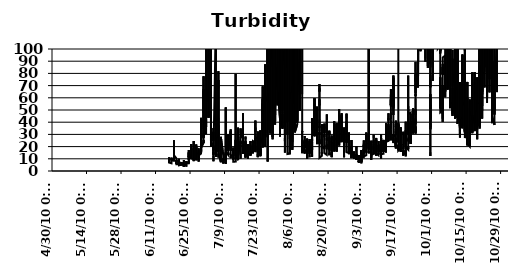
| Category | NTU+ |
|---|---|
| 6/16/10 | 7.97 |
| 6/16/10 | 7.87 |
| 6/16/10 | 7.8 |
| 6/16/10 | 7.2 |
| 6/16/10 | 7.1 |
| 6/16/10 | 11.1 |
| 6/16/10 | 10.4 |
| 6/16/10 | 9.2 |
| 6/16/10 | 9.8 |
| 6/16/10 | 9.6 |
| 6/16/10 | 8.6 |
| 6/16/10 | 8.2 |
| 6/16/10 | 8.3 |
| 6/16/10 | 8 |
| 6/16/10 | 8.8 |
| 6/16/10 | 8.1 |
| 6/16/10 | 7 |
| 6/16/10 | 7.2 |
| 6/16/10 | 7.4 |
| 6/16/10 | 7.9 |
| 6/16/10 | 8 |
| 6/16/10 | 6.9 |
| 6/16/10 | 7.6 |
| 6/16/10 | 6.8 |
| 6/17/10 | 6.3 |
| 6/17/10 | 6.6 |
| 6/17/10 | 6.2 |
| 6/17/10 | 6.4 |
| 6/17/10 | 6.5 |
| 6/17/10 | 6.4 |
| 6/17/10 | 6.9 |
| 6/17/10 | 6.9 |
| 6/17/10 | 7.1 |
| 6/17/10 | 6.4 |
| 6/17/10 | 6.9 |
| 6/17/10 | 7.2 |
| 6/17/10 | 7.3 |
| 6/17/10 | 6.7 |
| 6/17/10 | 7.2 |
| 6/17/10 | 7.5 |
| 6/17/10 | 7.4 |
| 6/17/10 | 7.6 |
| 6/17/10 | 7.7 |
| 6/17/10 | 8.2 |
| 6/17/10 | 7.9 |
| 6/17/10 | 8.4 |
| 6/17/10 | 9.1 |
| 6/17/10 | 8.8 |
| 6/17/10 | 9.2 |
| 6/17/10 | 9.3 |
| 6/17/10 | 8.6 |
| 6/17/10 | 8.7 |
| 6/17/10 | 9 |
| 6/17/10 | 9 |
| 6/17/10 | 9 |
| 6/17/10 | 10 |
| 6/17/10 | 8.9 |
| 6/17/10 | 9.3 |
| 6/17/10 | 9.6 |
| 6/17/10 | 10.9 |
| 6/17/10 | 10.2 |
| 6/17/10 | 10.8 |
| 6/17/10 | 11.4 |
| 6/17/10 | 10.7 |
| 6/17/10 | 10 |
| 6/17/10 | 9.2 |
| 6/17/10 | 8.6 |
| 6/17/10 | 8.3 |
| 6/17/10 | 9.1 |
| 6/17/10 | 9.1 |
| 6/17/10 | 8.5 |
| 6/17/10 | 8.7 |
| 6/18/10 | 8.4 |
| 6/18/10 | 9.4 |
| 6/18/10 | 10.2 |
| 6/18/10 | 9.9 |
| 6/18/10 | 11.4 |
| 6/18/10 | 11.7 |
| 6/18/10 | 11.4 |
| 6/18/10 | 11.5 |
| 6/18/10 | 11.9 |
| 6/18/10 | 13.1 |
| 6/18/10 | 12.5 |
| 6/18/10 | 13.9 |
| 6/18/10 | 12.5 |
| 6/18/10 | 14.3 |
| 6/18/10 | 16.4 |
| 6/18/10 | 17.7 |
| 6/18/10 | 18.9 |
| 6/18/10 | 18.6 |
| 6/18/10 | 20.2 |
| 6/18/10 | 20.4 |
| 6/18/10 | 20.4 |
| 6/18/10 | 15.1 |
| 6/18/10 | 25.1 |
| 6/18/10 | 16.9 |
| 6/18/10 | 16.4 |
| 6/18/10 | 15.4 |
| 6/18/10 | 13 |
| 6/18/10 | 12.4 |
| 6/18/10 | 12.5 |
| 6/18/10 | 12.9 |
| 6/18/10 | 12.6 |
| 6/18/10 | 14.1 |
| 6/18/10 | 12.1 |
| 6/18/10 | 12.1 |
| 6/18/10 | 14.6 |
| 6/18/10 | 14.4 |
| 6/18/10 | 13.8 |
| 6/18/10 | 13 |
| 6/18/10 | 14.1 |
| 6/18/10 | 14.1 |
| 6/18/10 | 13 |
| 6/18/10 | 13.1 |
| 6/18/10 | 12.1 |
| 6/18/10 | 12.3 |
| 6/18/10 | 12 |
| 6/18/10 | 12.2 |
| 6/18/10 | 11.1 |
| 6/18/10 | 12.9 |
| 6/19/10 | 10.3 |
| 6/19/10 | 10.8 |
| 6/19/10 | 10.7 |
| 6/19/10 | 10.2 |
| 6/19/10 | 10.8 |
| 6/19/10 | 10.1 |
| 6/19/10 | 10.6 |
| 6/19/10 | 9.7 |
| 6/19/10 | 9.4 |
| 6/19/10 | 8.4 |
| 6/19/10 | 8.6 |
| 6/19/10 | 7.9 |
| 6/19/10 | 7.8 |
| 6/19/10 | 7.3 |
| 6/19/10 | 7.1 |
| 6/19/10 | 7.3 |
| 6/19/10 | 7.4 |
| 6/19/10 | 6.7 |
| 6/19/10 | 5.8 |
| 6/19/10 | 6.8 |
| 6/19/10 | 7.1 |
| 6/19/10 | 8.8 |
| 6/19/10 | 7.7 |
| 6/19/10 | 8.5 |
| 6/19/10 | 8.5 |
| 6/19/10 | 7.3 |
| 6/19/10 | 8.7 |
| 6/19/10 | 7.4 |
| 6/19/10 | 7 |
| 6/19/10 | 7.1 |
| 6/19/10 | 7.3 |
| 6/19/10 | 6.8 |
| 6/19/10 | 6.9 |
| 6/19/10 | 5.6 |
| 6/19/10 | 7 |
| 6/19/10 | 6.5 |
| 6/19/10 | 7.4 |
| 6/19/10 | 6.9 |
| 6/19/10 | 7.2 |
| 6/19/10 | 7.5 |
| 6/19/10 | 9.1 |
| 6/19/10 | 6.7 |
| 6/19/10 | 6.4 |
| 6/19/10 | 6.3 |
| 6/19/10 | 5.5 |
| 6/19/10 | 5.5 |
| 6/19/10 | 5.5 |
| 6/19/10 | 5.5 |
| 6/20/10 | 5.4 |
| 6/20/10 | 6.5 |
| 6/20/10 | 5.7 |
| 6/20/10 | 5.8 |
| 6/20/10 | 5.3 |
| 6/20/10 | 5.2 |
| 6/20/10 | 5.5 |
| 6/20/10 | 5.7 |
| 6/20/10 | 4.8 |
| 6/20/10 | 5.6 |
| 6/20/10 | 6.6 |
| 6/20/10 | 5.6 |
| 6/20/10 | 5.5 |
| 6/20/10 | 5.4 |
| 6/20/10 | 5.5 |
| 6/20/10 | 5.4 |
| 6/20/10 | 5 |
| 6/20/10 | 5.2 |
| 6/20/10 | 5.6 |
| 6/20/10 | 5.3 |
| 6/20/10 | 5.8 |
| 6/20/10 | 5.3 |
| 6/20/10 | 6.3 |
| 6/20/10 | 6.8 |
| 6/20/10 | 7.8 |
| 6/20/10 | 9.7 |
| 6/20/10 | 9.4 |
| 6/20/10 | 8.5 |
| 6/20/10 | 9.1 |
| 6/20/10 | 8.7 |
| 6/20/10 | 10 |
| 6/20/10 | 10.7 |
| 6/20/10 | 10.3 |
| 6/20/10 | 9.4 |
| 6/20/10 | 9.3 |
| 6/20/10 | 8.5 |
| 6/20/10 | 7.5 |
| 6/20/10 | 7.8 |
| 6/20/10 | 6.6 |
| 6/20/10 | 7.6 |
| 6/20/10 | 6.2 |
| 6/20/10 | 5.1 |
| 6/20/10 | 5.5 |
| 6/20/10 | 6.4 |
| 6/20/10 | 4.6 |
| 6/20/10 | 5.2 |
| 6/20/10 | 5.1 |
| 6/20/10 | 4.8 |
| 6/21/10 | 5.1 |
| 6/21/10 | 6.7 |
| 6/21/10 | 6.5 |
| 6/21/10 | 7.4 |
| 6/21/10 | 5.9 |
| 6/21/10 | 4.7 |
| 6/21/10 | 6.1 |
| 6/21/10 | 5.3 |
| 6/21/10 | 5.3 |
| 6/21/10 | 5.1 |
| 6/21/10 | 5.9 |
| 6/21/10 | 4.8 |
| 6/21/10 | 4.7 |
| 6/21/10 | 6.6 |
| 6/21/10 | 5.9 |
| 6/21/10 | 5 |
| 6/21/10 | 5.3 |
| 6/21/10 | 5.2 |
| 6/21/10 | 4.7 |
| 6/21/10 | 5 |
| 6/21/10 | 7 |
| 6/21/10 | 5.8 |
| 6/21/10 | 6.1 |
| 6/21/10 | 5.2 |
| 6/21/10 | 5 |
| 6/21/10 | 5.9 |
| 6/21/10 | 6.2 |
| 6/21/10 | 5.3 |
| 6/21/10 | 7.3 |
| 6/21/10 | 4.8 |
| 6/21/10 | 5.4 |
| 6/21/10 | 6.7 |
| 6/21/10 | 6.6 |
| 6/21/10 | 6.9 |
| 6/21/10 | 6.4 |
| 6/21/10 | 6.4 |
| 6/21/10 | 5.7 |
| 6/21/10 | 5 |
| 6/21/10 | 5.5 |
| 6/21/10 | 6.4 |
| 6/21/10 | 6.2 |
| 6/21/10 | 5.3 |
| 6/21/10 | 6.1 |
| 6/21/10 | 4.9 |
| 6/21/10 | 6.8 |
| 6/21/10 | 5.4 |
| 6/21/10 | 5.5 |
| 6/21/10 | 6.4 |
| 6/22/10 | 4.8 |
| 6/22/10 | 4.8 |
| 6/22/10 | 4.9 |
| 6/22/10 | 4.8 |
| 6/22/10 | 3.8 |
| 6/22/10 | 3.5 |
| 6/22/10 | 3.8 |
| 6/22/10 | 5.6 |
| 6/22/10 | 3.3 |
| 6/22/10 | 5 |
| 6/22/10 | 4.6 |
| 6/22/10 | 4 |
| 6/22/10 | 3.9 |
| 6/22/10 | 5 |
| 6/22/10 | 5.1 |
| 6/22/10 | 3.9 |
| 6/22/10 | 4.2 |
| 6/22/10 | 3.6 |
| 6/22/10 | 3.7 |
| 6/22/10 | 3.4 |
| 6/22/10 | 3.4 |
| 6/22/10 | 4.1 |
| 6/22/10 | 4 |
| 6/22/10 | 4.3 |
| 6/22/10 | 3.9 |
| 6/22/10 | 3.7 |
| 6/22/10 | 4.1 |
| 6/22/10 | 5.7 |
| 6/22/10 | 4.7 |
| 6/22/10 | 5.1 |
| 6/22/10 | 5 |
| 6/22/10 | 5.3 |
| 6/22/10 | 6.3 |
| 6/22/10 | 5.5 |
| 6/22/10 | 8.9 |
| 6/22/10 | 8.1 |
| 6/22/10 | 8.7 |
| 6/22/10 | 8.2 |
| 6/22/10 | 8.6 |
| 6/22/10 | 8.4 |
| 6/22/10 | 7.7 |
| 6/22/10 | 7.2 |
| 6/22/10 | 5 |
| 6/22/10 | 4.9 |
| 6/22/10 | 4.4 |
| 6/22/10 | 4.1 |
| 6/22/10 | 5.4 |
| 6/22/10 | 4.7 |
| 6/23/10 | 4.7 |
| 6/23/10 | 4.7 |
| 6/23/10 | 4.7 |
| 6/23/10 | 4.1 |
| 6/23/10 | 4.5 |
| 6/23/10 | 5.3 |
| 6/23/10 | 4.4 |
| 6/23/10 | 4.8 |
| 6/23/10 | 4.7 |
| 6/23/10 | 4.4 |
| 6/23/10 | 4.7 |
| 6/23/10 | 5.4 |
| 6/23/10 | 4.9 |
| 6/23/10 | 5.1 |
| 6/23/10 | 5.1 |
| 6/23/10 | 4.5 |
| 6/23/10 | 5 |
| 6/23/10 | 3.6 |
| 6/23/10 | 4.6 |
| 6/23/10 | 4 |
| 6/23/10 | 4.7 |
| 6/23/10 | 5.8 |
| 6/23/10 | 5 |
| 6/23/10 | 5.7 |
| 6/23/10 | 5.5 |
| 6/23/10 | 5.4 |
| 6/23/10 | 6 |
| 6/23/10 | 7.5 |
| 6/23/10 | 7.6 |
| 6/23/10 | 5.8 |
| 6/23/10 | 6 |
| 6/23/10 | 6.6 |
| 6/23/10 | 7.9 |
| 6/23/10 | 7.1 |
| 6/23/10 | 7.4 |
| 6/23/10 | 6 |
| 6/23/10 | 7 |
| 6/23/10 | 7.9 |
| 6/23/10 | 7.1 |
| 6/23/10 | 6 |
| 6/23/10 | 7.2 |
| 6/23/10 | 6.6 |
| 6/23/10 | 6.5 |
| 6/23/10 | 7.1 |
| 6/23/10 | 7.6 |
| 6/23/10 | 6.6 |
| 6/23/10 | 7.5 |
| 6/23/10 | 6.1 |
| 6/24/10 | 6.3 |
| 6/24/10 | 7.1 |
| 6/24/10 | 6.2 |
| 6/24/10 | 6.9 |
| 6/24/10 | 6.4 |
| 6/24/10 | 7 |
| 6/24/10 | 6.1 |
| 6/24/10 | 7.3 |
| 6/24/10 | 6.3 |
| 6/24/10 | 6.7 |
| 6/24/10 | 6.9 |
| 6/24/10 | 7.2 |
| 6/24/10 | 6.4 |
| 6/24/10 | 8.3 |
| 6/24/10 | 7.7 |
| 6/24/10 | 7.6 |
| 6/24/10 | 7.9 |
| 6/24/10 | 6.9 |
| 6/24/10 | 7.5 |
| 6/24/10 | 8.9 |
| 6/24/10 | 8.9 |
| 6/24/10 | 8.9 |
| 6/24/10 | 8.9 |
| 6/24/10 | 9.9 |
| 6/24/10 | 9 |
| 6/24/10 | 9.6 |
| 6/24/10 | 8.9 |
| 6/24/10 | 10.7 |
| 6/24/10 | 13.5 |
| 6/24/10 | 14.6 |
| 6/24/10 | 14.9 |
| 6/24/10 | 17.2 |
| 6/24/10 | 13.4 |
| 6/24/10 | 11.7 |
| 6/24/10 | 13.8 |
| 6/24/10 | 15.4 |
| 6/24/10 | 14 |
| 6/24/10 | 14.8 |
| 6/24/10 | 11.7 |
| 6/24/10 | 11.7 |
| 6/24/10 | 14.1 |
| 6/24/10 | 15 |
| 6/24/10 | 11.2 |
| 6/24/10 | 12.5 |
| 6/24/10 | 9.8 |
| 6/24/10 | 11.7 |
| 6/24/10 | 12.1 |
| 6/24/10 | 12.5 |
| 6/25/10 | 12.7 |
| 6/25/10 | 11.1 |
| 6/25/10 | 11.9 |
| 6/25/10 | 12.1 |
| 6/25/10 | 14.7 |
| 6/25/10 | 11.5 |
| 6/25/10 | 13.3 |
| 6/25/10 | 11.1 |
| 6/25/10 | 10.2 |
| 6/25/10 | 10.1 |
| 6/25/10 | 14.1 |
| 6/25/10 | 11.7 |
| 6/25/10 | 13.8 |
| 6/25/10 | 11.7 |
| 6/25/10 | 12.4 |
| 6/25/10 | 15.4 |
| 6/25/10 | 15.4 |
| 6/25/10 | 16 |
| 6/25/10 | 14.1 |
| 6/25/10 | 18.5 |
| 6/25/10 | 14.1 |
| 6/25/10 | 18 |
| 6/25/10 | 16.3 |
| 6/25/10 | 15.1 |
| 6/25/10 | 17.3 |
| 6/25/10 | 16.1 |
| 6/25/10 | 22.1 |
| 6/25/10 | 13.2 |
| 6/25/10 | 13.5 |
| 6/25/10 | 16.8 |
| 6/25/10 | 18.9 |
| 6/25/10 | 16.9 |
| 6/25/10 | 16.8 |
| 6/25/10 | 12.4 |
| 6/25/10 | 12.2 |
| 6/25/10 | 12.6 |
| 6/25/10 | 11.1 |
| 6/25/10 | 12.6 |
| 6/25/10 | 12 |
| 6/25/10 | 10.5 |
| 6/25/10 | 10.5 |
| 6/25/10 | 11 |
| 6/25/10 | 11.9 |
| 6/25/10 | 13.3 |
| 6/25/10 | 10.2 |
| 6/25/10 | 10.4 |
| 6/25/10 | 10.6 |
| 6/25/10 | 11 |
| 6/26/10 | 9.7 |
| 6/26/10 | 10.2 |
| 6/26/10 | 8.9 |
| 6/26/10 | 9 |
| 6/26/10 | 9.8 |
| 6/26/10 | 9.3 |
| 6/26/10 | 10.6 |
| 6/26/10 | 9.7 |
| 6/26/10 | 9.2 |
| 6/26/10 | 9.7 |
| 6/26/10 | 10.2 |
| 6/26/10 | 9.7 |
| 6/26/10 | 10.1 |
| 6/26/10 | 13.4 |
| 6/26/10 | 13.6 |
| 6/26/10 | 12.2 |
| 6/26/10 | 14.2 |
| 6/26/10 | 14 |
| 6/26/10 | 11.3 |
| 6/26/10 | 11.8 |
| 6/26/10 | 10.2 |
| 6/26/10 | 13.5 |
| 6/26/10 | 13.1 |
| 6/26/10 | 10.6 |
| 6/26/10 | 12.4 |
| 6/26/10 | 13.7 |
| 6/26/10 | 12.6 |
| 6/26/10 | 10.6 |
| 6/26/10 | 10.4 |
| 6/26/10 | 10.8 |
| 6/26/10 | 14.3 |
| 6/26/10 | 11.2 |
| 6/26/10 | 14.8 |
| 6/26/10 | 11.8 |
| 6/26/10 | 10.5 |
| 6/26/10 | 17.2 |
| 6/26/10 | 16.5 |
| 6/26/10 | 11.6 |
| 6/26/10 | 16.6 |
| 6/26/10 | 10.1 |
| 6/26/10 | 12.1 |
| 6/26/10 | 12.9 |
| 6/26/10 | 8.1 |
| 6/26/10 | 11.8 |
| 6/26/10 | 9.9 |
| 6/26/10 | 24.5 |
| 6/26/10 | 12 |
| 6/26/10 | 9.6 |
| 6/27/10 | 10.6 |
| 6/27/10 | 11.5 |
| 6/27/10 | 9.9 |
| 6/27/10 | 15.1 |
| 6/27/10 | 8.8 |
| 6/27/10 | 9.8 |
| 6/27/10 | 10.9 |
| 6/27/10 | 9.2 |
| 6/27/10 | 9.6 |
| 6/27/10 | 10 |
| 6/27/10 | 10.3 |
| 6/27/10 | 10.9 |
| 6/27/10 | 9.7 |
| 6/27/10 | 10.8 |
| 6/27/10 | 10.6 |
| 6/27/10 | 9.4 |
| 6/27/10 | 10.5 |
| 6/27/10 | 10.8 |
| 6/27/10 | 10.1 |
| 6/27/10 | 9.4 |
| 6/27/10 | 9.3 |
| 6/27/10 | 9.9 |
| 6/27/10 | 9.5 |
| 6/27/10 | 9 |
| 6/27/10 | 16.3 |
| 6/27/10 | 13.1 |
| 6/27/10 | 9.7 |
| 6/27/10 | 14.8 |
| 6/27/10 | 12.7 |
| 6/27/10 | 19.2 |
| 6/27/10 | 13.5 |
| 6/27/10 | 19.7 |
| 6/27/10 | 15.9 |
| 6/27/10 | 16.2 |
| 6/27/10 | 21.7 |
| 6/27/10 | 15.4 |
| 6/27/10 | 12.4 |
| 6/27/10 | 16.4 |
| 6/27/10 | 16.5 |
| 6/27/10 | 14.6 |
| 6/27/10 | 14.1 |
| 6/27/10 | 11.3 |
| 6/27/10 | 11.5 |
| 6/27/10 | 11.9 |
| 6/27/10 | 12 |
| 6/27/10 | 14 |
| 6/27/10 | 11 |
| 6/27/10 | 15.9 |
| 6/28/10 | 13.3 |
| 6/28/10 | 10.6 |
| 6/28/10 | 9.8 |
| 6/28/10 | 11.7 |
| 6/28/10 | 13.8 |
| 6/28/10 | 13.3 |
| 6/28/10 | 9.8 |
| 6/28/10 | 10.8 |
| 6/28/10 | 12 |
| 6/28/10 | 15.2 |
| 6/28/10 | 10.8 |
| 6/28/10 | 13 |
| 6/28/10 | 14.8 |
| 6/28/10 | 8.8 |
| 6/28/10 | 12.7 |
| 6/28/10 | 10.8 |
| 6/28/10 | 11.4 |
| 6/28/10 | 12.1 |
| 6/28/10 | 11.1 |
| 6/28/10 | 10 |
| 6/28/10 | 12.4 |
| 6/28/10 | 11.4 |
| 6/28/10 | 12.3 |
| 6/28/10 | 11.7 |
| 6/28/10 | 14.1 |
| 6/28/10 | 15.8 |
| 6/28/10 | 11.1 |
| 6/28/10 | 11.5 |
| 6/28/10 | 11.5 |
| 6/28/10 | 12 |
| 6/28/10 | 12.6 |
| 6/28/10 | 14.6 |
| 6/28/10 | 15.7 |
| 6/28/10 | 15.2 |
| 6/28/10 | 18.6 |
| 6/28/10 | 14.4 |
| 6/28/10 | 11.6 |
| 6/28/10 | 13.3 |
| 6/28/10 | 13.1 |
| 6/28/10 | 17.1 |
| 6/28/10 | 16.4 |
| 6/28/10 | 17.3 |
| 6/28/10 | 13.5 |
| 6/28/10 | 7.7 |
| 6/28/10 | 11.6 |
| 6/28/10 | 13.7 |
| 6/28/10 | 12.7 |
| 6/28/10 | 13.3 |
| 6/29/10 | 14.3 |
| 6/29/10 | 13.7 |
| 6/29/10 | 14.6 |
| 6/29/10 | 13.9 |
| 6/29/10 | 15.3 |
| 6/29/10 | 16.2 |
| 6/29/10 | 15.3 |
| 6/29/10 | 16.6 |
| 6/29/10 | 17.4 |
| 6/29/10 | 17.4 |
| 6/29/10 | 17.8 |
| 6/29/10 | 19.3 |
| 6/29/10 | 20.1 |
| 6/29/10 | 20.7 |
| 6/29/10 | 22.8 |
| 6/29/10 | 20.7 |
| 6/29/10 | 21.1 |
| 6/29/10 | 22.1 |
| 6/29/10 | 20.4 |
| 6/29/10 | 20.3 |
| 6/29/10 | 28 |
| 6/29/10 | 20.4 |
| 6/29/10 | 21.8 |
| 6/29/10 | 21 |
| 6/29/10 | 22 |
| 6/29/10 | 23.1 |
| 6/29/10 | 23.2 |
| 6/29/10 | 30.7 |
| 6/29/10 | 26.6 |
| 6/29/10 | 29 |
| 6/29/10 | 27.5 |
| 6/29/10 | 27.6 |
| 6/29/10 | 27.8 |
| 6/29/10 | 33.6 |
| 6/29/10 | 33.3 |
| 6/29/10 | 37.1 |
| 6/29/10 | 35.9 |
| 6/29/10 | 38.9 |
| 6/29/10 | 42.6 |
| 6/29/10 | 32.8 |
| 6/29/10 | 28.7 |
| 6/29/10 | 30.3 |
| 6/29/10 | 31 |
| 6/29/10 | 43.6 |
| 6/29/10 | 16.2 |
| 6/29/10 | 17.6 |
| 6/29/10 | 21.7 |
| 6/29/10 | 19.2 |
| 6/30/10 | 23.3 |
| 6/30/10 | 22.6 |
| 6/30/10 | 25.4 |
| 6/30/10 | 23.1 |
| 6/30/10 | 23.6 |
| 6/30/10 | 24 |
| 6/30/10 | 29.7 |
| 6/30/10 | 27.2 |
| 6/30/10 | 30.9 |
| 6/30/10 | 29.8 |
| 6/30/10 | 33 |
| 6/30/10 | 36 |
| 6/30/10 | 37.3 |
| 6/30/10 | 40.9 |
| 6/30/10 | 40.3 |
| 6/30/10 | 40.8 |
| 6/30/10 | 40 |
| 6/30/10 | 37.9 |
| 6/30/10 | 53 |
| 6/30/10 | 60.9 |
| 6/30/10 | 61.1 |
| 6/30/10 | 48 |
| 6/30/10 | 61.2 |
| 6/30/10 | 55.6 |
| 6/30/10 | 77.6 |
| 6/30/10 | 78 |
| 6/30/10 | 66.6 |
| 6/30/10 | 62.8 |
| 6/30/10 | 50.3 |
| 6/30/10 | 43.1 |
| 6/30/10 | 46.3 |
| 6/30/10 | 52.3 |
| 6/30/10 | 55.4 |
| 6/30/10 | 59.5 |
| 6/30/10 | 63.9 |
| 6/30/10 | 62.3 |
| 6/30/10 | 65.5 |
| 6/30/10 | 59.8 |
| 6/30/10 | 67.3 |
| 6/30/10 | 39.2 |
| 6/30/10 | 42.9 |
| 6/30/10 | 34.4 |
| 6/30/10 | 38.4 |
| 6/30/10 | 31.6 |
| 6/30/10 | 31.7 |
| 6/30/10 | 31.5 |
| 6/30/10 | 28 |
| 6/30/10 | 35.1 |
| 7/1/10 | 30.3 |
| 7/1/10 | 44.7 |
| 7/1/10 | 39.2 |
| 7/1/10 | 35.7 |
| 7/1/10 | 39.6 |
| 7/1/10 | 42.4 |
| 7/1/10 | 35.8 |
| 7/1/10 | 37.3 |
| 7/1/10 | 37.3 |
| 7/1/10 | 39.5 |
| 7/1/10 | 42.6 |
| 7/1/10 | 45 |
| 7/1/10 | 50.4 |
| 7/1/10 | 51.1 |
| 7/1/10 | 51.9 |
| 7/1/10 | 50.5 |
| 7/1/10 | 63.4 |
| 7/1/10 | 47.7 |
| 7/1/10 | 63 |
| 7/1/10 | 44.5 |
| 7/1/10 | 48.8 |
| 7/1/10 | 72.2 |
| 7/1/10 | 52.1 |
| 7/1/10 | 63.9 |
| 7/1/10 | 64.6 |
| 7/1/10 | 62.6 |
| 7/1/10 | 60 |
| 7/1/10 | 71.5 |
| 7/1/10 | 91.5 |
| 7/1/10 | 75.7 |
| 7/1/10 | 69.5 |
| 7/1/10 | 62.7 |
| 7/1/10 | 95.1 |
| 7/1/10 | 67 |
| 7/1/10 | 76.7 |
| 7/1/10 | 94.7 |
| 7/1/10 | 83.6 |
| 7/1/10 | 128.4 |
| 7/1/10 | 67.5 |
| 7/1/10 | 110.8 |
| 7/1/10 | 68.5 |
| 7/1/10 | 66.3 |
| 7/1/10 | 56.4 |
| 7/1/10 | 55.5 |
| 7/1/10 | 47.9 |
| 7/1/10 | 62 |
| 7/1/10 | 57 |
| 7/1/10 | 49.6 |
| 7/2/10 | 70.4 |
| 7/2/10 | 64.3 |
| 7/2/10 | 56.4 |
| 7/2/10 | 52.4 |
| 7/2/10 | 49.8 |
| 7/2/10 | 46.5 |
| 7/2/10 | 47.7 |
| 7/2/10 | 47.6 |
| 7/2/10 | 49.3 |
| 7/2/10 | 52.4 |
| 7/2/10 | 61.9 |
| 7/2/10 | 58.8 |
| 7/2/10 | 56.9 |
| 7/2/10 | 57 |
| 7/2/10 | 71.8 |
| 7/2/10 | 65.1 |
| 7/2/10 | 73.4 |
| 7/2/10 | 77 |
| 7/2/10 | 68.3 |
| 7/2/10 | 62.7 |
| 7/2/10 | 77.2 |
| 7/2/10 | 73.6 |
| 7/2/10 | 61.1 |
| 7/2/10 | 88.4 |
| 7/2/10 | 66.6 |
| 7/2/10 | 101.5 |
| 7/2/10 | 69.6 |
| 7/2/10 | 82.3 |
| 7/2/10 | 52.2 |
| 7/2/10 | 83.1 |
| 7/2/10 | 44.3 |
| 7/2/10 | 57.9 |
| 7/2/10 | 50.1 |
| 7/2/10 | 64.4 |
| 7/2/10 | 76.6 |
| 7/2/10 | 77 |
| 7/2/10 | 52.7 |
| 7/2/10 | 48.4 |
| 7/2/10 | 91.7 |
| 7/2/10 | 66.7 |
| 7/2/10 | 69 |
| 7/2/10 | 106.9 |
| 7/2/10 | 48.1 |
| 7/2/10 | 49.3 |
| 7/2/10 | 53.5 |
| 7/2/10 | 80.7 |
| 7/2/10 | 43.5 |
| 7/2/10 | 95.4 |
| 7/3/10 | 55.6 |
| 7/3/10 | 19.9 |
| 7/3/10 | 22.6 |
| 7/3/10 | 25 |
| 7/3/10 | 31.5 |
| 7/3/10 | 53.9 |
| 7/3/10 | 36.3 |
| 7/3/10 | 31.7 |
| 7/3/10 | 32.3 |
| 7/3/10 | 32.5 |
| 7/3/10 | 36.5 |
| 7/3/10 | 33.8 |
| 7/3/10 | 34.6 |
| 7/3/10 | 42.9 |
| 7/3/10 | 37.5 |
| 7/3/10 | 39.5 |
| 7/3/10 | 84.9 |
| 7/3/10 | 54.4 |
| 7/3/10 | 60 |
| 7/3/10 | 67.4 |
| 7/3/10 | 61.9 |
| 7/3/10 | 81.9 |
| 7/3/10 | 48.1 |
| 7/3/10 | 48.8 |
| 7/3/10 | 89.4 |
| 7/3/10 | 40.6 |
| 7/3/10 | 42 |
| 7/3/10 | 46.7 |
| 7/3/10 | 55 |
| 7/3/10 | 146.4 |
| 7/3/10 | 45.1 |
| 7/3/10 | 103.6 |
| 7/3/10 | 50.4 |
| 7/3/10 | 53.1 |
| 7/3/10 | 61.5 |
| 7/3/10 | 289.8 |
| 7/3/10 | 286.4 |
| 7/3/10 | 225.2 |
| 7/3/10 | 219.8 |
| 7/3/10 | 186.2 |
| 7/3/10 | 186.1 |
| 7/3/10 | 85.6 |
| 7/3/10 | 85 |
| 7/3/10 | 159.9 |
| 7/3/10 | 122.6 |
| 7/3/10 | 212.1 |
| 7/3/10 | 314.1 |
| 7/3/10 | 24 |
| 7/4/10 | 20.5 |
| 7/4/10 | 14.2 |
| 7/4/10 | 15.5 |
| 7/4/10 | 13.3 |
| 7/4/10 | 14 |
| 7/4/10 | 15 |
| 7/4/10 | 16 |
| 7/4/10 | 17 |
| 7/4/10 | 16.7 |
| 7/4/10 | 21 |
| 7/4/10 | 18.1 |
| 7/4/10 | 17.5 |
| 7/4/10 | 17.6 |
| 7/4/10 | 17.7 |
| 7/4/10 | 17.2 |
| 7/4/10 | 19 |
| 7/4/10 | 19.6 |
| 7/4/10 | 18.7 |
| 7/4/10 | 19 |
| 7/4/10 | 20.8 |
| 7/4/10 | 16.9 |
| 7/4/10 | 17.5 |
| 7/4/10 | 17.5 |
| 7/4/10 | 18.6 |
| 7/4/10 | 21.2 |
| 7/4/10 | 20.7 |
| 7/4/10 | 21.2 |
| 7/4/10 | 32.2 |
| 7/4/10 | 24.5 |
| 7/4/10 | 24.5 |
| 7/4/10 | 29.6 |
| 7/4/10 | 25.3 |
| 7/4/10 | 27.3 |
| 7/4/10 | 26.6 |
| 7/4/10 | 28.5 |
| 7/4/10 | 35.2 |
| 7/4/10 | 26.3 |
| 7/4/10 | 28.8 |
| 7/4/10 | 29.8 |
| 7/4/10 | 32 |
| 7/4/10 | 27.7 |
| 7/4/10 | 30.2 |
| 7/4/10 | 31.2 |
| 7/4/10 | 31.1 |
| 7/4/10 | 26.6 |
| 7/4/10 | 26 |
| 7/4/10 | 8 |
| 7/4/10 | 12.5 |
| 7/5/10 | 126.3 |
| 7/5/10 | 13.3 |
| 7/5/10 | 42.2 |
| 7/5/10 | 42.2 |
| 7/5/10 | 17.4 |
| 7/5/10 | 33.8 |
| 7/5/10 | 17.9 |
| 7/5/10 | 11.5 |
| 7/5/10 | 15.8 |
| 7/5/10 | 19.1 |
| 7/5/10 | 25.6 |
| 7/5/10 | 28.7 |
| 7/5/10 | 37.4 |
| 7/5/10 | 28.6 |
| 7/5/10 | 19.6 |
| 7/5/10 | 16.1 |
| 7/5/10 | 18.9 |
| 7/5/10 | 16 |
| 7/5/10 | 19.4 |
| 7/5/10 | 20.5 |
| 7/5/10 | 30.1 |
| 7/5/10 | 30.8 |
| 7/5/10 | 25.7 |
| 7/5/10 | 23.6 |
| 7/5/10 | 25.2 |
| 7/5/10 | 26.4 |
| 7/5/10 | 31.7 |
| 7/5/10 | 15.3 |
| 7/5/10 | 14.2 |
| 7/5/10 | 13.6 |
| 7/5/10 | 13.1 |
| 7/5/10 | 13.4 |
| 7/5/10 | 15.5 |
| 7/5/10 | 13.2 |
| 7/5/10 | 14.1 |
| 7/5/10 | 14.2 |
| 7/5/10 | 12.7 |
| 7/5/10 | 12.6 |
| 7/5/10 | 13.7 |
| 7/5/10 | 12.9 |
| 7/5/10 | 18.3 |
| 7/5/10 | 14.7 |
| 7/5/10 | 15.4 |
| 7/5/10 | 13.9 |
| 7/5/10 | 13.2 |
| 7/5/10 | 13.1 |
| 7/5/10 | 14 |
| 7/5/10 | 26.3 |
| 7/6/10 | 29.7 |
| 7/6/10 | 29.5 |
| 7/6/10 | 28.2 |
| 7/6/10 | 20.1 |
| 7/6/10 | 18.9 |
| 7/6/10 | 17.4 |
| 7/6/10 | 19.4 |
| 7/6/10 | 20.7 |
| 7/6/10 | 19.1 |
| 7/6/10 | 18.8 |
| 7/6/10 | 26.7 |
| 7/6/10 | 24 |
| 7/6/10 | 16.9 |
| 7/6/10 | 18.4 |
| 7/6/10 | 16.4 |
| 7/6/10 | 37.4 |
| 7/6/10 | 18.8 |
| 7/6/10 | 33 |
| 7/6/10 | 31.4 |
| 7/6/10 | 74.6 |
| 7/6/10 | 67.8 |
| 7/6/10 | 30.8 |
| 7/6/10 | 27.9 |
| 7/6/10 | 24.5 |
| 7/6/10 | 23.3 |
| 7/6/10 | 26.9 |
| 7/6/10 | 23.8 |
| 7/6/10 | 24.1 |
| 7/6/10 | 23.8 |
| 7/6/10 | 23.7 |
| 7/6/10 | 27.6 |
| 7/6/10 | 35.2 |
| 7/6/10 | 25.4 |
| 7/6/10 | 30.8 |
| 7/6/10 | 26 |
| 7/6/10 | 18.1 |
| 7/6/10 | 17.6 |
| 7/6/10 | 43.7 |
| 7/6/10 | 81.8 |
| 7/6/10 | 15.8 |
| 7/6/10 | 24.6 |
| 7/6/10 | 22 |
| 7/6/10 | 17.9 |
| 7/6/10 | 19.5 |
| 7/6/10 | 19.8 |
| 7/6/10 | 14.7 |
| 7/6/10 | 11.1 |
| 7/6/10 | 14.4 |
| 7/7/10 | 8 |
| 7/7/10 | 11 |
| 7/7/10 | 13.6 |
| 7/7/10 | 14.1 |
| 7/7/10 | 18.5 |
| 7/7/10 | 13.6 |
| 7/7/10 | 17.5 |
| 7/7/10 | 9.6 |
| 7/7/10 | 9.4 |
| 7/7/10 | 9 |
| 7/7/10 | 10 |
| 7/7/10 | 11 |
| 7/7/10 | 10.2 |
| 7/7/10 | 10.1 |
| 7/7/10 | 10.7 |
| 7/7/10 | 10.9 |
| 7/7/10 | 9.4 |
| 7/7/10 | 11.3 |
| 7/7/10 | 11.7 |
| 7/7/10 | 7.2 |
| 7/7/10 | 9.6 |
| 7/7/10 | 11.6 |
| 7/7/10 | 11.9 |
| 7/7/10 | 13.2 |
| 7/7/10 | 11.8 |
| 7/7/10 | 10.8 |
| 7/7/10 | 10.2 |
| 7/7/10 | 10.5 |
| 7/7/10 | 12.5 |
| 7/7/10 | 11.7 |
| 7/7/10 | 12.7 |
| 7/7/10 | 16.1 |
| 7/7/10 | 12.2 |
| 7/7/10 | 14.1 |
| 7/7/10 | 15.4 |
| 7/7/10 | 12.9 |
| 7/7/10 | 13.2 |
| 7/7/10 | 13.1 |
| 7/7/10 | 12.1 |
| 7/7/10 | 11.8 |
| 7/7/10 | 12.5 |
| 7/7/10 | 11.5 |
| 7/7/10 | 13.5 |
| 7/7/10 | 12.3 |
| 7/7/10 | 11.8 |
| 7/7/10 | 12.4 |
| 7/7/10 | 11.8 |
| 7/7/10 | 28 |
| 7/8/10 | 12.9 |
| 7/8/10 | 8.8 |
| 7/8/10 | 8.2 |
| 7/8/10 | 7.3 |
| 7/8/10 | 7.7 |
| 7/8/10 | 7.4 |
| 7/8/10 | 8.3 |
| 7/8/10 | 7.5 |
| 7/8/10 | 7.4 |
| 7/8/10 | 7.2 |
| 7/8/10 | 7.5 |
| 7/8/10 | 6.9 |
| 7/8/10 | 7 |
| 7/8/10 | 8.4 |
| 7/8/10 | 8.9 |
| 7/8/10 | 7.5 |
| 7/8/10 | 6.7 |
| 7/8/10 | 6.4 |
| 7/8/10 | 6.3 |
| 7/8/10 | 7.2 |
| 7/8/10 | 7.2 |
| 7/8/10 | 6.5 |
| 7/8/10 | 8 |
| 7/8/10 | 7.6 |
| 7/8/10 | 6.4 |
| 7/8/10 | 6.6 |
| 7/8/10 | 8 |
| 7/8/10 | 7.6 |
| 7/8/10 | 6.6 |
| 7/8/10 | 9.6 |
| 7/8/10 | 9 |
| 7/8/10 | 8.8 |
| 7/8/10 | 9.1 |
| 7/8/10 | 9 |
| 7/8/10 | 7.4 |
| 7/8/10 | 7.9 |
| 7/8/10 | 6.3 |
| 7/8/10 | 8.3 |
| 7/8/10 | 7.1 |
| 7/8/10 | 10.1 |
| 7/8/10 | 8.2 |
| 7/8/10 | 9.9 |
| 7/8/10 | 9.3 |
| 7/8/10 | 10.2 |
| 7/8/10 | 9.9 |
| 7/8/10 | 8 |
| 7/8/10 | 9.8 |
| 7/8/10 | 9.4 |
| 7/9/10 | 9.4 |
| 7/9/10 | 8.7 |
| 7/9/10 | 9 |
| 7/9/10 | 5.8 |
| 7/9/10 | 6.5 |
| 7/9/10 | 52.1 |
| 7/9/10 | 9.6 |
| 7/9/10 | 9.5 |
| 7/9/10 | 8.6 |
| 7/9/10 | 9.2 |
| 7/9/10 | 9 |
| 7/9/10 | 8 |
| 7/9/10 | 7.1 |
| 7/9/10 | 7.6 |
| 7/9/10 | 8.3 |
| 7/9/10 | 10.4 |
| 7/9/10 | 7.3 |
| 7/9/10 | 13.1 |
| 7/9/10 | 9.3 |
| 7/9/10 | 9.4 |
| 7/9/10 | 11.4 |
| 7/9/10 | 9.7 |
| 7/9/10 | 12.2 |
| 7/9/10 | 9.6 |
| 7/9/10 | 9.9 |
| 7/9/10 | 14.1 |
| 7/9/10 | 12.5 |
| 7/9/10 | 13 |
| 7/9/10 | 12.1 |
| 7/9/10 | 11.5 |
| 7/9/10 | 12.3 |
| 7/9/10 | 15.3 |
| 7/9/10 | 12.9 |
| 7/9/10 | 11.3 |
| 7/9/10 | 9.9 |
| 7/9/10 | 8.7 |
| 7/9/10 | 11.3 |
| 7/9/10 | 13.5 |
| 7/9/10 | 12 |
| 7/9/10 | 9.9 |
| 7/9/10 | 8.8 |
| 7/9/10 | 10.1 |
| 7/9/10 | 9.2 |
| 7/9/10 | 11.4 |
| 7/9/10 | 10.7 |
| 7/9/10 | 14.5 |
| 7/9/10 | 13.1 |
| 7/9/10 | 15.7 |
| 7/10/10 | 13.1 |
| 7/10/10 | 13.7 |
| 7/10/10 | 12.4 |
| 7/10/10 | 12.9 |
| 7/10/10 | 14.1 |
| 7/10/10 | 13.1 |
| 7/10/10 | 15.1 |
| 7/10/10 | 13.3 |
| 7/10/10 | 14.4 |
| 7/10/10 | 15.2 |
| 7/10/10 | 16.4 |
| 7/10/10 | 17.2 |
| 7/10/10 | 19.9 |
| 7/10/10 | 18 |
| 7/10/10 | 16.3 |
| 7/10/10 | 16.3 |
| 7/10/10 | 17.1 |
| 7/10/10 | 19.9 |
| 7/10/10 | 21.6 |
| 7/10/10 | 21.9 |
| 7/10/10 | 21.5 |
| 7/10/10 | 19.4 |
| 7/10/10 | 21.7 |
| 7/10/10 | 19.1 |
| 7/10/10 | 20.8 |
| 7/10/10 | 19 |
| 7/10/10 | 22.6 |
| 7/10/10 | 29 |
| 7/10/10 | 21.5 |
| 7/10/10 | 25.1 |
| 7/10/10 | 23.7 |
| 7/10/10 | 27.8 |
| 7/10/10 | 21.9 |
| 7/10/10 | 22.5 |
| 7/10/10 | 23 |
| 7/10/10 | 26.5 |
| 7/10/10 | 27.2 |
| 7/10/10 | 28 |
| 7/10/10 | 23.7 |
| 7/10/10 | 26.2 |
| 7/10/10 | 30 |
| 7/10/10 | 28.5 |
| 7/10/10 | 24.8 |
| 7/10/10 | 26.7 |
| 7/10/10 | 29.8 |
| 7/10/10 | 27.8 |
| 7/10/10 | 26.8 |
| 7/10/10 | 27.4 |
| 7/11/10 | 18.6 |
| 7/11/10 | 24.8 |
| 7/11/10 | 22.8 |
| 7/11/10 | 25.6 |
| 7/11/10 | 17.4 |
| 7/11/10 | 20 |
| 7/11/10 | 16.6 |
| 7/11/10 | 18.7 |
| 7/11/10 | 20.6 |
| 7/11/10 | 18.3 |
| 7/11/10 | 20.9 |
| 7/11/10 | 21.3 |
| 7/11/10 | 21.4 |
| 7/11/10 | 21.7 |
| 7/11/10 | 24.5 |
| 7/11/10 | 23.5 |
| 7/11/10 | 24.3 |
| 7/11/10 | 25.3 |
| 7/11/10 | 27.1 |
| 7/11/10 | 25.9 |
| 7/11/10 | 26.7 |
| 7/11/10 | 26.2 |
| 7/11/10 | 23.2 |
| 7/11/10 | 25.7 |
| 7/11/10 | 34.1 |
| 7/11/10 | 20.6 |
| 7/11/10 | 29.1 |
| 7/11/10 | 29.4 |
| 7/11/10 | 30 |
| 7/11/10 | 25.9 |
| 7/11/10 | 29.7 |
| 7/11/10 | 27.9 |
| 7/11/10 | 29.7 |
| 7/11/10 | 29.6 |
| 7/11/10 | 28.5 |
| 7/11/10 | 26.6 |
| 7/11/10 | 26.2 |
| 7/11/10 | 32.2 |
| 7/11/10 | 27.3 |
| 7/11/10 | 32.9 |
| 7/11/10 | 30.6 |
| 7/11/10 | 28.6 |
| 7/11/10 | 21.4 |
| 7/11/10 | 19 |
| 7/11/10 | 22.5 |
| 7/11/10 | 20.5 |
| 7/11/10 | 10.5 |
| 7/11/10 | 12.3 |
| 7/12/10 | 13.8 |
| 7/12/10 | 13.5 |
| 7/12/10 | 11.6 |
| 7/12/10 | 12.3 |
| 7/12/10 | 11.4 |
| 7/12/10 | 9.2 |
| 7/12/10 | 10.9 |
| 7/12/10 | 9.8 |
| 7/12/10 | 12.8 |
| 7/12/10 | 13.9 |
| 7/12/10 | 12.7 |
| 7/12/10 | 12.7 |
| 7/12/10 | 12.4 |
| 7/12/10 | 12.8 |
| 7/12/10 | 13 |
| 7/12/10 | 13 |
| 7/12/10 | 12.8 |
| 7/12/10 | 13.5 |
| 7/12/10 | 13.5 |
| 7/12/10 | 14.6 |
| 7/12/10 | 12.3 |
| 7/12/10 | 13.6 |
| 7/12/10 | 12.9 |
| 7/12/10 | 13.8 |
| 7/12/10 | 13.9 |
| 7/12/10 | 16 |
| 7/12/10 | 15.9 |
| 7/12/10 | 16.7 |
| 7/12/10 | 16.9 |
| 7/12/10 | 16.8 |
| 7/12/10 | 17 |
| 7/12/10 | 17.2 |
| 7/12/10 | 19.1 |
| 7/12/10 | 17.6 |
| 7/12/10 | 17.7 |
| 7/12/10 | 16.9 |
| 7/12/10 | 17.3 |
| 7/12/10 | 19 |
| 7/12/10 | 17.5 |
| 7/12/10 | 15.8 |
| 7/12/10 | 17.3 |
| 7/12/10 | 15.4 |
| 7/12/10 | 16.7 |
| 7/12/10 | 10.8 |
| 7/12/10 | 7.6 |
| 7/12/10 | 6.9 |
| 7/12/10 | 8.3 |
| 7/12/10 | 8.1 |
| 7/13/10 | 7.7 |
| 7/13/10 | 9.6 |
| 7/13/10 | 10.1 |
| 7/13/10 | 9.5 |
| 7/13/10 | 9.9 |
| 7/13/10 | 10.7 |
| 7/13/10 | 9.7 |
| 7/13/10 | 9.9 |
| 7/13/10 | 10.7 |
| 7/13/10 | 10.2 |
| 7/13/10 | 10.4 |
| 7/13/10 | 10.5 |
| 7/13/10 | 10.9 |
| 7/13/10 | 12.2 |
| 7/13/10 | 12.4 |
| 7/13/10 | 14.5 |
| 7/13/10 | 17.5 |
| 7/13/10 | 12.6 |
| 7/13/10 | 25.5 |
| 7/13/10 | 14.9 |
| 7/13/10 | 14.7 |
| 7/13/10 | 16.4 |
| 7/13/10 | 17.1 |
| 7/13/10 | 19.9 |
| 7/13/10 | 15.2 |
| 7/13/10 | 15.1 |
| 7/13/10 | 16.5 |
| 7/13/10 | 15.5 |
| 7/13/10 | 17.2 |
| 7/13/10 | 14.2 |
| 7/13/10 | 15 |
| 7/13/10 | 14.3 |
| 7/13/10 | 15.4 |
| 7/13/10 | 15.2 |
| 7/13/10 | 16.2 |
| 7/13/10 | 18 |
| 7/13/10 | 17.1 |
| 7/13/10 | 14.9 |
| 7/13/10 | 16.4 |
| 7/13/10 | 79.6 |
| 7/13/10 | 10.2 |
| 7/13/10 | 11.5 |
| 7/13/10 | 11.7 |
| 7/13/10 | 12.3 |
| 7/13/10 | 12.7 |
| 7/13/10 | 12.2 |
| 7/13/10 | 14.3 |
| 7/13/10 | 14.1 |
| 7/14/10 | 8.9 |
| 7/14/10 | 28 |
| 7/14/10 | 21.9 |
| 7/14/10 | 25.9 |
| 7/14/10 | 27.3 |
| 7/14/10 | 23.3 |
| 7/14/10 | 35.5 |
| 7/14/10 | 34.9 |
| 7/14/10 | 12.4 |
| 7/14/10 | 12.6 |
| 7/14/10 | 13.8 |
| 7/14/10 | 13.4 |
| 7/14/10 | 13.3 |
| 7/14/10 | 14 |
| 7/14/10 | 16.2 |
| 7/14/10 | 18.3 |
| 7/14/10 | 17.9 |
| 7/14/10 | 19.3 |
| 7/14/10 | 21.1 |
| 7/14/10 | 21.6 |
| 7/14/10 | 20.5 |
| 7/14/10 | 20.6 |
| 7/14/10 | 19.4 |
| 7/14/10 | 20 |
| 7/14/10 | 23.4 |
| 7/14/10 | 27 |
| 7/14/10 | 23.6 |
| 7/14/10 | 25.5 |
| 7/14/10 | 23.3 |
| 7/14/10 | 26.6 |
| 7/14/10 | 26.3 |
| 7/14/10 | 26.8 |
| 7/14/10 | 25.5 |
| 7/14/10 | 24.8 |
| 7/14/10 | 25.4 |
| 7/14/10 | 26.6 |
| 7/14/10 | 26.9 |
| 7/14/10 | 26.7 |
| 7/14/10 | 24.3 |
| 7/14/10 | 22.5 |
| 7/14/10 | 23 |
| 7/14/10 | 23.7 |
| 7/14/10 | 22.8 |
| 7/14/10 | 24.7 |
| 7/14/10 | 25.3 |
| 7/14/10 | 22.6 |
| 7/14/10 | 24.6 |
| 7/14/10 | 13 |
| 7/15/10 | 23.6 |
| 7/15/10 | 14.3 |
| 7/15/10 | 10.1 |
| 7/15/10 | 15.2 |
| 7/15/10 | 15.5 |
| 7/15/10 | 15.4 |
| 7/15/10 | 17.3 |
| 7/15/10 | 18.4 |
| 7/15/10 | 18.7 |
| 7/15/10 | 18.8 |
| 7/15/10 | 19.3 |
| 7/15/10 | 20.2 |
| 7/15/10 | 19.9 |
| 7/15/10 | 20.5 |
| 7/15/10 | 21.1 |
| 7/15/10 | 20.6 |
| 7/15/10 | 20.1 |
| 7/15/10 | 20.4 |
| 7/15/10 | 20.1 |
| 7/15/10 | 20.4 |
| 7/15/10 | 19.9 |
| 7/15/10 | 21 |
| 7/15/10 | 20.2 |
| 7/15/10 | 21.2 |
| 7/15/10 | 21.5 |
| 7/15/10 | 21.7 |
| 7/15/10 | 23.9 |
| 7/15/10 | 24.7 |
| 7/15/10 | 24.8 |
| 7/15/10 | 23.3 |
| 7/15/10 | 24.2 |
| 7/15/10 | 22.1 |
| 7/15/10 | 23.6 |
| 7/15/10 | 24.7 |
| 7/15/10 | 24.5 |
| 7/15/10 | 25.7 |
| 7/15/10 | 26.1 |
| 7/15/10 | 25.7 |
| 7/15/10 | 26 |
| 7/15/10 | 27.5 |
| 7/15/10 | 27.2 |
| 7/15/10 | 29 |
| 7/15/10 | 34.9 |
| 7/15/10 | 31.1 |
| 7/15/10 | 29.4 |
| 7/15/10 | 29.2 |
| 7/15/10 | 28.7 |
| 7/15/10 | 26.9 |
| 7/16/10 | 35.5 |
| 7/16/10 | 32.8 |
| 7/16/10 | 28.7 |
| 7/16/10 | 34.5 |
| 7/16/10 | 28.5 |
| 7/16/10 | 44.2 |
| 7/16/10 | 31.5 |
| 7/16/10 | 30.8 |
| 7/16/10 | 38.4 |
| 7/16/10 | 29.8 |
| 7/16/10 | 36.3 |
| 7/16/10 | 47.5 |
| 7/16/10 | 35.2 |
| 7/16/10 | 26.3 |
| 7/16/10 | 37.8 |
| 7/16/10 | 34.2 |
| 7/16/10 | 28.2 |
| 7/16/10 | 20.5 |
| 7/16/10 | 23.4 |
| 7/16/10 | 16.6 |
| 7/16/10 | 20.1 |
| 7/16/10 | 22.7 |
| 7/16/10 | 20.1 |
| 7/16/10 | 18 |
| 7/16/10 | 20.2 |
| 7/16/10 | 17.5 |
| 7/16/10 | 16.1 |
| 7/16/10 | 14 |
| 7/16/10 | 13.3 |
| 7/16/10 | 21.3 |
| 7/16/10 | 15.2 |
| 7/16/10 | 17.5 |
| 7/16/10 | 20.1 |
| 7/16/10 | 16.2 |
| 7/16/10 | 15 |
| 7/16/10 | 14.5 |
| 7/16/10 | 22 |
| 7/16/10 | 21.1 |
| 7/16/10 | 20.5 |
| 7/16/10 | 20.7 |
| 7/16/10 | 19.5 |
| 7/16/10 | 14.8 |
| 7/16/10 | 18 |
| 7/16/10 | 22.7 |
| 7/16/10 | 18.7 |
| 7/16/10 | 20.7 |
| 7/16/10 | 17 |
| 7/16/10 | 16.8 |
| 7/17/10 | 15.2 |
| 7/17/10 | 19.4 |
| 7/17/10 | 28.2 |
| 7/17/10 | 26.2 |
| 7/17/10 | 20.8 |
| 7/17/10 | 19.3 |
| 7/17/10 | 18.1 |
| 7/17/10 | 24.5 |
| 7/17/10 | 24.7 |
| 7/17/10 | 22.1 |
| 7/17/10 | 11 |
| 7/17/10 | 11 |
| 7/17/10 | 12.9 |
| 7/17/10 | 13.1 |
| 7/17/10 | 14.2 |
| 7/17/10 | 14.6 |
| 7/17/10 | 15.1 |
| 7/17/10 | 13.1 |
| 7/17/10 | 14.6 |
| 7/17/10 | 15.8 |
| 7/17/10 | 13.6 |
| 7/17/10 | 15.3 |
| 7/17/10 | 13.5 |
| 7/17/10 | 12.8 |
| 7/17/10 | 23.8 |
| 7/17/10 | 18.7 |
| 7/17/10 | 18.6 |
| 7/17/10 | 15 |
| 7/17/10 | 15.9 |
| 7/17/10 | 17 |
| 7/17/10 | 16.3 |
| 7/17/10 | 21.6 |
| 7/17/10 | 17.7 |
| 7/17/10 | 14.6 |
| 7/17/10 | 16.3 |
| 7/17/10 | 17 |
| 7/17/10 | 16.2 |
| 7/17/10 | 16.6 |
| 7/17/10 | 19.8 |
| 7/17/10 | 17.2 |
| 7/17/10 | 14.1 |
| 7/17/10 | 22.3 |
| 7/17/10 | 17.7 |
| 7/17/10 | 12 |
| 7/17/10 | 15.7 |
| 7/17/10 | 14.4 |
| 7/17/10 | 11.1 |
| 7/17/10 | 16.9 |
| 7/18/10 | 15.3 |
| 7/18/10 | 15 |
| 7/18/10 | 14.2 |
| 7/18/10 | 11.9 |
| 7/18/10 | 11.4 |
| 7/18/10 | 14.5 |
| 7/18/10 | 14.3 |
| 7/18/10 | 12.1 |
| 7/18/10 | 11.9 |
| 7/18/10 | 17 |
| 7/18/10 | 10.2 |
| 7/18/10 | 14.6 |
| 7/18/10 | 12.9 |
| 7/18/10 | 16 |
| 7/18/10 | 13.9 |
| 7/18/10 | 17.1 |
| 7/18/10 | 16.9 |
| 7/18/10 | 12.8 |
| 7/18/10 | 14.1 |
| 7/18/10 | 16.2 |
| 7/18/10 | 22.1 |
| 7/18/10 | 13.9 |
| 7/18/10 | 18.3 |
| 7/18/10 | 14.8 |
| 7/18/10 | 15.8 |
| 7/18/10 | 16.8 |
| 7/18/10 | 15.8 |
| 7/18/10 | 19.5 |
| 7/18/10 | 17.9 |
| 7/18/10 | 17.2 |
| 7/18/10 | 19.3 |
| 7/18/10 | 15.8 |
| 7/18/10 | 16.6 |
| 7/18/10 | 18.2 |
| 7/18/10 | 17.5 |
| 7/18/10 | 16.4 |
| 7/18/10 | 15.7 |
| 7/18/10 | 17.7 |
| 7/18/10 | 16.3 |
| 7/18/10 | 16.2 |
| 7/18/10 | 16 |
| 7/18/10 | 16.6 |
| 7/18/10 | 15.9 |
| 7/18/10 | 18.6 |
| 7/18/10 | 17.7 |
| 7/18/10 | 14.9 |
| 7/18/10 | 16.7 |
| 7/18/10 | 14.3 |
| 7/19/10 | 14.5 |
| 7/19/10 | 20.1 |
| 7/19/10 | 14.9 |
| 7/19/10 | 18.5 |
| 7/19/10 | 16.9 |
| 7/19/10 | 15.2 |
| 7/19/10 | 16.7 |
| 7/19/10 | 24.6 |
| 7/19/10 | 14.8 |
| 7/19/10 | 14.6 |
| 7/19/10 | 14.8 |
| 7/19/10 | 17.2 |
| 7/19/10 | 20.9 |
| 7/19/10 | 16.9 |
| 7/19/10 | 16.8 |
| 7/19/10 | 17 |
| 7/19/10 | 15.5 |
| 7/19/10 | 15.2 |
| 7/19/10 | 12.3 |
| 7/19/10 | 12.1 |
| 7/19/10 | 12.1 |
| 7/19/10 | 12.7 |
| 7/19/10 | 13.1 |
| 7/19/10 | 12.4 |
| 7/19/10 | 13.4 |
| 7/19/10 | 14 |
| 7/19/10 | 13.6 |
| 7/19/10 | 12.7 |
| 7/19/10 | 12.6 |
| 7/19/10 | 13.2 |
| 7/19/10 | 14.1 |
| 7/19/10 | 14.5 |
| 7/19/10 | 16.3 |
| 7/19/10 | 14.5 |
| 7/19/10 | 15.9 |
| 7/19/10 | 21.9 |
| 7/19/10 | 18.9 |
| 7/19/10 | 13.8 |
| 7/19/10 | 16 |
| 7/19/10 | 14.1 |
| 7/19/10 | 14.2 |
| 7/19/10 | 13.1 |
| 7/19/10 | 13.5 |
| 7/19/10 | 14.2 |
| 7/19/10 | 14.7 |
| 7/19/10 | 15.4 |
| 7/19/10 | 13.2 |
| 7/19/10 | 15.3 |
| 7/20/10 | 15.9 |
| 7/20/10 | 16.8 |
| 7/20/10 | 15.3 |
| 7/20/10 | 14.4 |
| 7/20/10 | 14.4 |
| 7/20/10 | 14.7 |
| 7/20/10 | 15.5 |
| 7/20/10 | 16.8 |
| 7/20/10 | 15.9 |
| 7/20/10 | 18.5 |
| 7/20/10 | 20.3 |
| 7/20/10 | 19 |
| 7/20/10 | 16.1 |
| 7/20/10 | 16.4 |
| 7/20/10 | 17.2 |
| 7/20/10 | 18 |
| 7/20/10 | 19.5 |
| 7/20/10 | 20 |
| 7/20/10 | 20.1 |
| 7/20/10 | 21.1 |
| 7/20/10 | 23.7 |
| 7/20/10 | 22.7 |
| 7/20/10 | 22.3 |
| 7/20/10 | 24 |
| 7/20/10 | 20.3 |
| 7/20/10 | 19.2 |
| 7/20/10 | 19.2 |
| 7/20/10 | 19.3 |
| 7/20/10 | 20 |
| 7/20/10 | 20.6 |
| 7/20/10 | 21.5 |
| 7/20/10 | 24.4 |
| 7/20/10 | 23 |
| 7/20/10 | 21.7 |
| 7/20/10 | 24.5 |
| 7/20/10 | 24.1 |
| 7/20/10 | 25.3 |
| 7/20/10 | 24.2 |
| 7/20/10 | 23.8 |
| 7/20/10 | 22.5 |
| 7/20/10 | 24.5 |
| 7/20/10 | 23.5 |
| 7/20/10 | 24.6 |
| 7/20/10 | 25.1 |
| 7/20/10 | 24.3 |
| 7/20/10 | 24.5 |
| 7/20/10 | 24.8 |
| 7/20/10 | 23.8 |
| 7/21/10 | 23.3 |
| 7/21/10 | 26.7 |
| 7/21/10 | 25.8 |
| 7/21/10 | 16.9 |
| 7/21/10 | 17.1 |
| 7/21/10 | 16.4 |
| 7/21/10 | 19.4 |
| 7/21/10 | 19.5 |
| 7/21/10 | 15.5 |
| 7/21/10 | 19.6 |
| 7/21/10 | 17.3 |
| 7/21/10 | 19.4 |
| 7/21/10 | 20.9 |
| 7/21/10 | 22.9 |
| 7/21/10 | 22.3 |
| 7/21/10 | 17.2 |
| 7/21/10 | 16.8 |
| 7/21/10 | 17.8 |
| 7/21/10 | 18.5 |
| 7/21/10 | 18.9 |
| 7/21/10 | 19.1 |
| 7/21/10 | 18.4 |
| 7/21/10 | 21.3 |
| 7/21/10 | 21.6 |
| 7/21/10 | 18.7 |
| 7/21/10 | 17.5 |
| 7/21/10 | 18.3 |
| 7/21/10 | 17.4 |
| 7/21/10 | 16.5 |
| 7/21/10 | 17 |
| 7/21/10 | 17.2 |
| 7/21/10 | 21.8 |
| 7/21/10 | 24.8 |
| 7/21/10 | 26 |
| 7/21/10 | 24.2 |
| 7/21/10 | 24.9 |
| 7/21/10 | 25.1 |
| 7/21/10 | 25.5 |
| 7/21/10 | 23.4 |
| 7/21/10 | 22.3 |
| 7/21/10 | 23.9 |
| 7/21/10 | 25.5 |
| 7/21/10 | 32.4 |
| 7/21/10 | 35.6 |
| 7/21/10 | 32 |
| 7/21/10 | 41.3 |
| 7/21/10 | 24.6 |
| 7/21/10 | 26.4 |
| 7/22/10 | 27.9 |
| 7/22/10 | 21.9 |
| 7/22/10 | 30.2 |
| 7/22/10 | 32 |
| 7/22/10 | 17.7 |
| 7/22/10 | 11.3 |
| 7/22/10 | 14.4 |
| 7/22/10 | 12.9 |
| 7/22/10 | 12.7 |
| 7/22/10 | 11.6 |
| 7/22/10 | 13.3 |
| 7/22/10 | 13.1 |
| 7/22/10 | 15 |
| 7/22/10 | 14.8 |
| 7/22/10 | 15.9 |
| 7/22/10 | 15.6 |
| 7/22/10 | 14.9 |
| 7/22/10 | 15 |
| 7/22/10 | 14.9 |
| 7/22/10 | 16.8 |
| 7/22/10 | 16.2 |
| 7/22/10 | 17.5 |
| 7/22/10 | 19.7 |
| 7/22/10 | 17.7 |
| 7/22/10 | 16.7 |
| 7/22/10 | 19.6 |
| 7/22/10 | 22.2 |
| 7/22/10 | 22.8 |
| 7/22/10 | 19.5 |
| 7/22/10 | 15.7 |
| 7/22/10 | 17.7 |
| 7/22/10 | 20.2 |
| 7/22/10 | 22.7 |
| 7/22/10 | 26.5 |
| 7/22/10 | 28.3 |
| 7/22/10 | 27.2 |
| 7/22/10 | 26.8 |
| 7/22/10 | 26.2 |
| 7/22/10 | 29.5 |
| 7/22/10 | 29.1 |
| 7/22/10 | 32.4 |
| 7/22/10 | 33.2 |
| 7/22/10 | 24.4 |
| 7/22/10 | 25.3 |
| 7/22/10 | 19 |
| 7/22/10 | 18.5 |
| 7/22/10 | 17.5 |
| 7/22/10 | 19 |
| 7/23/10 | 17.3 |
| 7/23/10 | 12.4 |
| 7/23/10 | 18.6 |
| 7/23/10 | 17.9 |
| 7/23/10 | 17.4 |
| 7/23/10 | 17.7 |
| 7/23/10 | 17.4 |
| 7/23/10 | 15.5 |
| 7/23/10 | 14.5 |
| 7/23/10 | 17.4 |
| 7/23/10 | 17.9 |
| 7/23/10 | 15.2 |
| 7/23/10 | 16.4 |
| 7/23/10 | 16.3 |
| 7/23/10 | 12.6 |
| 7/23/10 | 16 |
| 7/23/10 | 17.7 |
| 7/23/10 | 12.1 |
| 7/23/10 | 18.1 |
| 7/23/10 | 14 |
| 7/23/10 | 19.7 |
| 7/23/10 | 21.5 |
| 7/23/10 | 21.5 |
| 7/23/10 | 14.4 |
| 7/23/10 | 15.4 |
| 7/23/10 | 17.2 |
| 7/23/10 | 22.3 |
| 7/23/10 | 24.5 |
| 7/23/10 | 21.6 |
| 7/23/10 | 24 |
| 7/23/10 | 27.1 |
| 7/23/10 | 27.7 |
| 7/23/10 | 25.7 |
| 7/23/10 | 27.7 |
| 7/23/10 | 29.8 |
| 7/23/10 | 18.4 |
| 7/23/10 | 31.9 |
| 7/23/10 | 31.9 |
| 7/23/10 | 27.1 |
| 7/23/10 | 24.9 |
| 7/23/10 | 33.2 |
| 7/23/10 | 25.5 |
| 7/23/10 | 29.1 |
| 7/23/10 | 31 |
| 7/23/10 | 32.9 |
| 7/23/10 | 23.1 |
| 7/23/10 | 29.2 |
| 7/23/10 | 27.6 |
| 7/24/10 | 21.9 |
| 7/24/10 | 36.5 |
| 7/24/10 | 36.7 |
| 7/24/10 | 37.8 |
| 7/24/10 | 38 |
| 7/24/10 | 35.5 |
| 7/24/10 | 27.7 |
| 7/24/10 | 29.9 |
| 7/24/10 | 34.7 |
| 7/24/10 | 39.2 |
| 7/24/10 | 31.2 |
| 7/24/10 | 38.4 |
| 7/24/10 | 30.2 |
| 7/24/10 | 26 |
| 7/24/10 | 30.5 |
| 7/24/10 | 30.3 |
| 7/24/10 | 19.3 |
| 7/24/10 | 36.5 |
| 7/24/10 | 31.7 |
| 7/24/10 | 26.1 |
| 7/24/10 | 24.5 |
| 7/24/10 | 39.3 |
| 7/24/10 | 33.3 |
| 7/24/10 | 28.1 |
| 7/24/10 | 33.9 |
| 7/24/10 | 26.2 |
| 7/24/10 | 30.7 |
| 7/24/10 | 35.2 |
| 7/24/10 | 42.3 |
| 7/24/10 | 33.7 |
| 7/24/10 | 54.8 |
| 7/24/10 | 41.1 |
| 7/24/10 | 40.6 |
| 7/24/10 | 43 |
| 7/24/10 | 59.5 |
| 7/24/10 | 48.3 |
| 7/24/10 | 54.2 |
| 7/24/10 | 55.6 |
| 7/24/10 | 38.4 |
| 7/24/10 | 36.3 |
| 7/24/10 | 36 |
| 7/24/10 | 33.9 |
| 7/24/10 | 69.4 |
| 7/24/10 | 48.6 |
| 7/24/10 | 42.8 |
| 7/24/10 | 58.7 |
| 7/24/10 | 34.8 |
| 7/24/10 | 31.8 |
| 7/25/10 | 67.2 |
| 7/25/10 | 58.4 |
| 7/25/10 | 30.7 |
| 7/25/10 | 67 |
| 7/25/10 | 68 |
| 7/25/10 | 69 |
| 7/25/10 | 34.5 |
| 7/25/10 | 36.5 |
| 7/25/10 | 58.8 |
| 7/25/10 | 30.7 |
| 7/25/10 | 19.6 |
| 7/25/10 | 49.6 |
| 7/25/10 | 38.2 |
| 7/25/10 | 39 |
| 7/25/10 | 41.7 |
| 7/25/10 | 42.8 |
| 7/25/10 | 43.7 |
| 7/25/10 | 39.1 |
| 7/25/10 | 31.2 |
| 7/25/10 | 38.9 |
| 7/25/10 | 28.3 |
| 7/25/10 | 54.6 |
| 7/25/10 | 39.9 |
| 7/25/10 | 28.4 |
| 7/25/10 | 33.5 |
| 7/25/10 | 38.8 |
| 7/25/10 | 67.9 |
| 7/25/10 | 33.3 |
| 7/25/10 | 37.9 |
| 7/25/10 | 40.9 |
| 7/25/10 | 31.5 |
| 7/25/10 | 60.3 |
| 7/25/10 | 73.4 |
| 7/25/10 | 31.8 |
| 7/25/10 | 32.9 |
| 7/25/10 | 66.3 |
| 7/25/10 | 80.4 |
| 7/25/10 | 62.7 |
| 7/25/10 | 36 |
| 7/25/10 | 63.4 |
| 7/25/10 | 68.8 |
| 7/25/10 | 84.2 |
| 7/25/10 | 67 |
| 7/25/10 | 86.2 |
| 7/25/10 | 67.5 |
| 7/25/10 | 87.4 |
| 7/25/10 | 62.2 |
| 7/25/10 | 55.9 |
| 7/26/10 | 62 |
| 7/26/10 | 7.8 |
| 7/26/10 | 8.1 |
| 7/26/10 | 9.1 |
| 7/26/10 | 9.1 |
| 7/26/10 | 10.1 |
| 7/26/10 | 10 |
| 7/26/10 | 17.7 |
| 7/26/10 | 29.6 |
| 7/26/10 | 27.6 |
| 7/26/10 | 28.8 |
| 7/26/10 | 51.2 |
| 7/26/10 | 33.6 |
| 7/26/10 | 36.2 |
| 7/26/10 | 42 |
| 7/26/10 | 45.3 |
| 7/26/10 | 65.1 |
| 7/26/10 | 80.3 |
| 7/26/10 | 77.8 |
| 7/26/10 | 62.1 |
| 7/26/10 | 66.3 |
| 7/26/10 | 55.5 |
| 7/26/10 | 47.4 |
| 7/26/10 | 46.8 |
| 7/26/10 | 60.7 |
| 7/26/10 | 51.5 |
| 7/26/10 | 67.9 |
| 7/26/10 | 94.6 |
| 7/26/10 | 48.1 |
| 7/26/10 | 88.5 |
| 7/26/10 | 134.5 |
| 7/26/10 | 67.1 |
| 7/26/10 | 52.7 |
| 7/26/10 | 94.5 |
| 7/26/10 | 70.1 |
| 7/26/10 | 129.5 |
| 7/26/10 | 35.5 |
| 7/26/10 | 109.4 |
| 7/26/10 | 136.5 |
| 7/26/10 | 133.2 |
| 7/26/10 | 148.7 |
| 7/26/10 | 42.9 |
| 7/26/10 | 66.6 |
| 7/26/10 | 126.8 |
| 7/26/10 | 55.4 |
| 7/26/10 | 145.5 |
| 7/26/10 | 95 |
| 7/26/10 | 67.2 |
| 7/27/10 | 45.9 |
| 7/27/10 | 56.4 |
| 7/27/10 | 31 |
| 7/27/10 | 63.4 |
| 7/27/10 | 87.6 |
| 7/27/10 | 34.6 |
| 7/27/10 | 47.7 |
| 7/27/10 | 34.5 |
| 7/27/10 | 78.4 |
| 7/27/10 | 61.4 |
| 7/27/10 | 50 |
| 7/27/10 | 65.2 |
| 7/27/10 | 55.4 |
| 7/27/10 | 76.1 |
| 7/27/10 | 35.9 |
| 7/27/10 | 53.8 |
| 7/27/10 | 68.3 |
| 7/27/10 | 81 |
| 7/27/10 | 78.5 |
| 7/27/10 | 66.2 |
| 7/27/10 | 60.6 |
| 7/27/10 | 56.4 |
| 7/27/10 | 50.7 |
| 7/27/10 | 104.2 |
| 7/27/10 | 120.1 |
| 7/27/10 | 112.4 |
| 7/27/10 | 43.4 |
| 7/27/10 | 38 |
| 7/27/10 | 104.5 |
| 7/27/10 | 85.7 |
| 7/27/10 | 45.5 |
| 7/27/10 | 92.4 |
| 7/27/10 | 68.3 |
| 7/27/10 | 95.9 |
| 7/27/10 | 52 |
| 7/27/10 | 51.9 |
| 7/27/10 | 101.9 |
| 7/27/10 | 89.2 |
| 7/27/10 | 64.3 |
| 7/27/10 | 30.8 |
| 7/27/10 | 77.4 |
| 7/27/10 | 79.5 |
| 7/27/10 | 53.8 |
| 7/27/10 | 55.3 |
| 7/27/10 | 98 |
| 7/27/10 | 79.4 |
| 7/27/10 | 103.9 |
| 7/27/10 | 72.2 |
| 7/28/10 | 129.9 |
| 7/28/10 | 98.8 |
| 7/28/10 | 56.9 |
| 7/28/10 | 69.8 |
| 7/28/10 | 77.1 |
| 7/28/10 | 62.7 |
| 7/28/10 | 48.8 |
| 7/28/10 | 87.2 |
| 7/28/10 | 32.6 |
| 7/28/10 | 33.1 |
| 7/28/10 | 67.6 |
| 7/28/10 | 42.1 |
| 7/28/10 | 64 |
| 7/28/10 | 44.5 |
| 7/28/10 | 26 |
| 7/28/10 | 83.8 |
| 7/28/10 | 55 |
| 7/28/10 | 49.7 |
| 7/28/10 | 109.8 |
| 7/28/10 | 27.8 |
| 7/28/10 | 113.2 |
| 7/28/10 | 53.7 |
| 7/28/10 | 76.2 |
| 7/28/10 | 109.1 |
| 7/28/10 | 44.3 |
| 7/28/10 | 60.7 |
| 7/28/10 | 81.7 |
| 7/28/10 | 68.5 |
| 7/28/10 | 158 |
| 7/28/10 | 114.7 |
| 7/28/10 | 61.9 |
| 7/28/10 | 134 |
| 7/28/10 | 104.3 |
| 7/28/10 | 147.2 |
| 7/28/10 | 176.4 |
| 7/28/10 | 152.8 |
| 7/28/10 | 90.4 |
| 7/28/10 | 214.7 |
| 7/28/10 | 177.9 |
| 7/28/10 | 135.8 |
| 7/28/10 | 189.8 |
| 7/28/10 | 131.4 |
| 7/28/10 | 80.8 |
| 7/28/10 | 85.8 |
| 7/28/10 | 95.9 |
| 7/28/10 | 64 |
| 7/28/10 | 129.3 |
| 7/28/10 | 140.6 |
| 7/29/10 | 150.6 |
| 7/29/10 | 231.6 |
| 7/29/10 | 90.4 |
| 7/29/10 | 98 |
| 7/29/10 | 177.8 |
| 7/29/10 | 118.5 |
| 7/29/10 | 220.1 |
| 7/29/10 | 93.3 |
| 7/29/10 | 188.2 |
| 7/29/10 | 149.4 |
| 7/29/10 | 89 |
| 7/29/10 | 132.9 |
| 7/29/10 | 95.2 |
| 7/29/10 | 72.9 |
| 7/29/10 | 53.8 |
| 7/29/10 | 91.8 |
| 7/29/10 | 73.9 |
| 7/29/10 | 64.8 |
| 7/29/10 | 125.1 |
| 7/29/10 | 93.3 |
| 7/29/10 | 109.2 |
| 7/29/10 | 40.7 |
| 7/29/10 | 88.8 |
| 7/29/10 | 73.5 |
| 7/29/10 | 65.7 |
| 7/29/10 | 155.4 |
| 7/29/10 | 103.8 |
| 7/29/10 | 123.1 |
| 7/29/10 | 141.4 |
| 7/29/10 | 56.8 |
| 7/29/10 | 38 |
| 7/29/10 | 64.6 |
| 7/29/10 | 53.1 |
| 7/29/10 | 56.7 |
| 7/29/10 | 73.2 |
| 7/29/10 | 45.8 |
| 7/29/10 | 67.8 |
| 7/29/10 | 81.6 |
| 7/29/10 | 80.1 |
| 7/29/10 | 88.3 |
| 7/29/10 | 58.6 |
| 7/29/10 | 59 |
| 7/29/10 | 101.9 |
| 7/29/10 | 72.8 |
| 7/29/10 | 52.7 |
| 7/29/10 | 128.1 |
| 7/29/10 | 133.1 |
| 7/29/10 | 53.9 |
| 7/30/10 | 94.3 |
| 7/30/10 | 66.5 |
| 7/30/10 | 147.1 |
| 7/30/10 | 81.6 |
| 7/30/10 | 56.3 |
| 7/30/10 | 98.7 |
| 7/30/10 | 65.8 |
| 7/30/10 | 77.6 |
| 7/30/10 | 63.7 |
| 7/30/10 | 60.9 |
| 7/30/10 | 132 |
| 7/30/10 | 74.5 |
| 7/30/10 | 63.8 |
| 7/30/10 | 156.4 |
| 7/30/10 | 79.7 |
| 7/30/10 | 82.4 |
| 7/30/10 | 144.3 |
| 7/30/10 | 107.8 |
| 7/30/10 | 78.1 |
| 7/30/10 | 138.5 |
| 7/30/10 | 137.7 |
| 7/30/10 | 183.1 |
| 7/30/10 | 117.2 |
| 7/30/10 | 110.9 |
| 7/30/10 | 95.1 |
| 7/30/10 | 139.6 |
| 7/30/10 | 184.4 |
| 7/30/10 | 93.4 |
| 7/30/10 | 133.2 |
| 7/30/10 | 86.8 |
| 7/30/10 | 111.7 |
| 7/30/10 | 165.6 |
| 7/30/10 | 95.6 |
| 7/30/10 | 57.4 |
| 7/30/10 | 86.8 |
| 7/30/10 | 115.3 |
| 7/30/10 | 110.2 |
| 7/30/10 | 90.4 |
| 7/30/10 | 72.7 |
| 7/30/10 | 53.8 |
| 7/30/10 | 77.5 |
| 7/30/10 | 96.8 |
| 7/30/10 | 138 |
| 7/30/10 | 121.9 |
| 7/30/10 | 97.6 |
| 7/30/10 | 64.6 |
| 7/30/10 | 55.3 |
| 7/30/10 | 70.3 |
| 7/31/10 | 42.9 |
| 7/31/10 | 60.6 |
| 7/31/10 | 58.9 |
| 7/31/10 | 56.8 |
| 7/31/10 | 39.3 |
| 7/31/10 | 91.5 |
| 7/31/10 | 38.1 |
| 7/31/10 | 88.7 |
| 7/31/10 | 60.7 |
| 7/31/10 | 81.6 |
| 7/31/10 | 104.2 |
| 7/31/10 | 67.4 |
| 7/31/10 | 90.6 |
| 7/31/10 | 87.3 |
| 7/31/10 | 84.9 |
| 7/31/10 | 79 |
| 7/31/10 | 109.7 |
| 7/31/10 | 77.6 |
| 7/31/10 | 72.4 |
| 7/31/10 | 116.5 |
| 7/31/10 | 105.6 |
| 7/31/10 | 156.6 |
| 7/31/10 | 104 |
| 7/31/10 | 97.5 |
| 7/31/10 | 92.3 |
| 7/31/10 | 109.8 |
| 7/31/10 | 155 |
| 7/31/10 | 143.6 |
| 7/31/10 | 193.9 |
| 7/31/10 | 116.3 |
| 7/31/10 | 99.8 |
| 7/31/10 | 180.7 |
| 7/31/10 | 217.1 |
| 7/31/10 | 79 |
| 7/31/10 | 85.8 |
| 7/31/10 | 28.3 |
| 7/31/10 | 30.4 |
| 7/31/10 | 33.3 |
| 7/31/10 | 29.2 |
| 7/31/10 | 36.1 |
| 7/31/10 | 47.3 |
| 7/31/10 | 53.8 |
| 7/31/10 | 38 |
| 7/31/10 | 62.6 |
| 7/31/10 | 47.3 |
| 7/31/10 | 61.1 |
| 7/31/10 | 148.1 |
| 7/31/10 | 44.4 |
| 8/1/10 | 36 |
| 8/1/10 | 47.1 |
| 8/1/10 | 40.3 |
| 8/1/10 | 34.5 |
| 8/1/10 | 37.9 |
| 8/1/10 | 69 |
| 8/1/10 | 81.5 |
| 8/1/10 | 69.8 |
| 8/1/10 | 62.5 |
| 8/1/10 | 47.4 |
| 8/1/10 | 48.5 |
| 8/1/10 | 54 |
| 8/1/10 | 94.6 |
| 8/1/10 | 52.4 |
| 8/1/10 | 49.6 |
| 8/1/10 | 74.8 |
| 8/1/10 | 72.4 |
| 8/1/10 | 50.7 |
| 8/1/10 | 89.6 |
| 8/1/10 | 63.6 |
| 8/1/10 | 60 |
| 8/1/10 | 41.8 |
| 8/1/10 | 35.4 |
| 8/1/10 | 60.5 |
| 8/1/10 | 119.1 |
| 8/1/10 | 76.8 |
| 8/1/10 | 132.5 |
| 8/1/10 | 118.3 |
| 8/1/10 | 113.1 |
| 8/1/10 | 105.2 |
| 8/1/10 | 78.4 |
| 8/1/10 | 113.3 |
| 8/1/10 | 73.8 |
| 8/1/10 | 107.1 |
| 8/1/10 | 139.7 |
| 8/1/10 | 56.2 |
| 8/1/10 | 155.5 |
| 8/1/10 | 217.5 |
| 8/1/10 | 114.7 |
| 8/1/10 | 121.1 |
| 8/1/10 | 91.1 |
| 8/1/10 | 209 |
| 8/1/10 | 154.6 |
| 8/1/10 | 216.4 |
| 8/1/10 | 173.3 |
| 8/1/10 | 52.3 |
| 8/1/10 | 70.2 |
| 8/1/10 | 101 |
| 8/2/10 | 84.5 |
| 8/2/10 | 27.7 |
| 8/2/10 | 25.3 |
| 8/2/10 | 24.3 |
| 8/2/10 | 25.7 |
| 8/2/10 | 27.1 |
| 8/2/10 | 24.1 |
| 8/2/10 | 15.1 |
| 8/2/10 | 17.6 |
| 8/2/10 | 18.2 |
| 8/2/10 | 23.2 |
| 8/2/10 | 34.4 |
| 8/2/10 | 37.5 |
| 8/2/10 | 35.2 |
| 8/2/10 | 30.1 |
| 8/2/10 | 35.5 |
| 8/2/10 | 92.6 |
| 8/2/10 | 82.1 |
| 8/2/10 | 34.1 |
| 8/2/10 | 34 |
| 8/2/10 | 95.2 |
| 8/2/10 | 52.5 |
| 8/2/10 | 78.2 |
| 8/2/10 | 77.8 |
| 8/2/10 | 46 |
| 8/2/10 | 119.5 |
| 8/2/10 | 47.1 |
| 8/2/10 | 67.9 |
| 8/2/10 | 59.7 |
| 8/2/10 | 91.2 |
| 8/2/10 | 52.4 |
| 8/2/10 | 83.1 |
| 8/2/10 | 71.3 |
| 8/2/10 | 163.3 |
| 8/2/10 | 92.4 |
| 8/2/10 | 266.4 |
| 8/2/10 | 42.5 |
| 8/2/10 | 105.6 |
| 8/2/10 | 134.9 |
| 8/2/10 | 116.5 |
| 8/2/10 | 118.9 |
| 8/2/10 | 55.1 |
| 8/2/10 | 161.9 |
| 8/2/10 | 89.1 |
| 8/2/10 | 78 |
| 8/2/10 | 67.1 |
| 8/2/10 | 116.3 |
| 8/2/10 | 184.4 |
| 8/3/10 | 66.5 |
| 8/3/10 | 103.6 |
| 8/3/10 | 103.2 |
| 8/3/10 | 97.5 |
| 8/3/10 | 85.7 |
| 8/3/10 | 88.6 |
| 8/3/10 | 76.2 |
| 8/3/10 | 67 |
| 8/3/10 | 56.6 |
| 8/3/10 | 106.9 |
| 8/3/10 | 113.8 |
| 8/3/10 | 98.7 |
| 8/3/10 | 91.7 |
| 8/3/10 | 70.3 |
| 8/3/10 | 30.1 |
| 8/3/10 | 64.6 |
| 8/3/10 | 41.7 |
| 8/3/10 | 45.9 |
| 8/3/10 | 50.5 |
| 8/3/10 | 60.5 |
| 8/3/10 | 40.6 |
| 8/3/10 | 72.2 |
| 8/3/10 | 75.7 |
| 8/3/10 | 52.8 |
| 8/3/10 | 92.7 |
| 8/3/10 | 60.5 |
| 8/3/10 | 106.1 |
| 8/3/10 | 42.3 |
| 8/3/10 | 52.6 |
| 8/3/10 | 40.2 |
| 8/3/10 | 53 |
| 8/3/10 | 117.1 |
| 8/3/10 | 54.1 |
| 8/3/10 | 46.6 |
| 8/3/10 | 46 |
| 8/3/10 | 90.9 |
| 8/3/10 | 52.4 |
| 8/3/10 | 50.8 |
| 8/3/10 | 54.8 |
| 8/3/10 | 59.5 |
| 8/3/10 | 82 |
| 8/3/10 | 122.2 |
| 8/3/10 | 98.9 |
| 8/3/10 | 97.1 |
| 8/3/10 | 84.3 |
| 8/3/10 | 47.5 |
| 8/3/10 | 45.4 |
| 8/3/10 | 13.9 |
| 8/4/10 | 14.3 |
| 8/4/10 | 15.5 |
| 8/4/10 | 13.9 |
| 8/4/10 | 177.8 |
| 8/4/10 | 14.4 |
| 8/4/10 | 66.2 |
| 8/4/10 | 71.4 |
| 8/4/10 | 76.7 |
| 8/4/10 | 35 |
| 8/4/10 | 88 |
| 8/4/10 | 87.1 |
| 8/4/10 | 117.4 |
| 8/4/10 | 51.7 |
| 8/4/10 | 26.2 |
| 8/4/10 | 61.9 |
| 8/4/10 | 46.4 |
| 8/4/10 | 36.8 |
| 8/4/10 | 49 |
| 8/4/10 | 87.8 |
| 8/4/10 | 36.9 |
| 8/4/10 | 36.4 |
| 8/4/10 | 36.6 |
| 8/4/10 | 45.3 |
| 8/4/10 | 71.9 |
| 8/4/10 | 53 |
| 8/4/10 | 107.1 |
| 8/4/10 | 30.4 |
| 8/4/10 | 86.9 |
| 8/4/10 | 101.4 |
| 8/4/10 | 59.6 |
| 8/4/10 | 68.3 |
| 8/4/10 | 66.6 |
| 8/4/10 | 65.1 |
| 8/4/10 | 118.8 |
| 8/4/10 | 99.2 |
| 8/4/10 | 138.2 |
| 8/4/10 | 47.8 |
| 8/4/10 | 59.1 |
| 8/4/10 | 51.8 |
| 8/4/10 | 71.2 |
| 8/4/10 | 86.1 |
| 8/4/10 | 69.4 |
| 8/4/10 | 38.9 |
| 8/4/10 | 51.1 |
| 8/4/10 | 63 |
| 8/4/10 | 124.8 |
| 8/4/10 | 156.6 |
| 8/4/10 | 58.8 |
| 8/5/10 | 70.7 |
| 8/5/10 | 105.8 |
| 8/5/10 | 65.9 |
| 8/5/10 | 84.6 |
| 8/5/10 | 54.7 |
| 8/5/10 | 43.2 |
| 8/5/10 | 77.1 |
| 8/5/10 | 84.5 |
| 8/5/10 | 34.2 |
| 8/5/10 | 60.6 |
| 8/5/10 | 47.4 |
| 8/5/10 | 45.8 |
| 8/5/10 | 24 |
| 8/5/10 | 24.9 |
| 8/5/10 | 64.4 |
| 8/5/10 | 64.5 |
| 8/5/10 | 43.9 |
| 8/5/10 | 37.6 |
| 8/5/10 | 78.7 |
| 8/5/10 | 31.6 |
| 8/5/10 | 51 |
| 8/5/10 | 49.2 |
| 8/5/10 | 104.7 |
| 8/5/10 | 118.9 |
| 8/5/10 | 42 |
| 8/5/10 | 47.5 |
| 8/5/10 | 99.4 |
| 8/5/10 | 64.5 |
| 8/5/10 | 173 |
| 8/5/10 | 88.4 |
| 8/5/10 | 58.5 |
| 8/5/10 | 143.1 |
| 8/5/10 | 170.7 |
| 8/5/10 | 161.7 |
| 8/5/10 | 72.8 |
| 8/5/10 | 79.5 |
| 8/5/10 | 78.4 |
| 8/5/10 | 74.9 |
| 8/5/10 | 127 |
| 8/5/10 | 100.3 |
| 8/5/10 | 164.2 |
| 8/5/10 | 120.3 |
| 8/5/10 | 122.8 |
| 8/5/10 | 104.1 |
| 8/5/10 | 163.2 |
| 8/5/10 | 168.4 |
| 8/5/10 | 18.5 |
| 8/5/10 | 17.3 |
| 8/6/10 | 157.1 |
| 8/6/10 | 97.1 |
| 8/6/10 | 37.7 |
| 8/6/10 | 85.5 |
| 8/6/10 | 49.5 |
| 8/6/10 | 103.6 |
| 8/6/10 | 36.9 |
| 8/6/10 | 39.9 |
| 8/6/10 | 52.1 |
| 8/6/10 | 104.7 |
| 8/6/10 | 117.9 |
| 8/6/10 | 51.3 |
| 8/6/10 | 133.8 |
| 8/6/10 | 115.3 |
| 8/6/10 | 122 |
| 8/6/10 | 119.1 |
| 8/6/10 | 80.1 |
| 8/6/10 | 39.2 |
| 8/6/10 | 56.6 |
| 8/6/10 | 87.6 |
| 8/6/10 | 97 |
| 8/6/10 | 50.2 |
| 8/6/10 | 51.4 |
| 8/6/10 | 50.8 |
| 8/6/10 | 168.4 |
| 8/6/10 | 53.6 |
| 8/6/10 | 66.9 |
| 8/6/10 | 249 |
| 8/6/10 | 82.9 |
| 8/6/10 | 131.3 |
| 8/6/10 | 159.5 |
| 8/6/10 | 169.1 |
| 8/6/10 | 113.7 |
| 8/6/10 | 159.1 |
| 8/6/10 | 32.7 |
| 8/6/10 | 74.2 |
| 8/6/10 | 72.1 |
| 8/6/10 | 44.6 |
| 8/6/10 | 49.6 |
| 8/6/10 | 55.2 |
| 8/6/10 | 62.8 |
| 8/6/10 | 127.1 |
| 8/6/10 | 52 |
| 8/6/10 | 74.9 |
| 8/6/10 | 47 |
| 8/6/10 | 97 |
| 8/6/10 | 38.4 |
| 8/6/10 | 31.6 |
| 8/7/10 | 38.2 |
| 8/7/10 | 43.2 |
| 8/7/10 | 79.4 |
| 8/7/10 | 77.1 |
| 8/7/10 | 69.8 |
| 8/7/10 | 58.3 |
| 8/7/10 | 54.7 |
| 8/7/10 | 96 |
| 8/7/10 | 59.5 |
| 8/7/10 | 81.9 |
| 8/7/10 | 106.8 |
| 8/7/10 | 62.3 |
| 8/7/10 | 92.6 |
| 8/7/10 | 59.3 |
| 8/7/10 | 73.5 |
| 8/7/10 | 96.8 |
| 8/7/10 | 91 |
| 8/7/10 | 73.8 |
| 8/7/10 | 83.5 |
| 8/7/10 | 114 |
| 8/7/10 | 90.3 |
| 8/7/10 | 105 |
| 8/7/10 | 101.9 |
| 8/7/10 | 120.4 |
| 8/7/10 | 101.4 |
| 8/7/10 | 135.3 |
| 8/7/10 | 100 |
| 8/7/10 | 55.6 |
| 8/7/10 | 101.3 |
| 8/7/10 | 130.3 |
| 8/7/10 | 39.7 |
| 8/7/10 | 68.3 |
| 8/7/10 | 163.2 |
| 8/7/10 | 72.5 |
| 8/7/10 | 49.1 |
| 8/7/10 | 83.6 |
| 8/7/10 | 68.4 |
| 8/7/10 | 173.3 |
| 8/7/10 | 79.4 |
| 8/7/10 | 56.5 |
| 8/7/10 | 41.4 |
| 8/7/10 | 130.8 |
| 8/7/10 | 57.3 |
| 8/7/10 | 68.7 |
| 8/7/10 | 48.8 |
| 8/7/10 | 62.5 |
| 8/7/10 | 67.5 |
| 8/7/10 | 61.3 |
| 8/8/10 | 91.9 |
| 8/8/10 | 78.7 |
| 8/8/10 | 133.2 |
| 8/8/10 | 145.6 |
| 8/8/10 | 69.5 |
| 8/8/10 | 166.9 |
| 8/8/10 | 73.2 |
| 8/8/10 | 124.1 |
| 8/8/10 | 87.6 |
| 8/8/10 | 118 |
| 8/8/10 | 147.6 |
| 8/8/10 | 128 |
| 8/8/10 | 118.5 |
| 8/8/10 | 50.8 |
| 8/8/10 | 140.3 |
| 8/8/10 | 109.9 |
| 8/8/10 | 107.9 |
| 8/8/10 | 104.7 |
| 8/8/10 | 126.2 |
| 8/8/10 | 118.5 |
| 8/8/10 | 62.7 |
| 8/8/10 | 70.5 |
| 8/8/10 | 53.9 |
| 8/8/10 | 161 |
| 8/8/10 | 66.1 |
| 8/8/10 | 101.6 |
| 8/8/10 | 84.4 |
| 8/8/10 | 69.8 |
| 8/8/10 | 83.8 |
| 8/8/10 | 96.4 |
| 8/8/10 | 72.9 |
| 8/8/10 | 80.5 |
| 8/8/10 | 128.6 |
| 8/8/10 | 54.7 |
| 8/8/10 | 52.1 |
| 8/8/10 | 61.4 |
| 8/8/10 | 97.6 |
| 8/8/10 | 70.3 |
| 8/8/10 | 81.5 |
| 8/8/10 | 120.1 |
| 8/8/10 | 124 |
| 8/8/10 | 49.3 |
| 8/8/10 | 110.8 |
| 8/8/10 | 55 |
| 8/8/10 | 75.8 |
| 8/8/10 | 84.7 |
| 8/8/10 | 76.9 |
| 8/8/10 | 107.6 |
| 8/9/10 | 112.5 |
| 8/9/10 | 62.9 |
| 8/9/10 | 43.4 |
| 8/9/10 | 35.2 |
| 8/9/10 | 31.8 |
| 8/9/10 | 32.9 |
| 8/9/10 | 26.4 |
| 8/9/10 | 20.1 |
| 8/9/10 | 21.3 |
| 8/9/10 | 20.1 |
| 8/9/10 | 14.6 |
| 8/9/10 | 18.3 |
| 8/9/10 | 16.8 |
| 8/9/10 | 19.1 |
| 8/9/10 | 19.8 |
| 8/9/10 | 19.6 |
| 8/9/10 | 18.7 |
| 8/9/10 | 16.5 |
| 8/9/10 | 20.7 |
| 8/9/10 | 16.4 |
| 8/9/10 | 19.1 |
| 8/9/10 | 18.1 |
| 8/9/10 | 17.7 |
| 8/9/10 | 18.7 |
| 8/9/10 | 18.2 |
| 8/9/10 | 18.3 |
| 8/9/10 | 18.4 |
| 8/9/10 | 18.4 |
| 8/9/10 | 16.9 |
| 8/9/10 | 21.3 |
| 8/9/10 | 19.5 |
| 8/9/10 | 17.9 |
| 8/9/10 | 17.4 |
| 8/9/10 | 19.9 |
| 8/9/10 | 18.3 |
| 8/9/10 | 18.1 |
| 8/9/10 | 16.5 |
| 8/9/10 | 19.8 |
| 8/9/10 | 21.6 |
| 8/9/10 | 19.6 |
| 8/9/10 | 20 |
| 8/9/10 | 21.9 |
| 8/9/10 | 22.5 |
| 8/9/10 | 23.1 |
| 8/9/10 | 22.4 |
| 8/9/10 | 25.8 |
| 8/9/10 | 21.9 |
| 8/9/10 | 23.8 |
| 8/10/10 | 22.7 |
| 8/10/10 | 24.5 |
| 8/10/10 | 19.7 |
| 8/10/10 | 14.3 |
| 8/10/10 | 15 |
| 8/10/10 | 14.8 |
| 8/10/10 | 14.6 |
| 8/10/10 | 16.8 |
| 8/10/10 | 17.3 |
| 8/10/10 | 16 |
| 8/10/10 | 16.4 |
| 8/10/10 | 15.3 |
| 8/10/10 | 15 |
| 8/10/10 | 15 |
| 8/10/10 | 14.6 |
| 8/10/10 | 15.7 |
| 8/10/10 | 15.7 |
| 8/10/10 | 15.1 |
| 8/10/10 | 16.1 |
| 8/10/10 | 15.1 |
| 8/10/10 | 14.7 |
| 8/10/10 | 14.7 |
| 8/10/10 | 17.5 |
| 8/10/10 | 15.6 |
| 8/10/10 | 14.6 |
| 8/10/10 | 16.5 |
| 8/10/10 | 17.5 |
| 8/10/10 | 19.7 |
| 8/10/10 | 18.8 |
| 8/10/10 | 21.8 |
| 8/10/10 | 21.3 |
| 8/10/10 | 20.3 |
| 8/10/10 | 22.4 |
| 8/10/10 | 21.9 |
| 8/10/10 | 21.6 |
| 8/10/10 | 21.7 |
| 8/10/10 | 23.7 |
| 8/10/10 | 23.9 |
| 8/10/10 | 23.5 |
| 8/10/10 | 23.5 |
| 8/10/10 | 25.3 |
| 8/10/10 | 22.6 |
| 8/10/10 | 25.9 |
| 8/10/10 | 26.7 |
| 8/10/10 | 28.6 |
| 8/10/10 | 27.4 |
| 8/10/10 | 25.8 |
| 8/10/10 | 19.9 |
| 8/11/10 | 21.4 |
| 8/11/10 | 19.3 |
| 8/11/10 | 19.8 |
| 8/11/10 | 21.3 |
| 8/11/10 | 18.6 |
| 8/11/10 | 17.8 |
| 8/11/10 | 17.7 |
| 8/11/10 | 9.9 |
| 8/11/10 | 11.7 |
| 8/11/10 | 10.6 |
| 8/11/10 | 13.6 |
| 8/11/10 | 13.7 |
| 8/11/10 | 15.2 |
| 8/11/10 | 13.8 |
| 8/11/10 | 12.4 |
| 8/11/10 | 17.2 |
| 8/11/10 | 13.8 |
| 8/11/10 | 14.5 |
| 8/11/10 | 14.2 |
| 8/11/10 | 15.5 |
| 8/11/10 | 15.4 |
| 8/11/10 | 15.3 |
| 8/11/10 | 18.1 |
| 8/11/10 | 16.9 |
| 8/11/10 | 17.5 |
| 8/11/10 | 17.4 |
| 8/11/10 | 18.4 |
| 8/11/10 | 18.3 |
| 8/11/10 | 17.4 |
| 8/11/10 | 19.6 |
| 8/11/10 | 22.6 |
| 8/11/10 | 21.4 |
| 8/11/10 | 22.6 |
| 8/11/10 | 24 |
| 8/11/10 | 23.7 |
| 8/11/10 | 22.3 |
| 8/11/10 | 20.5 |
| 8/11/10 | 22.4 |
| 8/11/10 | 24.7 |
| 8/11/10 | 22.6 |
| 8/11/10 | 22.8 |
| 8/11/10 | 24.2 |
| 8/11/10 | 24.5 |
| 8/11/10 | 25.3 |
| 8/11/10 | 26.6 |
| 8/11/10 | 26.4 |
| 8/11/10 | 17.7 |
| 8/11/10 | 18 |
| 8/12/10 | 18.3 |
| 8/12/10 | 20.4 |
| 8/12/10 | 16.1 |
| 8/12/10 | 20.9 |
| 8/12/10 | 18.4 |
| 8/12/10 | 26.2 |
| 8/12/10 | 16.7 |
| 8/12/10 | 18.9 |
| 8/12/10 | 19.5 |
| 8/12/10 | 19.2 |
| 8/12/10 | 17.1 |
| 8/12/10 | 20.6 |
| 8/12/10 | 19.5 |
| 8/12/10 | 14.4 |
| 8/12/10 | 20.1 |
| 8/12/10 | 16.1 |
| 8/12/10 | 19.8 |
| 8/12/10 | 21.4 |
| 8/12/10 | 21.7 |
| 8/12/10 | 23.4 |
| 8/12/10 | 18.3 |
| 8/12/10 | 24.3 |
| 8/12/10 | 22.9 |
| 8/12/10 | 24.3 |
| 8/12/10 | 22.9 |
| 8/12/10 | 11.3 |
| 8/12/10 | 11.8 |
| 8/12/10 | 11.3 |
| 8/12/10 | 11.8 |
| 8/12/10 | 12.8 |
| 8/12/10 | 14 |
| 8/12/10 | 14.8 |
| 8/12/10 | 15.4 |
| 8/12/10 | 15.3 |
| 8/12/10 | 17.9 |
| 8/12/10 | 18.7 |
| 8/12/10 | 18 |
| 8/12/10 | 19 |
| 8/12/10 | 21.1 |
| 8/12/10 | 19.9 |
| 8/12/10 | 20.3 |
| 8/12/10 | 21.4 |
| 8/12/10 | 20.8 |
| 8/12/10 | 19.2 |
| 8/12/10 | 19.6 |
| 8/12/10 | 19 |
| 8/12/10 | 14.9 |
| 8/12/10 | 15.3 |
| 8/13/10 | 15.4 |
| 8/13/10 | 15.2 |
| 8/13/10 | 15.4 |
| 8/13/10 | 11.9 |
| 8/13/10 | 11.7 |
| 8/13/10 | 13.7 |
| 8/13/10 | 14.2 |
| 8/13/10 | 15.4 |
| 8/13/10 | 16.8 |
| 8/13/10 | 18.6 |
| 8/13/10 | 19.7 |
| 8/13/10 | 20.7 |
| 8/13/10 | 21.4 |
| 8/13/10 | 21.5 |
| 8/13/10 | 17.4 |
| 8/13/10 | 18.1 |
| 8/13/10 | 18.8 |
| 8/13/10 | 20.1 |
| 8/13/10 | 20.5 |
| 8/13/10 | 21.5 |
| 8/13/10 | 23.5 |
| 8/13/10 | 23.9 |
| 8/13/10 | 20.6 |
| 8/13/10 | 17.2 |
| 8/13/10 | 16.9 |
| 8/13/10 | 18.9 |
| 8/13/10 | 18.1 |
| 8/13/10 | 20.8 |
| 8/13/10 | 21.1 |
| 8/13/10 | 24 |
| 8/13/10 | 22.8 |
| 8/13/10 | 23.3 |
| 8/13/10 | 22.2 |
| 8/13/10 | 28.2 |
| 8/13/10 | 11.5 |
| 8/13/10 | 14.5 |
| 8/13/10 | 15.9 |
| 8/13/10 | 21 |
| 8/13/10 | 26.1 |
| 8/13/10 | 24.2 |
| 8/13/10 | 28.1 |
| 8/13/10 | 29.4 |
| 8/13/10 | 35.5 |
| 8/13/10 | 34.1 |
| 8/13/10 | 43.4 |
| 8/13/10 | 41.5 |
| 8/13/10 | 40.4 |
| 8/13/10 | 39.7 |
| 8/14/10 | 33.7 |
| 8/14/10 | 34.6 |
| 8/14/10 | 32.7 |
| 8/14/10 | 33.3 |
| 8/14/10 | 34.2 |
| 8/14/10 | 30.8 |
| 8/14/10 | 32.3 |
| 8/14/10 | 37 |
| 8/14/10 | 28.5 |
| 8/14/10 | 31.7 |
| 8/14/10 | 28.6 |
| 8/14/10 | 33 |
| 8/14/10 | 35.9 |
| 8/14/10 | 34.5 |
| 8/14/10 | 42.2 |
| 8/14/10 | 35.7 |
| 8/14/10 | 40 |
| 8/14/10 | 37.3 |
| 8/14/10 | 35.4 |
| 8/14/10 | 45.8 |
| 8/14/10 | 49.2 |
| 8/14/10 | 53.5 |
| 8/14/10 | 39.4 |
| 8/14/10 | 55.7 |
| 8/14/10 | 48.2 |
| 8/14/10 | 43.5 |
| 8/14/10 | 43.8 |
| 8/14/10 | 49.6 |
| 8/14/10 | 53.2 |
| 8/14/10 | 55.9 |
| 8/14/10 | 55.4 |
| 8/14/10 | 59.6 |
| 8/14/10 | 57.8 |
| 8/14/10 | 52.4 |
| 8/14/10 | 49 |
| 8/14/10 | 52.2 |
| 8/14/10 | 55.7 |
| 8/14/10 | 58.7 |
| 8/14/10 | 56.2 |
| 8/14/10 | 55.2 |
| 8/14/10 | 51.2 |
| 8/14/10 | 51.9 |
| 8/14/10 | 52.2 |
| 8/14/10 | 54.2 |
| 8/14/10 | 59.7 |
| 8/14/10 | 58.2 |
| 8/14/10 | 50.6 |
| 8/14/10 | 52.3 |
| 8/15/10 | 46.1 |
| 8/15/10 | 44.6 |
| 8/15/10 | 43.7 |
| 8/15/10 | 48.2 |
| 8/15/10 | 45.9 |
| 8/15/10 | 45.8 |
| 8/15/10 | 48.4 |
| 8/15/10 | 48.5 |
| 8/15/10 | 49.8 |
| 8/15/10 | 51.5 |
| 8/15/10 | 52.1 |
| 8/15/10 | 52.8 |
| 8/15/10 | 30.1 |
| 8/15/10 | 29.4 |
| 8/15/10 | 30 |
| 8/15/10 | 25.1 |
| 8/15/10 | 22 |
| 8/15/10 | 22.1 |
| 8/15/10 | 22.8 |
| 8/15/10 | 25.3 |
| 8/15/10 | 25.2 |
| 8/15/10 | 26.2 |
| 8/15/10 | 26.7 |
| 8/15/10 | 29.1 |
| 8/15/10 | 28.9 |
| 8/15/10 | 26.2 |
| 8/15/10 | 28.4 |
| 8/15/10 | 31.7 |
| 8/15/10 | 31.7 |
| 8/15/10 | 31.2 |
| 8/15/10 | 33.6 |
| 8/15/10 | 34.9 |
| 8/15/10 | 33.5 |
| 8/15/10 | 35.6 |
| 8/15/10 | 39 |
| 8/15/10 | 41.5 |
| 8/15/10 | 41.3 |
| 8/15/10 | 41.8 |
| 8/15/10 | 38.6 |
| 8/15/10 | 36.1 |
| 8/15/10 | 42.4 |
| 8/15/10 | 40.8 |
| 8/15/10 | 28.4 |
| 8/15/10 | 27.7 |
| 8/15/10 | 28.8 |
| 8/15/10 | 30.2 |
| 8/15/10 | 30.5 |
| 8/15/10 | 30.1 |
| 8/16/10 | 31.1 |
| 8/16/10 | 30.1 |
| 8/16/10 | 29.6 |
| 8/16/10 | 31.1 |
| 8/16/10 | 32 |
| 8/16/10 | 22 |
| 8/16/10 | 25.7 |
| 8/16/10 | 22.2 |
| 8/16/10 | 21.7 |
| 8/16/10 | 22.4 |
| 8/16/10 | 23.1 |
| 8/16/10 | 22.9 |
| 8/16/10 | 22.8 |
| 8/16/10 | 23.4 |
| 8/16/10 | 24 |
| 8/16/10 | 23.5 |
| 8/16/10 | 23.5 |
| 8/16/10 | 22.9 |
| 8/16/10 | 22.2 |
| 8/16/10 | 24.2 |
| 8/16/10 | 24.8 |
| 8/16/10 | 25.9 |
| 8/16/10 | 28.8 |
| 8/16/10 | 29.7 |
| 8/16/10 | 32.2 |
| 8/16/10 | 36.9 |
| 8/16/10 | 35.5 |
| 8/16/10 | 42.3 |
| 8/16/10 | 44.9 |
| 8/16/10 | 44.7 |
| 8/16/10 | 52.6 |
| 8/16/10 | 58.9 |
| 8/16/10 | 59.3 |
| 8/16/10 | 64.6 |
| 8/16/10 | 68.3 |
| 8/16/10 | 71.3 |
| 8/16/10 | 67.4 |
| 8/16/10 | 67.9 |
| 8/16/10 | 67.4 |
| 8/16/10 | 65.3 |
| 8/16/10 | 67.7 |
| 8/16/10 | 64.7 |
| 8/16/10 | 53.8 |
| 8/16/10 | 55.1 |
| 8/16/10 | 58.8 |
| 8/16/10 | 32.6 |
| 8/16/10 | 11.7 |
| 8/16/10 | 10.8 |
| 8/17/10 | 12.5 |
| 8/17/10 | 12.2 |
| 8/17/10 | 12.7 |
| 8/17/10 | 13.4 |
| 8/17/10 | 15.6 |
| 8/17/10 | 15.2 |
| 8/17/10 | 14.2 |
| 8/17/10 | 14.1 |
| 8/17/10 | 14.7 |
| 8/17/10 | 14.6 |
| 8/17/10 | 14.5 |
| 8/17/10 | 14.6 |
| 8/17/10 | 14.6 |
| 8/17/10 | 15.6 |
| 8/17/10 | 16.1 |
| 8/17/10 | 16.3 |
| 8/17/10 | 17.5 |
| 8/17/10 | 19.2 |
| 8/17/10 | 20 |
| 8/17/10 | 20.9 |
| 8/17/10 | 19.3 |
| 8/17/10 | 19.9 |
| 8/17/10 | 20.6 |
| 8/17/10 | 22.3 |
| 8/17/10 | 22.8 |
| 8/17/10 | 24.9 |
| 8/17/10 | 26.3 |
| 8/17/10 | 28 |
| 8/17/10 | 30.2 |
| 8/17/10 | 33.9 |
| 8/17/10 | 31.7 |
| 8/17/10 | 33.7 |
| 8/17/10 | 35.8 |
| 8/17/10 | 32.8 |
| 8/17/10 | 38.3 |
| 8/17/10 | 34.6 |
| 8/17/10 | 32.1 |
| 8/17/10 | 28.6 |
| 8/17/10 | 21.7 |
| 8/17/10 | 22.3 |
| 8/17/10 | 23.8 |
| 8/17/10 | 26.5 |
| 8/17/10 | 23.5 |
| 8/17/10 | 25.6 |
| 8/17/10 | 24.7 |
| 8/17/10 | 20 |
| 8/17/10 | 19.1 |
| 8/17/10 | 19.6 |
| 8/18/10 | 19.2 |
| 8/18/10 | 20.4 |
| 8/18/10 | 20.1 |
| 8/18/10 | 19.4 |
| 8/18/10 | 19.5 |
| 8/18/10 | 17.9 |
| 8/18/10 | 18.2 |
| 8/18/10 | 17.3 |
| 8/18/10 | 18.2 |
| 8/18/10 | 17.7 |
| 8/18/10 | 18.2 |
| 8/18/10 | 19.5 |
| 8/18/10 | 21 |
| 8/18/10 | 22.2 |
| 8/18/10 | 23.3 |
| 8/18/10 | 25.6 |
| 8/18/10 | 26.6 |
| 8/18/10 | 30.2 |
| 8/18/10 | 31.1 |
| 8/18/10 | 31.3 |
| 8/18/10 | 32.4 |
| 8/18/10 | 35.7 |
| 8/18/10 | 34.4 |
| 8/18/10 | 35.1 |
| 8/18/10 | 36.5 |
| 8/18/10 | 33.1 |
| 8/18/10 | 31.3 |
| 8/18/10 | 31.7 |
| 8/18/10 | 33.5 |
| 8/18/10 | 31.4 |
| 8/18/10 | 36 |
| 8/18/10 | 35 |
| 8/18/10 | 35.8 |
| 8/18/10 | 38.2 |
| 8/18/10 | 34.8 |
| 8/18/10 | 36.5 |
| 8/18/10 | 38.9 |
| 8/18/10 | 37.3 |
| 8/18/10 | 32.3 |
| 8/18/10 | 29.1 |
| 8/18/10 | 27.7 |
| 8/18/10 | 28.6 |
| 8/18/10 | 29.7 |
| 8/18/10 | 28.8 |
| 8/18/10 | 29.5 |
| 8/18/10 | 16.8 |
| 8/18/10 | 15.9 |
| 8/18/10 | 14.7 |
| 8/19/10 | 13.2 |
| 8/19/10 | 12.5 |
| 8/19/10 | 13.1 |
| 8/19/10 | 14.1 |
| 8/19/10 | 14.3 |
| 8/19/10 | 14.4 |
| 8/19/10 | 15.8 |
| 8/19/10 | 15.2 |
| 8/19/10 | 16.9 |
| 8/19/10 | 16.4 |
| 8/19/10 | 16.5 |
| 8/19/10 | 16.8 |
| 8/19/10 | 17.5 |
| 8/19/10 | 19.1 |
| 8/19/10 | 19.8 |
| 8/19/10 | 22.4 |
| 8/19/10 | 21.8 |
| 8/19/10 | 21.9 |
| 8/19/10 | 24.7 |
| 8/19/10 | 26.2 |
| 8/19/10 | 25.9 |
| 8/19/10 | 27.3 |
| 8/19/10 | 27.4 |
| 8/19/10 | 24.9 |
| 8/19/10 | 27 |
| 8/19/10 | 31.6 |
| 8/19/10 | 35.4 |
| 8/19/10 | 35.6 |
| 8/19/10 | 38.1 |
| 8/19/10 | 39.8 |
| 8/19/10 | 37.3 |
| 8/19/10 | 30.9 |
| 8/19/10 | 37.5 |
| 8/19/10 | 46.4 |
| 8/19/10 | 38 |
| 8/19/10 | 31.7 |
| 8/19/10 | 17.8 |
| 8/19/10 | 17.5 |
| 8/19/10 | 19.7 |
| 8/19/10 | 21.3 |
| 8/19/10 | 20.4 |
| 8/19/10 | 21.6 |
| 8/19/10 | 19.9 |
| 8/19/10 | 20.3 |
| 8/19/10 | 20.1 |
| 8/19/10 | 21.6 |
| 8/19/10 | 22 |
| 8/19/10 | 21.8 |
| 8/20/10 | 19.1 |
| 8/20/10 | 19.6 |
| 8/20/10 | 19.8 |
| 8/20/10 | 18.4 |
| 8/20/10 | 19.7 |
| 8/20/10 | 20.5 |
| 8/20/10 | 21.9 |
| 8/20/10 | 19.1 |
| 8/20/10 | 18 |
| 8/20/10 | 18.1 |
| 8/20/10 | 19.4 |
| 8/20/10 | 21.9 |
| 8/20/10 | 19.2 |
| 8/20/10 | 17 |
| 8/20/10 | 22.4 |
| 8/20/10 | 22 |
| 8/20/10 | 24.5 |
| 8/20/10 | 22.5 |
| 8/20/10 | 17.3 |
| 8/20/10 | 24.1 |
| 8/20/10 | 27.2 |
| 8/20/10 | 20 |
| 8/20/10 | 19.5 |
| 8/20/10 | 19.9 |
| 8/20/10 | 23 |
| 8/20/10 | 25.1 |
| 8/20/10 | 23.7 |
| 8/20/10 | 23.1 |
| 8/20/10 | 24.8 |
| 8/20/10 | 22.5 |
| 8/20/10 | 23.5 |
| 8/20/10 | 24.8 |
| 8/20/10 | 23.3 |
| 8/20/10 | 27.3 |
| 8/20/10 | 26 |
| 8/20/10 | 27.9 |
| 8/20/10 | 30 |
| 8/20/10 | 32.6 |
| 8/20/10 | 29.8 |
| 8/20/10 | 30.1 |
| 8/20/10 | 31.9 |
| 8/20/10 | 33.1 |
| 8/20/10 | 13.3 |
| 8/20/10 | 12.9 |
| 8/20/10 | 14.8 |
| 8/20/10 | 14.5 |
| 8/20/10 | 14 |
| 8/20/10 | 13.5 |
| 8/21/10 | 14.1 |
| 8/21/10 | 13.4 |
| 8/21/10 | 13.6 |
| 8/21/10 | 14.2 |
| 8/21/10 | 13.2 |
| 8/21/10 | 13.6 |
| 8/21/10 | 12.4 |
| 8/21/10 | 12.3 |
| 8/21/10 | 12.2 |
| 8/21/10 | 11.3 |
| 8/21/10 | 12.8 |
| 8/21/10 | 13.5 |
| 8/21/10 | 14.6 |
| 8/21/10 | 14.9 |
| 8/21/10 | 14.1 |
| 8/21/10 | 14.9 |
| 8/21/10 | 11.6 |
| 8/21/10 | 15.3 |
| 8/21/10 | 14.2 |
| 8/21/10 | 14.7 |
| 8/21/10 | 15.6 |
| 8/21/10 | 18.3 |
| 8/21/10 | 14.3 |
| 8/21/10 | 16 |
| 8/21/10 | 19.7 |
| 8/21/10 | 17.3 |
| 8/21/10 | 19.2 |
| 8/21/10 | 16.9 |
| 8/21/10 | 19.8 |
| 8/21/10 | 19.3 |
| 8/21/10 | 16.3 |
| 8/21/10 | 19.6 |
| 8/21/10 | 17.9 |
| 8/21/10 | 20.9 |
| 8/21/10 | 21.7 |
| 8/21/10 | 18.7 |
| 8/21/10 | 18.6 |
| 8/21/10 | 18.9 |
| 8/21/10 | 21.6 |
| 8/21/10 | 22.3 |
| 8/21/10 | 19.8 |
| 8/21/10 | 22.8 |
| 8/21/10 | 22.3 |
| 8/21/10 | 21.6 |
| 8/21/10 | 29 |
| 8/21/10 | 25.1 |
| 8/21/10 | 23.6 |
| 8/21/10 | 24 |
| 8/22/10 | 20.7 |
| 8/22/10 | 21 |
| 8/22/10 | 24 |
| 8/22/10 | 25 |
| 8/22/10 | 25.4 |
| 8/22/10 | 25.2 |
| 8/22/10 | 23.5 |
| 8/22/10 | 16 |
| 8/22/10 | 23 |
| 8/22/10 | 26.4 |
| 8/22/10 | 29.5 |
| 8/22/10 | 32.7 |
| 8/22/10 | 25 |
| 8/22/10 | 18 |
| 8/22/10 | 17.4 |
| 8/22/10 | 16.6 |
| 8/22/10 | 19.2 |
| 8/22/10 | 18.1 |
| 8/22/10 | 16.2 |
| 8/22/10 | 22.2 |
| 8/22/10 | 22.2 |
| 8/22/10 | 18.9 |
| 8/22/10 | 21.7 |
| 8/22/10 | 24.6 |
| 8/22/10 | 23 |
| 8/22/10 | 19.3 |
| 8/22/10 | 21.2 |
| 8/22/10 | 30.5 |
| 8/22/10 | 25.6 |
| 8/22/10 | 35.2 |
| 8/22/10 | 35 |
| 8/22/10 | 31.4 |
| 8/22/10 | 31.2 |
| 8/22/10 | 36.1 |
| 8/22/10 | 36.2 |
| 8/22/10 | 32 |
| 8/22/10 | 33.9 |
| 8/22/10 | 23.3 |
| 8/22/10 | 38.7 |
| 8/22/10 | 36.4 |
| 8/22/10 | 40.7 |
| 8/22/10 | 40.1 |
| 8/22/10 | 41 |
| 8/22/10 | 39.4 |
| 8/22/10 | 23.2 |
| 8/22/10 | 25.5 |
| 8/22/10 | 28 |
| 8/22/10 | 24.6 |
| 8/23/10 | 27.2 |
| 8/23/10 | 28.3 |
| 8/23/10 | 15.9 |
| 8/23/10 | 18.5 |
| 8/23/10 | 18.2 |
| 8/23/10 | 19.9 |
| 8/23/10 | 21.3 |
| 8/23/10 | 19.6 |
| 8/23/10 | 22.6 |
| 8/23/10 | 23.9 |
| 8/23/10 | 24.9 |
| 8/23/10 | 24.5 |
| 8/23/10 | 22.7 |
| 8/23/10 | 25.4 |
| 8/23/10 | 25.8 |
| 8/23/10 | 26.3 |
| 8/23/10 | 29.5 |
| 8/23/10 | 28.8 |
| 8/23/10 | 28.3 |
| 8/23/10 | 31 |
| 8/23/10 | 29.4 |
| 8/23/10 | 30.1 |
| 8/23/10 | 30.4 |
| 8/23/10 | 26.3 |
| 8/23/10 | 29.4 |
| 8/23/10 | 34.7 |
| 8/23/10 | 37.2 |
| 8/23/10 | 32.7 |
| 8/23/10 | 38.7 |
| 8/23/10 | 34.1 |
| 8/23/10 | 39.2 |
| 8/23/10 | 39.3 |
| 8/23/10 | 32.5 |
| 8/23/10 | 36.6 |
| 8/23/10 | 24.9 |
| 8/23/10 | 26.7 |
| 8/23/10 | 26.7 |
| 8/23/10 | 25.5 |
| 8/23/10 | 26.2 |
| 8/23/10 | 20.7 |
| 8/23/10 | 24.9 |
| 8/23/10 | 23.4 |
| 8/23/10 | 25.2 |
| 8/23/10 | 25.3 |
| 8/23/10 | 30.5 |
| 8/23/10 | 30.9 |
| 8/23/10 | 32.7 |
| 8/23/10 | 23.4 |
| 8/24/10 | 23.3 |
| 8/24/10 | 22.5 |
| 8/24/10 | 25.1 |
| 8/24/10 | 25.2 |
| 8/24/10 | 20.9 |
| 8/24/10 | 22.4 |
| 8/24/10 | 24.8 |
| 8/24/10 | 23.8 |
| 8/24/10 | 27.7 |
| 8/24/10 | 32.5 |
| 8/24/10 | 35.7 |
| 8/24/10 | 37.2 |
| 8/24/10 | 39.3 |
| 8/24/10 | 43.3 |
| 8/24/10 | 50.8 |
| 8/24/10 | 50.1 |
| 8/24/10 | 40.3 |
| 8/24/10 | 44.5 |
| 8/24/10 | 34.3 |
| 8/24/10 | 35.1 |
| 8/24/10 | 41.5 |
| 8/24/10 | 40.7 |
| 8/24/10 | 39 |
| 8/24/10 | 35 |
| 8/24/10 | 31.6 |
| 8/24/10 | 32.2 |
| 8/24/10 | 41.7 |
| 8/24/10 | 44.3 |
| 8/24/10 | 42.9 |
| 8/24/10 | 42.5 |
| 8/24/10 | 45.9 |
| 8/24/10 | 39.4 |
| 8/24/10 | 42.1 |
| 8/24/10 | 44.1 |
| 8/24/10 | 31.8 |
| 8/24/10 | 28.4 |
| 8/24/10 | 22.8 |
| 8/24/10 | 30.1 |
| 8/24/10 | 27.1 |
| 8/24/10 | 27.7 |
| 8/24/10 | 25.5 |
| 8/24/10 | 23.7 |
| 8/24/10 | 26.5 |
| 8/24/10 | 25.2 |
| 8/24/10 | 30.1 |
| 8/24/10 | 26.5 |
| 8/24/10 | 28.6 |
| 8/24/10 | 31.1 |
| 8/25/10 | 28.9 |
| 8/25/10 | 34 |
| 8/25/10 | 34.7 |
| 8/25/10 | 32.9 |
| 8/25/10 | 32.5 |
| 8/25/10 | 37 |
| 8/25/10 | 37.6 |
| 8/25/10 | 41.1 |
| 8/25/10 | 40.1 |
| 8/25/10 | 32.5 |
| 8/25/10 | 42.8 |
| 8/25/10 | 31.9 |
| 8/25/10 | 41.6 |
| 8/25/10 | 30.2 |
| 8/25/10 | 42 |
| 8/25/10 | 46.2 |
| 8/25/10 | 44 |
| 8/25/10 | 34.4 |
| 8/25/10 | 30.7 |
| 8/25/10 | 33.6 |
| 8/25/10 | 29.6 |
| 8/25/10 | 32.2 |
| 8/25/10 | 32.4 |
| 8/25/10 | 37.2 |
| 8/25/10 | 36.5 |
| 8/25/10 | 35.9 |
| 8/25/10 | 36 |
| 8/25/10 | 29.6 |
| 8/25/10 | 38.1 |
| 8/25/10 | 47.4 |
| 8/25/10 | 39.6 |
| 8/25/10 | 41.3 |
| 8/25/10 | 34.1 |
| 8/25/10 | 38.1 |
| 8/25/10 | 41.8 |
| 8/25/10 | 40.1 |
| 8/25/10 | 35.1 |
| 8/25/10 | 34.4 |
| 8/25/10 | 23.6 |
| 8/25/10 | 32.2 |
| 8/25/10 | 25.3 |
| 8/25/10 | 24 |
| 8/25/10 | 30 |
| 8/25/10 | 25.8 |
| 8/25/10 | 31.5 |
| 8/25/10 | 29 |
| 8/25/10 | 24.3 |
| 8/25/10 | 31.5 |
| 8/26/10 | 23.9 |
| 8/26/10 | 11.2 |
| 8/26/10 | 11.7 |
| 8/26/10 | 11.6 |
| 8/26/10 | 12.7 |
| 8/26/10 | 12.6 |
| 8/26/10 | 12.7 |
| 8/26/10 | 13.6 |
| 8/26/10 | 13.3 |
| 8/26/10 | 14.4 |
| 8/26/10 | 15.1 |
| 8/26/10 | 19.2 |
| 8/26/10 | 19.4 |
| 8/26/10 | 21.8 |
| 8/26/10 | 24 |
| 8/26/10 | 20.9 |
| 8/26/10 | 26.5 |
| 8/26/10 | 28.4 |
| 8/26/10 | 32 |
| 8/26/10 | 26.9 |
| 8/26/10 | 32.2 |
| 8/26/10 | 30.4 |
| 8/26/10 | 34.7 |
| 8/26/10 | 34.4 |
| 8/26/10 | 33.5 |
| 8/26/10 | 34.6 |
| 8/26/10 | 31 |
| 8/26/10 | 34.2 |
| 8/26/10 | 33.9 |
| 8/26/10 | 30 |
| 8/26/10 | 24.7 |
| 8/26/10 | 26.7 |
| 8/26/10 | 27.6 |
| 8/26/10 | 25.4 |
| 8/26/10 | 35.6 |
| 8/26/10 | 25.3 |
| 8/26/10 | 26.6 |
| 8/26/10 | 31.9 |
| 8/26/10 | 31.6 |
| 8/26/10 | 30.4 |
| 8/26/10 | 33.7 |
| 8/26/10 | 35.2 |
| 8/26/10 | 32.3 |
| 8/26/10 | 26.8 |
| 8/26/10 | 33.2 |
| 8/26/10 | 27.2 |
| 8/26/10 | 31.9 |
| 8/26/10 | 32.2 |
| 8/27/10 | 28.6 |
| 8/27/10 | 24.8 |
| 8/27/10 | 24.6 |
| 8/27/10 | 25.7 |
| 8/27/10 | 23.4 |
| 8/27/10 | 26.9 |
| 8/27/10 | 23.3 |
| 8/27/10 | 25.7 |
| 8/27/10 | 29.7 |
| 8/27/10 | 31.2 |
| 8/27/10 | 28.9 |
| 8/27/10 | 37.6 |
| 8/27/10 | 30.6 |
| 8/27/10 | 32.4 |
| 8/27/10 | 35.7 |
| 8/27/10 | 32.1 |
| 8/27/10 | 36.7 |
| 8/27/10 | 30.9 |
| 8/27/10 | 39.5 |
| 8/27/10 | 37.9 |
| 8/27/10 | 40.1 |
| 8/27/10 | 33.6 |
| 8/27/10 | 47 |
| 8/27/10 | 47.7 |
| 8/27/10 | 43.1 |
| 8/27/10 | 31.8 |
| 8/27/10 | 37.4 |
| 8/27/10 | 34.8 |
| 8/27/10 | 40.7 |
| 8/27/10 | 28.3 |
| 8/27/10 | 29.4 |
| 8/27/10 | 34.2 |
| 8/27/10 | 34.1 |
| 8/27/10 | 34.3 |
| 8/27/10 | 27.7 |
| 8/27/10 | 30.6 |
| 8/27/10 | 28.6 |
| 8/27/10 | 27.5 |
| 8/27/10 | 28.2 |
| 8/27/10 | 31.5 |
| 8/27/10 | 29.1 |
| 8/27/10 | 32.4 |
| 8/27/10 | 27.4 |
| 8/27/10 | 29.4 |
| 8/27/10 | 15.4 |
| 8/27/10 | 15.9 |
| 8/27/10 | 15 |
| 8/27/10 | 15.8 |
| 8/28/10 | 14.7 |
| 8/28/10 | 14.9 |
| 8/28/10 | 13.8 |
| 8/28/10 | 14.2 |
| 8/28/10 | 14.7 |
| 8/28/10 | 17.7 |
| 8/28/10 | 16 |
| 8/28/10 | 19.2 |
| 8/28/10 | 16 |
| 8/28/10 | 20.6 |
| 8/28/10 | 16 |
| 8/28/10 | 19.8 |
| 8/28/10 | 22.4 |
| 8/28/10 | 23.7 |
| 8/28/10 | 26.5 |
| 8/28/10 | 25.9 |
| 8/28/10 | 26.3 |
| 8/28/10 | 29.4 |
| 8/28/10 | 26.4 |
| 8/28/10 | 26.8 |
| 8/28/10 | 28.8 |
| 8/28/10 | 28.4 |
| 8/28/10 | 25.7 |
| 8/28/10 | 25.1 |
| 8/28/10 | 31.5 |
| 8/28/10 | 30.5 |
| 8/28/10 | 27.5 |
| 8/28/10 | 30.3 |
| 8/28/10 | 26.5 |
| 8/28/10 | 25 |
| 8/28/10 | 31 |
| 8/28/10 | 23.6 |
| 8/28/10 | 21.2 |
| 8/28/10 | 22.8 |
| 8/28/10 | 24.7 |
| 8/28/10 | 22 |
| 8/28/10 | 21 |
| 8/28/10 | 21.6 |
| 8/28/10 | 23.1 |
| 8/28/10 | 18.7 |
| 8/28/10 | 18.5 |
| 8/28/10 | 16.1 |
| 8/28/10 | 17.8 |
| 8/28/10 | 19.5 |
| 8/28/10 | 18.1 |
| 8/28/10 | 16.1 |
| 8/28/10 | 18.5 |
| 8/28/10 | 16.3 |
| 8/29/10 | 20.4 |
| 8/29/10 | 17.5 |
| 8/29/10 | 16 |
| 8/29/10 | 15.1 |
| 8/29/10 | 14.6 |
| 8/29/10 | 11.6 |
| 8/29/10 | 10.7 |
| 8/29/10 | 11 |
| 8/29/10 | 25.4 |
| 8/29/10 | 10.6 |
| 8/29/10 | 10.6 |
| 8/29/10 | 10.1 |
| 8/29/10 | 10.8 |
| 8/29/10 | 11.2 |
| 8/29/10 | 12.8 |
| 8/29/10 | 13.6 |
| 8/29/10 | 14.4 |
| 8/29/10 | 14.8 |
| 8/29/10 | 15.1 |
| 8/29/10 | 15.4 |
| 8/29/10 | 14.8 |
| 8/29/10 | 15.9 |
| 8/29/10 | 15.4 |
| 8/29/10 | 17 |
| 8/29/10 | 16.5 |
| 8/29/10 | 17.5 |
| 8/29/10 | 15.4 |
| 8/29/10 | 16 |
| 8/29/10 | 16.3 |
| 8/29/10 | 15.9 |
| 8/29/10 | 15.3 |
| 8/29/10 | 14.6 |
| 8/29/10 | 15 |
| 8/29/10 | 14.8 |
| 8/29/10 | 13.9 |
| 8/29/10 | 14.7 |
| 8/29/10 | 15.2 |
| 8/29/10 | 13.9 |
| 8/29/10 | 14.4 |
| 8/29/10 | 13 |
| 8/29/10 | 13.5 |
| 8/29/10 | 13.8 |
| 8/29/10 | 13.7 |
| 8/29/10 | 14 |
| 8/29/10 | 15.6 |
| 8/29/10 | 13.7 |
| 8/29/10 | 13.3 |
| 8/29/10 | 13.7 |
| 8/30/10 | 12.8 |
| 8/30/10 | 13.9 |
| 8/30/10 | 13.6 |
| 8/30/10 | 13.1 |
| 8/30/10 | 12.1 |
| 8/30/10 | 12.8 |
| 8/30/10 | 11.3 |
| 8/30/10 | 11.4 |
| 8/30/10 | 10.9 |
| 8/30/10 | 11 |
| 8/30/10 | 12.1 |
| 8/30/10 | 11.5 |
| 8/30/10 | 12.2 |
| 8/30/10 | 11.7 |
| 8/30/10 | 12 |
| 8/30/10 | 12.6 |
| 8/30/10 | 15.4 |
| 8/30/10 | 13.3 |
| 8/30/10 | 14.2 |
| 8/30/10 | 13.2 |
| 8/30/10 | 13.7 |
| 8/30/10 | 12.8 |
| 8/30/10 | 13 |
| 8/30/10 | 13 |
| 8/30/10 | 12.8 |
| 8/30/10 | 14.1 |
| 8/30/10 | 14.8 |
| 8/30/10 | 13.1 |
| 8/30/10 | 14.2 |
| 8/30/10 | 15.3 |
| 8/30/10 | 13.9 |
| 8/30/10 | 15 |
| 8/30/10 | 13.8 |
| 8/30/10 | 12.9 |
| 8/30/10 | 14.2 |
| 8/30/10 | 14.4 |
| 8/30/10 | 11.8 |
| 8/30/10 | 14.2 |
| 8/30/10 | 15 |
| 8/30/10 | 13.7 |
| 8/30/10 | 12.7 |
| 8/30/10 | 10.7 |
| 8/30/10 | 10.9 |
| 8/30/10 | 16 |
| 8/30/10 | 10 |
| 8/30/10 | 12 |
| 8/30/10 | 11.1 |
| 8/30/10 | 11.6 |
| 8/31/10 | 12.6 |
| 8/31/10 | 11.3 |
| 8/31/10 | 12.4 |
| 8/31/10 | 10.3 |
| 8/31/10 | 10.8 |
| 8/31/10 | 9.9 |
| 8/31/10 | 11.1 |
| 8/31/10 | 11.1 |
| 8/31/10 | 11 |
| 8/31/10 | 9.9 |
| 8/31/10 | 10.3 |
| 8/31/10 | 9.6 |
| 8/31/10 | 9.2 |
| 8/31/10 | 10.3 |
| 8/31/10 | 9.9 |
| 8/31/10 | 9.4 |
| 8/31/10 | 10.2 |
| 8/31/10 | 11.1 |
| 8/31/10 | 11.5 |
| 8/31/10 | 10.3 |
| 8/31/10 | 11.4 |
| 8/31/10 | 12.2 |
| 8/31/10 | 11.5 |
| 8/31/10 | 11 |
| 8/31/10 | 9.4 |
| 8/31/10 | 9.8 |
| 8/31/10 | 12.1 |
| 8/31/10 | 11.9 |
| 8/31/10 | 13.9 |
| 8/31/10 | 12.4 |
| 8/31/10 | 11.8 |
| 8/31/10 | 11 |
| 8/31/10 | 13 |
| 8/31/10 | 11.9 |
| 8/31/10 | 13.1 |
| 8/31/10 | 13.5 |
| 8/31/10 | 13.5 |
| 8/31/10 | 13.9 |
| 8/31/10 | 20.4 |
| 8/31/10 | 11.3 |
| 8/31/10 | 10.6 |
| 8/31/10 | 10.7 |
| 8/31/10 | 11.5 |
| 8/31/10 | 10.2 |
| 8/31/10 | 9.9 |
| 8/31/10 | 10.9 |
| 8/31/10 | 10.8 |
| 8/31/10 | 9.7 |
| 9/1/10 | 9.7 |
| 9/1/10 | 10.8 |
| 9/1/10 | 10.2 |
| 9/1/10 | 9.7 |
| 9/1/10 | 9.3 |
| 9/1/10 | 8 |
| 9/1/10 | 7.1 |
| 9/1/10 | 7.5 |
| 9/1/10 | 8.3 |
| 9/1/10 | 7.2 |
| 9/1/10 | 8.3 |
| 9/1/10 | 8.5 |
| 9/1/10 | 8.1 |
| 9/1/10 | 7.8 |
| 9/1/10 | 7.3 |
| 9/1/10 | 9.3 |
| 9/1/10 | 7.9 |
| 9/1/10 | 8 |
| 9/1/10 | 7.8 |
| 9/1/10 | 8.8 |
| 9/1/10 | 8.8 |
| 9/1/10 | 9 |
| 9/1/10 | 8.6 |
| 9/1/10 | 8.9 |
| 9/1/10 | 11.1 |
| 9/1/10 | 11.8 |
| 9/1/10 | 11 |
| 9/1/10 | 10.5 |
| 9/1/10 | 12.1 |
| 9/1/10 | 12.2 |
| 9/1/10 | 9.8 |
| 9/1/10 | 13.1 |
| 9/1/10 | 8.5 |
| 9/1/10 | 7.1 |
| 9/1/10 | 7.6 |
| 9/1/10 | 8.3 |
| 9/1/10 | 7 |
| 9/1/10 | 8.3 |
| 9/1/10 | 8.6 |
| 9/1/10 | 9.7 |
| 9/1/10 | 10.3 |
| 9/1/10 | 11.2 |
| 9/1/10 | 10.1 |
| 9/1/10 | 11.2 |
| 9/1/10 | 9.8 |
| 9/1/10 | 10.6 |
| 9/1/10 | 9.5 |
| 9/1/10 | 9.9 |
| 9/2/10 | 8.8 |
| 9/2/10 | 8.2 |
| 9/2/10 | 8 |
| 9/2/10 | 7.3 |
| 9/2/10 | 7.5 |
| 9/2/10 | 7.6 |
| 9/2/10 | 7 |
| 9/2/10 | 8.3 |
| 9/2/10 | 7.4 |
| 9/2/10 | 6.3 |
| 9/2/10 | 7.6 |
| 9/2/10 | 7.3 |
| 9/2/10 | 8.2 |
| 9/2/10 | 14.2 |
| 9/2/10 | 8.2 |
| 9/2/10 | 9.4 |
| 9/2/10 | 7.8 |
| 9/2/10 | 8.6 |
| 9/2/10 | 10.3 |
| 9/2/10 | 9.3 |
| 9/2/10 | 10.8 |
| 9/2/10 | 12.9 |
| 9/2/10 | 14.6 |
| 9/2/10 | 14.1 |
| 9/2/10 | 10.8 |
| 9/2/10 | 14.4 |
| 9/2/10 | 13 |
| 9/2/10 | 15.1 |
| 9/2/10 | 13.9 |
| 9/2/10 | 12.4 |
| 9/2/10 | 12 |
| 9/2/10 | 17.2 |
| 9/2/10 | 12 |
| 9/2/10 | 14.5 |
| 9/2/10 | 13.4 |
| 9/2/10 | 11.2 |
| 9/2/10 | 11.2 |
| 9/2/10 | 10.8 |
| 9/2/10 | 9.5 |
| 9/2/10 | 13.2 |
| 9/2/10 | 13.1 |
| 9/2/10 | 11.8 |
| 9/2/10 | 12.1 |
| 9/2/10 | 13.5 |
| 9/2/10 | 14 |
| 9/2/10 | 15.2 |
| 9/2/10 | 13.5 |
| 9/2/10 | 11.5 |
| 9/3/10 | 11.2 |
| 9/3/10 | 13.2 |
| 9/3/10 | 13.2 |
| 9/3/10 | 13.4 |
| 9/3/10 | 15.1 |
| 9/3/10 | 15.4 |
| 9/3/10 | 14 |
| 9/3/10 | 14.8 |
| 9/3/10 | 17 |
| 9/3/10 | 17.9 |
| 9/3/10 | 18.1 |
| 9/3/10 | 17.1 |
| 9/3/10 | 17.4 |
| 9/3/10 | 16.6 |
| 9/3/10 | 19.6 |
| 9/3/10 | 21.4 |
| 9/3/10 | 20.8 |
| 9/3/10 | 19.6 |
| 9/3/10 | 22.8 |
| 9/3/10 | 24 |
| 9/3/10 | 23.2 |
| 9/3/10 | 25.1 |
| 9/3/10 | 22 |
| 9/3/10 | 22.6 |
| 9/3/10 | 19.9 |
| 9/3/10 | 17.9 |
| 9/3/10 | 18.7 |
| 9/3/10 | 18.5 |
| 9/3/10 | 16.8 |
| 9/3/10 | 17 |
| 9/3/10 | 14.2 |
| 9/3/10 | 16.7 |
| 9/3/10 | 17.1 |
| 9/3/10 | 21.9 |
| 9/3/10 | 17 |
| 9/3/10 | 16 |
| 9/3/10 | 16.4 |
| 9/3/10 | 15.8 |
| 9/3/10 | 15.7 |
| 9/3/10 | 18 |
| 9/3/10 | 18.4 |
| 9/3/10 | 14.8 |
| 9/3/10 | 16.6 |
| 9/3/10 | 16.9 |
| 9/3/10 | 15.9 |
| 9/3/10 | 14.5 |
| 9/3/10 | 14.6 |
| 9/3/10 | 11.9 |
| 9/4/10 | 12.9 |
| 9/4/10 | 13.1 |
| 9/4/10 | 15.5 |
| 9/4/10 | 18.1 |
| 9/4/10 | 15.2 |
| 9/4/10 | 16.1 |
| 9/4/10 | 15.4 |
| 9/4/10 | 16.5 |
| 9/4/10 | 22 |
| 9/4/10 | 21.5 |
| 9/4/10 | 20.9 |
| 9/4/10 | 20.1 |
| 9/4/10 | 21.5 |
| 9/4/10 | 18.7 |
| 9/4/10 | 22.4 |
| 9/4/10 | 21.9 |
| 9/4/10 | 26.9 |
| 9/4/10 | 23.7 |
| 9/4/10 | 29.2 |
| 9/4/10 | 29.8 |
| 9/4/10 | 31.6 |
| 9/4/10 | 28.7 |
| 9/4/10 | 24.7 |
| 9/4/10 | 27 |
| 9/4/10 | 27.7 |
| 9/4/10 | 25.9 |
| 9/4/10 | 26.4 |
| 9/4/10 | 31 |
| 9/4/10 | 24.6 |
| 9/4/10 | 24.7 |
| 9/4/10 | 22.3 |
| 9/4/10 | 22.2 |
| 9/4/10 | 21.2 |
| 9/4/10 | 22 |
| 9/4/10 | 19.6 |
| 9/4/10 | 19.6 |
| 9/4/10 | 19.5 |
| 9/4/10 | 19.2 |
| 9/4/10 | 21.5 |
| 9/4/10 | 18.3 |
| 9/4/10 | 17.8 |
| 9/4/10 | 18.4 |
| 9/4/10 | 20 |
| 9/4/10 | 20.7 |
| 9/4/10 | 22.6 |
| 9/4/10 | 21.9 |
| 9/4/10 | 21.9 |
| 9/4/10 | 23 |
| 9/5/10 | 21.9 |
| 9/5/10 | 22.7 |
| 9/5/10 | 22.1 |
| 9/5/10 | 21.9 |
| 9/5/10 | 22.2 |
| 9/5/10 | 23.6 |
| 9/5/10 | 20.6 |
| 9/5/10 | 19.5 |
| 9/5/10 | 20 |
| 9/5/10 | 19.2 |
| 9/5/10 | 20.8 |
| 9/5/10 | 20.1 |
| 9/5/10 | 20.6 |
| 9/5/10 | 22.4 |
| 9/5/10 | 21.5 |
| 9/5/10 | 24.7 |
| 9/5/10 | 23.5 |
| 9/5/10 | 24.7 |
| 9/5/10 | 24 |
| 9/5/10 | 22.3 |
| 9/5/10 | 29.1 |
| 9/5/10 | 25.2 |
| 9/5/10 | 21.3 |
| 9/5/10 | 20 |
| 9/5/10 | 19.2 |
| 9/5/10 | 20.4 |
| 9/5/10 | 20.9 |
| 9/5/10 | 25.9 |
| 9/5/10 | 26.8 |
| 9/5/10 | 20.5 |
| 9/5/10 | 20.3 |
| 9/5/10 | 20.1 |
| 9/5/10 | 16.9 |
| 9/5/10 | 21.2 |
| 9/5/10 | 18 |
| 9/5/10 | 18.8 |
| 9/5/10 | 464 |
| 9/5/10 | 19.3 |
| 9/5/10 | 19.3 |
| 9/5/10 | 16.9 |
| 9/5/10 | 15.7 |
| 9/5/10 | 15.5 |
| 9/5/10 | 14.8 |
| 9/5/10 | 15.1 |
| 9/5/10 | 16.1 |
| 9/5/10 | 16.7 |
| 9/5/10 | 15.7 |
| 9/5/10 | 14.9 |
| 9/6/10 | 14.9 |
| 9/6/10 | 15.8 |
| 9/6/10 | 17.4 |
| 9/6/10 | 17.9 |
| 9/6/10 | 17.9 |
| 9/6/10 | 19.3 |
| 9/6/10 | 22 |
| 9/6/10 | 19.9 |
| 9/6/10 | 18.8 |
| 9/6/10 | 19.3 |
| 9/6/10 | 18.8 |
| 9/6/10 | 19.4 |
| 9/6/10 | 19.8 |
| 9/6/10 | 19.5 |
| 9/6/10 | 23.7 |
| 9/6/10 | 22.8 |
| 9/6/10 | 24.8 |
| 9/6/10 | 22 |
| 9/6/10 | 20 |
| 9/6/10 | 24.6 |
| 9/6/10 | 23 |
| 9/6/10 | 20.5 |
| 9/6/10 | 19.4 |
| 9/6/10 | 18.7 |
| 9/6/10 | 18 |
| 9/6/10 | 18.9 |
| 9/6/10 | 20.2 |
| 9/6/10 | 20.1 |
| 9/6/10 | 17.1 |
| 9/6/10 | 15.2 |
| 9/6/10 | 17.5 |
| 9/6/10 | 14 |
| 9/6/10 | 15.3 |
| 9/6/10 | 10.9 |
| 9/6/10 | 14.2 |
| 9/6/10 | 16.1 |
| 9/6/10 | 16.6 |
| 9/6/10 | 19 |
| 9/6/10 | 17.2 |
| 9/6/10 | 17.3 |
| 9/6/10 | 18.4 |
| 9/6/10 | 18.4 |
| 9/6/10 | 19.5 |
| 9/6/10 | 17.4 |
| 9/6/10 | 19.4 |
| 9/6/10 | 17 |
| 9/6/10 | 9 |
| 9/6/10 | 13 |
| 9/7/10 | 14.1 |
| 9/7/10 | 13.6 |
| 9/7/10 | 14.5 |
| 9/7/10 | 15.4 |
| 9/7/10 | 15.8 |
| 9/7/10 | 15.7 |
| 9/7/10 | 16.3 |
| 9/7/10 | 18.4 |
| 9/7/10 | 20 |
| 9/7/10 | 18.9 |
| 9/7/10 | 18.4 |
| 9/7/10 | 19 |
| 9/7/10 | 19 |
| 9/7/10 | 19.7 |
| 9/7/10 | 20.5 |
| 9/7/10 | 21.7 |
| 9/7/10 | 24 |
| 9/7/10 | 24.5 |
| 9/7/10 | 24.5 |
| 9/7/10 | 29.8 |
| 9/7/10 | 27.1 |
| 9/7/10 | 25.8 |
| 9/7/10 | 26 |
| 9/7/10 | 23 |
| 9/7/10 | 24.3 |
| 9/7/10 | 24.5 |
| 9/7/10 | 25.2 |
| 9/7/10 | 23.6 |
| 9/7/10 | 23.2 |
| 9/7/10 | 20.4 |
| 9/7/10 | 18.5 |
| 9/7/10 | 20.3 |
| 9/7/10 | 19.4 |
| 9/7/10 | 22.7 |
| 9/7/10 | 21.5 |
| 9/7/10 | 18.3 |
| 9/7/10 | 17.1 |
| 9/7/10 | 16.4 |
| 9/7/10 | 17.7 |
| 9/7/10 | 13.9 |
| 9/7/10 | 15.6 |
| 9/7/10 | 15.3 |
| 9/7/10 | 15 |
| 9/7/10 | 15.3 |
| 9/7/10 | 19.4 |
| 9/7/10 | 14.7 |
| 9/7/10 | 14.1 |
| 9/7/10 | 14.6 |
| 9/8/10 | 13.9 |
| 9/8/10 | 14.8 |
| 9/8/10 | 13.3 |
| 9/8/10 | 14 |
| 9/8/10 | 13.8 |
| 9/8/10 | 15 |
| 9/8/10 | 15.3 |
| 9/8/10 | 14 |
| 9/8/10 | 15.1 |
| 9/8/10 | 12.6 |
| 9/8/10 | 12.3 |
| 9/8/10 | 12.7 |
| 9/8/10 | 14.5 |
| 9/8/10 | 13 |
| 9/8/10 | 12.2 |
| 9/8/10 | 13 |
| 9/8/10 | 13.2 |
| 9/8/10 | 14.7 |
| 9/8/10 | 18.9 |
| 9/8/10 | 21.8 |
| 9/8/10 | 18.4 |
| 9/8/10 | 19.3 |
| 9/8/10 | 16.9 |
| 9/8/10 | 17.8 |
| 9/8/10 | 17.5 |
| 9/8/10 | 19.9 |
| 9/8/10 | 18.5 |
| 9/8/10 | 21.1 |
| 9/8/10 | 25.1 |
| 9/8/10 | 21.8 |
| 9/8/10 | 26.8 |
| 9/8/10 | 23.3 |
| 9/8/10 | 26 |
| 9/8/10 | 27.1 |
| 9/8/10 | 22.1 |
| 9/8/10 | 25.4 |
| 9/8/10 | 23.1 |
| 9/8/10 | 19.5 |
| 9/8/10 | 14.6 |
| 9/8/10 | 15.2 |
| 9/8/10 | 17.8 |
| 9/8/10 | 14.4 |
| 9/8/10 | 13.5 |
| 9/8/10 | 13.4 |
| 9/8/10 | 13.4 |
| 9/8/10 | 13.4 |
| 9/8/10 | 14.2 |
| 9/8/10 | 14.4 |
| 9/9/10 | 12.8 |
| 9/9/10 | 14.5 |
| 9/9/10 | 15.2 |
| 9/9/10 | 15.9 |
| 9/9/10 | 17 |
| 9/9/10 | 17.5 |
| 9/9/10 | 17.7 |
| 9/9/10 | 15.7 |
| 9/9/10 | 16.5 |
| 9/9/10 | 16.2 |
| 9/9/10 | 16 |
| 9/9/10 | 18.2 |
| 9/9/10 | 17 |
| 9/9/10 | 18.9 |
| 9/9/10 | 19.5 |
| 9/9/10 | 20.9 |
| 9/9/10 | 22.2 |
| 9/9/10 | 21.5 |
| 9/9/10 | 21.9 |
| 9/9/10 | 24.6 |
| 9/9/10 | 22.2 |
| 9/9/10 | 20.3 |
| 9/9/10 | 20.7 |
| 9/9/10 | 18.5 |
| 9/9/10 | 21.6 |
| 9/9/10 | 20.4 |
| 9/9/10 | 21.7 |
| 9/9/10 | 19.1 |
| 9/9/10 | 18.6 |
| 9/9/10 | 19 |
| 9/9/10 | 18 |
| 9/9/10 | 21 |
| 9/9/10 | 19 |
| 9/9/10 | 18.7 |
| 9/9/10 | 18.9 |
| 9/9/10 | 20 |
| 9/9/10 | 18.4 |
| 9/9/10 | 17.9 |
| 9/9/10 | 16.5 |
| 9/9/10 | 16 |
| 9/9/10 | 13.4 |
| 9/9/10 | 14.9 |
| 9/9/10 | 16.2 |
| 9/9/10 | 17.4 |
| 9/9/10 | 16.7 |
| 9/9/10 | 16.5 |
| 9/9/10 | 16.6 |
| 9/9/10 | 17.6 |
| 9/10/10 | 15.6 |
| 9/10/10 | 15.5 |
| 9/10/10 | 17.2 |
| 9/10/10 | 16.6 |
| 9/10/10 | 17 |
| 9/10/10 | 18.7 |
| 9/10/10 | 17 |
| 9/10/10 | 17 |
| 9/10/10 | 17.5 |
| 9/10/10 | 17.2 |
| 9/10/10 | 17.6 |
| 9/10/10 | 17.5 |
| 9/10/10 | 16.6 |
| 9/10/10 | 18.4 |
| 9/10/10 | 17.7 |
| 9/10/10 | 17.3 |
| 9/10/10 | 16.4 |
| 9/10/10 | 18.5 |
| 9/10/10 | 17 |
| 9/10/10 | 16.7 |
| 9/10/10 | 17.3 |
| 9/10/10 | 19.1 |
| 9/10/10 | 21.2 |
| 9/10/10 | 21.1 |
| 9/10/10 | 30.2 |
| 9/10/10 | 28 |
| 9/10/10 | 23.9 |
| 9/10/10 | 27.3 |
| 9/10/10 | 28.1 |
| 9/10/10 | 23 |
| 9/10/10 | 27.2 |
| 9/10/10 | 15.7 |
| 9/10/10 | 17.6 |
| 9/10/10 | 17.4 |
| 9/10/10 | 16.8 |
| 9/10/10 | 14.8 |
| 9/10/10 | 15.4 |
| 9/10/10 | 13.7 |
| 9/10/10 | 14.1 |
| 9/10/10 | 14.8 |
| 9/10/10 | 14.8 |
| 9/10/10 | 13.2 |
| 9/10/10 | 13.4 |
| 9/10/10 | 22.8 |
| 9/10/10 | 10 |
| 9/10/10 | 11.3 |
| 9/10/10 | 13.8 |
| 9/10/10 | 13.6 |
| 9/11/10 | 14.1 |
| 9/11/10 | 16.6 |
| 9/11/10 | 15.6 |
| 9/11/10 | 16.2 |
| 9/11/10 | 16.2 |
| 9/11/10 | 20.1 |
| 9/11/10 | 17.9 |
| 9/11/10 | 20.1 |
| 9/11/10 | 17.5 |
| 9/11/10 | 15.7 |
| 9/11/10 | 18.7 |
| 9/11/10 | 16.7 |
| 9/11/10 | 18.3 |
| 9/11/10 | 20 |
| 9/11/10 | 20.1 |
| 9/11/10 | 21 |
| 9/11/10 | 22.7 |
| 9/11/10 | 23 |
| 9/11/10 | 25.4 |
| 9/11/10 | 23 |
| 9/11/10 | 25.5 |
| 9/11/10 | 25.5 |
| 9/11/10 | 21.9 |
| 9/11/10 | 24.4 |
| 9/11/10 | 21.4 |
| 9/11/10 | 22.8 |
| 9/11/10 | 20.7 |
| 9/11/10 | 21.2 |
| 9/11/10 | 21.1 |
| 9/11/10 | 19.2 |
| 9/11/10 | 20.7 |
| 9/11/10 | 23.8 |
| 9/11/10 | 23.4 |
| 9/11/10 | 17 |
| 9/11/10 | 16.6 |
| 9/11/10 | 22.3 |
| 9/11/10 | 19.4 |
| 9/11/10 | 18.2 |
| 9/11/10 | 18.7 |
| 9/11/10 | 20.3 |
| 9/11/10 | 18.2 |
| 9/11/10 | 19.6 |
| 9/11/10 | 21 |
| 9/11/10 | 21.2 |
| 9/11/10 | 18.6 |
| 9/11/10 | 21.6 |
| 9/11/10 | 22.5 |
| 9/11/10 | 18 |
| 9/12/10 | 17.6 |
| 9/12/10 | 15.2 |
| 9/12/10 | 18.1 |
| 9/12/10 | 15.5 |
| 9/12/10 | 15.9 |
| 9/12/10 | 16.5 |
| 9/12/10 | 17.9 |
| 9/12/10 | 16.9 |
| 9/12/10 | 17.6 |
| 9/12/10 | 18.9 |
| 9/12/10 | 16.3 |
| 9/12/10 | 19.4 |
| 9/12/10 | 16.8 |
| 9/12/10 | 16.5 |
| 9/12/10 | 17.9 |
| 9/12/10 | 19.4 |
| 9/12/10 | 19.9 |
| 9/12/10 | 18.6 |
| 9/12/10 | 23.2 |
| 9/12/10 | 23.2 |
| 9/12/10 | 22.9 |
| 9/12/10 | 22.3 |
| 9/12/10 | 22.5 |
| 9/12/10 | 22.8 |
| 9/12/10 | 20.4 |
| 9/12/10 | 22.4 |
| 9/12/10 | 21.1 |
| 9/12/10 | 39.3 |
| 9/12/10 | 32 |
| 9/12/10 | 21.9 |
| 9/12/10 | 21.5 |
| 9/12/10 | 27.8 |
| 9/12/10 | 28.5 |
| 9/12/10 | 28.5 |
| 9/12/10 | 27.5 |
| 9/12/10 | 31.7 |
| 9/12/10 | 31.1 |
| 9/12/10 | 27.8 |
| 9/12/10 | 27.5 |
| 9/12/10 | 28.5 |
| 9/12/10 | 25.6 |
| 9/12/10 | 26.1 |
| 9/12/10 | 24.4 |
| 9/12/10 | 25.2 |
| 9/12/10 | 24.7 |
| 9/12/10 | 25.5 |
| 9/12/10 | 23.8 |
| 9/12/10 | 24.4 |
| 9/13/10 | 24.7 |
| 9/13/10 | 24.7 |
| 9/13/10 | 26.5 |
| 9/13/10 | 28.4 |
| 9/13/10 | 30.1 |
| 9/13/10 | 27.8 |
| 9/13/10 | 29.5 |
| 9/13/10 | 30 |
| 9/13/10 | 36.7 |
| 9/13/10 | 32.6 |
| 9/13/10 | 31 |
| 9/13/10 | 38.4 |
| 9/13/10 | 31.3 |
| 9/13/10 | 31.3 |
| 9/13/10 | 33.1 |
| 9/13/10 | 33 |
| 9/13/10 | 36.9 |
| 9/13/10 | 39.9 |
| 9/13/10 | 39.3 |
| 9/13/10 | 42.2 |
| 9/13/10 | 43.3 |
| 9/13/10 | 41.5 |
| 9/13/10 | 44.4 |
| 9/13/10 | 45.6 |
| 9/13/10 | 47.3 |
| 9/13/10 | 43.9 |
| 9/13/10 | 40 |
| 9/13/10 | 38.1 |
| 9/13/10 | 37.1 |
| 9/13/10 | 28.7 |
| 9/13/10 | 30 |
| 9/13/10 | 32.2 |
| 9/13/10 | 29.6 |
| 9/13/10 | 37.1 |
| 9/13/10 | 33.8 |
| 9/13/10 | 25 |
| 9/13/10 | 31 |
| 9/13/10 | 24.8 |
| 9/13/10 | 29 |
| 9/13/10 | 28.8 |
| 9/13/10 | 31.4 |
| 9/13/10 | 27.7 |
| 9/13/10 | 31.7 |
| 9/13/10 | 28.7 |
| 9/13/10 | 31.7 |
| 9/13/10 | 29.3 |
| 9/13/10 | 30.8 |
| 9/13/10 | 30.6 |
| 9/14/10 | 32.6 |
| 9/14/10 | 31.1 |
| 9/14/10 | 29.7 |
| 9/14/10 | 32.6 |
| 9/14/10 | 30.4 |
| 9/14/10 | 25.5 |
| 9/14/10 | 26.5 |
| 9/14/10 | 26.1 |
| 9/14/10 | 25.2 |
| 9/14/10 | 25.5 |
| 9/14/10 | 25.8 |
| 9/14/10 | 27.8 |
| 9/14/10 | 27.4 |
| 9/14/10 | 29.5 |
| 9/14/10 | 31.7 |
| 9/14/10 | 35 |
| 9/14/10 | 38.3 |
| 9/14/10 | 41.1 |
| 9/14/10 | 39.8 |
| 9/14/10 | 34.8 |
| 9/14/10 | 36.6 |
| 9/14/10 | 35.7 |
| 9/14/10 | 38.3 |
| 9/14/10 | 42.6 |
| 9/14/10 | 46.7 |
| 9/14/10 | 44.4 |
| 9/14/10 | 47.7 |
| 9/14/10 | 42.8 |
| 9/14/10 | 44 |
| 9/14/10 | 49.1 |
| 9/14/10 | 55.1 |
| 9/14/10 | 53.9 |
| 9/14/10 | 55 |
| 9/14/10 | 58.2 |
| 9/14/10 | 53.7 |
| 9/14/10 | 60.4 |
| 9/14/10 | 61.8 |
| 9/14/10 | 61.6 |
| 9/14/10 | 67.2 |
| 9/14/10 | 52.9 |
| 9/14/10 | 59.1 |
| 9/14/10 | 54.1 |
| 9/14/10 | 57.2 |
| 9/14/10 | 59.2 |
| 9/14/10 | 60.5 |
| 9/14/10 | 62.7 |
| 9/14/10 | 62.3 |
| 9/14/10 | 54.6 |
| 9/15/10 | 60.9 |
| 9/15/10 | 64.6 |
| 9/15/10 | 65 |
| 9/15/10 | 68.4 |
| 9/15/10 | 71.1 |
| 9/15/10 | 66.7 |
| 9/15/10 | 62.4 |
| 9/15/10 | 57.6 |
| 9/15/10 | 68.8 |
| 9/15/10 | 74 |
| 9/15/10 | 66.7 |
| 9/15/10 | 60.5 |
| 9/15/10 | 59.8 |
| 9/15/10 | 60.2 |
| 9/15/10 | 58 |
| 9/15/10 | 65 |
| 9/15/10 | 63.4 |
| 9/15/10 | 56.1 |
| 9/15/10 | 78.2 |
| 9/15/10 | 72.8 |
| 9/15/10 | 76.4 |
| 9/15/10 | 63.6 |
| 9/15/10 | 53.9 |
| 9/15/10 | 63.1 |
| 9/15/10 | 59.6 |
| 9/15/10 | 47.2 |
| 9/15/10 | 45.9 |
| 9/15/10 | 65.9 |
| 9/15/10 | 56.9 |
| 9/15/10 | 52.7 |
| 9/15/10 | 51.5 |
| 9/15/10 | 69.9 |
| 9/15/10 | 55.6 |
| 9/15/10 | 53 |
| 9/15/10 | 66.4 |
| 9/15/10 | 53 |
| 9/15/10 | 25.9 |
| 9/15/10 | 22.9 |
| 9/15/10 | 26.6 |
| 9/15/10 | 24.2 |
| 9/15/10 | 28.2 |
| 9/15/10 | 24.6 |
| 9/15/10 | 30.3 |
| 9/15/10 | 28.5 |
| 9/15/10 | 28.3 |
| 9/15/10 | 28.6 |
| 9/15/10 | 30.1 |
| 9/15/10 | 28.7 |
| 9/16/10 | 28.8 |
| 9/16/10 | 27.2 |
| 9/16/10 | 22 |
| 9/16/10 | 24.5 |
| 9/16/10 | 24.7 |
| 9/16/10 | 19.7 |
| 9/16/10 | 25.6 |
| 9/16/10 | 23.9 |
| 9/16/10 | 23 |
| 9/16/10 | 23 |
| 9/16/10 | 26.8 |
| 9/16/10 | 22.3 |
| 9/16/10 | 25.4 |
| 9/16/10 | 19.4 |
| 9/16/10 | 27.2 |
| 9/16/10 | 18.5 |
| 9/16/10 | 20.9 |
| 9/16/10 | 21.3 |
| 9/16/10 | 23.5 |
| 9/16/10 | 19.9 |
| 9/16/10 | 24.1 |
| 9/16/10 | 24.9 |
| 9/16/10 | 28.9 |
| 9/16/10 | 29.2 |
| 9/16/10 | 34.5 |
| 9/16/10 | 36.1 |
| 9/16/10 | 38.5 |
| 9/16/10 | 36.2 |
| 9/16/10 | 40.4 |
| 9/16/10 | 41.3 |
| 9/16/10 | 32.2 |
| 9/16/10 | 31 |
| 9/16/10 | 31.9 |
| 9/16/10 | 34.5 |
| 9/16/10 | 29.4 |
| 9/16/10 | 29.5 |
| 9/16/10 | 31.5 |
| 9/16/10 | 31.3 |
| 9/16/10 | 31.2 |
| 9/16/10 | 31.1 |
| 9/16/10 | 32.7 |
| 9/16/10 | 32.4 |
| 9/16/10 | 33.3 |
| 9/16/10 | 29.5 |
| 9/16/10 | 33.3 |
| 9/16/10 | 37 |
| 9/16/10 | 34 |
| 9/16/10 | 31 |
| 9/17/10 | 34.7 |
| 9/17/10 | 33.7 |
| 9/17/10 | 32.3 |
| 9/17/10 | 38.1 |
| 9/17/10 | 32.5 |
| 9/17/10 | 31 |
| 9/17/10 | 32.7 |
| 9/17/10 | 30 |
| 9/17/10 | 27.7 |
| 9/17/10 | 27.8 |
| 9/17/10 | 26.5 |
| 9/17/10 | 32.5 |
| 9/17/10 | 27.7 |
| 9/17/10 | 28.2 |
| 9/17/10 | 31.7 |
| 9/17/10 | 31.1 |
| 9/17/10 | 30.9 |
| 9/17/10 | 28.2 |
| 9/17/10 | 29.3 |
| 9/17/10 | 32.2 |
| 9/17/10 | 35.2 |
| 9/17/10 | 35.5 |
| 9/17/10 | 32.4 |
| 9/17/10 | 37.9 |
| 9/17/10 | 31.7 |
| 9/17/10 | 30.3 |
| 9/17/10 | 39.4 |
| 9/17/10 | 33.1 |
| 9/17/10 | 31.4 |
| 9/17/10 | 32.2 |
| 9/17/10 | 37.2 |
| 9/17/10 | 32.3 |
| 9/17/10 | 33 |
| 9/17/10 | 33.5 |
| 9/17/10 | 29.3 |
| 9/17/10 | 28.8 |
| 9/17/10 | 27.4 |
| 9/17/10 | 23.4 |
| 9/17/10 | 25.7 |
| 9/17/10 | 34.5 |
| 9/17/10 | 24.2 |
| 9/17/10 | 25.7 |
| 9/17/10 | 165.8 |
| 9/17/10 | 1433.8 |
| 9/17/10 | 19 |
| 9/17/10 | 17.4 |
| 9/17/10 | 21.5 |
| 9/17/10 | 16.7 |
| 9/18/10 | 18.6 |
| 9/18/10 | 24.5 |
| 9/18/10 | 26.4 |
| 9/18/10 | 21.6 |
| 9/18/10 | 22.1 |
| 9/18/10 | 24 |
| 9/18/10 | 23.9 |
| 9/18/10 | 24 |
| 9/18/10 | 22.5 |
| 9/18/10 | 22 |
| 9/18/10 | 21.6 |
| 9/18/10 | 32.1 |
| 9/18/10 | 20.8 |
| 9/18/10 | 29 |
| 9/18/10 | 26.8 |
| 9/18/10 | 25.2 |
| 9/18/10 | 26.5 |
| 9/18/10 | 23.6 |
| 9/18/10 | 22.3 |
| 9/18/10 | 21.9 |
| 9/18/10 | 20 |
| 9/18/10 | 23.7 |
| 9/18/10 | 23.7 |
| 9/18/10 | 20.7 |
| 9/18/10 | 35.8 |
| 9/18/10 | 21 |
| 9/18/10 | 15.8 |
| 9/18/10 | 31.5 |
| 9/18/10 | 18.8 |
| 9/18/10 | 17.3 |
| 9/18/10 | 17.3 |
| 9/18/10 | 27.4 |
| 9/18/10 | 22.7 |
| 9/18/10 | 18.1 |
| 9/18/10 | 17 |
| 9/18/10 | 16.8 |
| 9/18/10 | 19.1 |
| 9/18/10 | 17.5 |
| 9/18/10 | 16.7 |
| 9/18/10 | 16.5 |
| 9/18/10 | 15.6 |
| 9/18/10 | 21.5 |
| 9/18/10 | 19.7 |
| 9/18/10 | 17.2 |
| 9/18/10 | 17.8 |
| 9/18/10 | 18.9 |
| 9/18/10 | 19.3 |
| 9/18/10 | 21.1 |
| 9/19/10 | 21.6 |
| 9/19/10 | 23.8 |
| 9/19/10 | 26.8 |
| 9/19/10 | 32.2 |
| 9/19/10 | 29.8 |
| 9/19/10 | 29.7 |
| 9/19/10 | 28.3 |
| 9/19/10 | 27.2 |
| 9/19/10 | 24.3 |
| 9/19/10 | 22.4 |
| 9/19/10 | 19.2 |
| 9/19/10 | 19.1 |
| 9/19/10 | 19 |
| 9/19/10 | 19.2 |
| 9/19/10 | 18.9 |
| 9/19/10 | 19.7 |
| 9/19/10 | 18.1 |
| 9/19/10 | 17.5 |
| 9/19/10 | 19.5 |
| 9/19/10 | 14.1 |
| 9/19/10 | 12.5 |
| 9/19/10 | 12.8 |
| 9/19/10 | 15.4 |
| 9/19/10 | 14.2 |
| 9/19/10 | 15.2 |
| 9/19/10 | 16 |
| 9/19/10 | 15.5 |
| 9/19/10 | 16.5 |
| 9/19/10 | 14.6 |
| 9/19/10 | 16.4 |
| 9/19/10 | 15.8 |
| 9/19/10 | 15.2 |
| 9/19/10 | 15.9 |
| 9/19/10 | 16.9 |
| 9/19/10 | 15.8 |
| 9/19/10 | 15.8 |
| 9/19/10 | 14.7 |
| 9/19/10 | 15 |
| 9/19/10 | 14.8 |
| 9/19/10 | 15.1 |
| 9/19/10 | 15.1 |
| 9/19/10 | 14.7 |
| 9/19/10 | 14.8 |
| 9/19/10 | 15.2 |
| 9/19/10 | 14 |
| 9/19/10 | 13.3 |
| 9/19/10 | 14.8 |
| 9/19/10 | 14.4 |
| 9/20/10 | 14.1 |
| 9/20/10 | 12 |
| 9/20/10 | 16.4 |
| 9/20/10 | 17.3 |
| 9/20/10 | 15.6 |
| 9/20/10 | 13.6 |
| 9/20/10 | 13.3 |
| 9/20/10 | 14.7 |
| 9/20/10 | 16.7 |
| 9/20/10 | 14 |
| 9/20/10 | 18.2 |
| 9/20/10 | 19.6 |
| 9/20/10 | 19.9 |
| 9/20/10 | 22.3 |
| 9/20/10 | 22.8 |
| 9/20/10 | 23.9 |
| 9/20/10 | 24.7 |
| 9/20/10 | 31.8 |
| 9/20/10 | 26.9 |
| 9/20/10 | 29.7 |
| 9/20/10 | 29.5 |
| 9/20/10 | 31.4 |
| 9/20/10 | 27.3 |
| 9/20/10 | 28.4 |
| 9/20/10 | 27.6 |
| 9/20/10 | 30.1 |
| 9/20/10 | 40.4 |
| 9/20/10 | 26.8 |
| 9/20/10 | 24.7 |
| 9/20/10 | 22.9 |
| 9/20/10 | 25.2 |
| 9/20/10 | 24.1 |
| 9/20/10 | 31.3 |
| 9/20/10 | 23.3 |
| 9/20/10 | 23.5 |
| 9/20/10 | 28.9 |
| 9/20/10 | 20.6 |
| 9/20/10 | 23.5 |
| 9/20/10 | 19.8 |
| 9/20/10 | 19.6 |
| 9/20/10 | 18.3 |
| 9/20/10 | 18.7 |
| 9/20/10 | 33.4 |
| 9/20/10 | 21.8 |
| 9/20/10 | 26.5 |
| 9/20/10 | 19.6 |
| 9/20/10 | 19.7 |
| 9/20/10 | 18.9 |
| 9/21/10 | 17.6 |
| 9/21/10 | 16.8 |
| 9/21/10 | 20 |
| 9/21/10 | 17.9 |
| 9/21/10 | 19.3 |
| 9/21/10 | 22.4 |
| 9/21/10 | 21.6 |
| 9/21/10 | 25.8 |
| 9/21/10 | 24.4 |
| 9/21/10 | 27.4 |
| 9/21/10 | 31.9 |
| 9/21/10 | 78.2 |
| 9/21/10 | 34.6 |
| 9/21/10 | 30 |
| 9/21/10 | 33.5 |
| 9/21/10 | 36.6 |
| 9/21/10 | 38.9 |
| 9/21/10 | 40 |
| 9/21/10 | 37.4 |
| 9/21/10 | 40.9 |
| 9/21/10 | 36.8 |
| 9/21/10 | 35.1 |
| 9/21/10 | 35.4 |
| 9/21/10 | 34.3 |
| 9/21/10 | 33 |
| 9/21/10 | 30.7 |
| 9/21/10 | 32.4 |
| 9/21/10 | 35.3 |
| 9/21/10 | 35.7 |
| 9/21/10 | 36.5 |
| 9/21/10 | 35 |
| 9/21/10 | 36.4 |
| 9/21/10 | 38.7 |
| 9/21/10 | 38.8 |
| 9/21/10 | 33.3 |
| 9/21/10 | 36.1 |
| 9/21/10 | 30 |
| 9/21/10 | 36.1 |
| 9/21/10 | 39.3 |
| 9/21/10 | 50.9 |
| 9/21/10 | 47.5 |
| 9/21/10 | 48.4 |
| 9/21/10 | 53.1 |
| 9/21/10 | 51.3 |
| 9/21/10 | 49 |
| 9/21/10 | 45.4 |
| 9/21/10 | 37.9 |
| 9/21/10 | 46.6 |
| 9/22/10 | 47.9 |
| 9/22/10 | 33.2 |
| 9/22/10 | 36.5 |
| 9/22/10 | 33.2 |
| 9/22/10 | 32.6 |
| 9/22/10 | 36.1 |
| 9/22/10 | 31 |
| 9/22/10 | 35.8 |
| 9/22/10 | 33.2 |
| 9/22/10 | 35 |
| 9/22/10 | 39.1 |
| 9/22/10 | 26.9 |
| 9/22/10 | 33.4 |
| 9/22/10 | 30.9 |
| 9/22/10 | 32.3 |
| 9/22/10 | 30.5 |
| 9/22/10 | 22.4 |
| 9/22/10 | 28.4 |
| 9/22/10 | 23.9 |
| 9/22/10 | 23.1 |
| 9/22/10 | 23.8 |
| 9/22/10 | 28.5 |
| 9/22/10 | 27.8 |
| 9/22/10 | 22.3 |
| 9/22/10 | 25.6 |
| 9/22/10 | 27.3 |
| 9/22/10 | 30.9 |
| 9/22/10 | 36.3 |
| 9/22/10 | 28.7 |
| 9/22/10 | 32.7 |
| 9/22/10 | 31.2 |
| 9/22/10 | 36.8 |
| 9/22/10 | 30.8 |
| 9/22/10 | 23.7 |
| 9/22/10 | 25.8 |
| 9/22/10 | 35.8 |
| 9/22/10 | 31.8 |
| 9/22/10 | 38.1 |
| 9/22/10 | 37.1 |
| 9/22/10 | 28.6 |
| 9/22/10 | 30.8 |
| 9/22/10 | 30.8 |
| 9/22/10 | 38.3 |
| 9/22/10 | 35.4 |
| 9/22/10 | 39.7 |
| 9/22/10 | 42 |
| 9/22/10 | 47 |
| 9/22/10 | 41.5 |
| 9/23/10 | 35.4 |
| 9/23/10 | 43.6 |
| 9/23/10 | 44.3 |
| 9/23/10 | 32 |
| 9/23/10 | 37.7 |
| 9/23/10 | 34.5 |
| 9/23/10 | 32.5 |
| 9/23/10 | 39.2 |
| 9/23/10 | 38.7 |
| 9/23/10 | 37.5 |
| 9/23/10 | 38.8 |
| 9/23/10 | 37.5 |
| 9/23/10 | 39 |
| 9/23/10 | 37.2 |
| 9/23/10 | 30.6 |
| 9/23/10 | 42.6 |
| 9/23/10 | 32.5 |
| 9/23/10 | 39.5 |
| 9/23/10 | 36.6 |
| 9/23/10 | 32 |
| 9/23/10 | 31.9 |
| 9/23/10 | 42.3 |
| 9/23/10 | 43 |
| 9/23/10 | 36.1 |
| 9/23/10 | 41.8 |
| 9/23/10 | 40.1 |
| 9/23/10 | 39.8 |
| 9/23/10 | 43.5 |
| 9/23/10 | 44.1 |
| 9/23/10 | 43.1 |
| 9/23/10 | 41.2 |
| 9/23/10 | 49.4 |
| 9/23/10 | 51.5 |
| 9/23/10 | 34.1 |
| 9/23/10 | 42.2 |
| 9/23/10 | 41.6 |
| 9/23/10 | 38.3 |
| 9/23/10 | 36.4 |
| 9/23/10 | 37.5 |
| 9/23/10 | 38.6 |
| 9/23/10 | 37.4 |
| 9/23/10 | 46.8 |
| 9/23/10 | 43.8 |
| 9/23/10 | 38.9 |
| 9/23/10 | 45.1 |
| 9/23/10 | 47.9 |
| 9/23/10 | 44.5 |
| 9/23/10 | 42.9 |
| 9/24/10 | 38.3 |
| 9/24/10 | 41.6 |
| 9/24/10 | 47.1 |
| 9/24/10 | 45.9 |
| 9/24/10 | 46.2 |
| 9/24/10 | 48.4 |
| 9/24/10 | 49.2 |
| 9/24/10 | 48.2 |
| 9/24/10 | 50.3 |
| 9/24/10 | 49 |
| 9/24/10 | 46.2 |
| 9/24/10 | 49.3 |
| 9/24/10 | 48.5 |
| 9/24/10 | 50.5 |
| 9/24/10 | 47.6 |
| 9/24/10 | 38 |
| 9/24/10 | 33.9 |
| 9/24/10 | 33 |
| 9/24/10 | 36.4 |
| 9/24/10 | 35.7 |
| 9/24/10 | 31.6 |
| 9/24/10 | 32.3 |
| 9/24/10 | 34.3 |
| 9/24/10 | 30.7 |
| 9/24/10 | 33.4 |
| 9/24/10 | 34.4 |
| 9/24/10 | 39.9 |
| 9/24/10 | 42.1 |
| 9/24/10 | 41.2 |
| 9/24/10 | 40 |
| 9/24/10 | 59.5 |
| 9/24/10 | 63.4 |
| 9/24/10 | 64.1 |
| 9/24/10 | 61.3 |
| 9/24/10 | 76.9 |
| 9/24/10 | 67.4 |
| 9/24/10 | 64 |
| 9/24/10 | 71.5 |
| 9/24/10 | 80.4 |
| 9/24/10 | 81 |
| 9/24/10 | 73.4 |
| 9/24/10 | 75.3 |
| 9/24/10 | 78.8 |
| 9/24/10 | 77.3 |
| 9/24/10 | 82.4 |
| 9/24/10 | 87.8 |
| 9/24/10 | 89.4 |
| 9/24/10 | 81.8 |
| 9/25/10 | 68.4 |
| 9/25/10 | 109.1 |
| 9/25/10 | 98.3 |
| 9/25/10 | 87.1 |
| 9/25/10 | 95.1 |
| 9/25/10 | 106 |
| 9/25/10 | 109.5 |
| 9/25/10 | 107 |
| 9/25/10 | 104.8 |
| 9/25/10 | 109.5 |
| 9/25/10 | 110.7 |
| 9/25/10 | 111 |
| 9/25/10 | 103.7 |
| 9/25/10 | 116.6 |
| 9/25/10 | 89.7 |
| 9/25/10 | 110.1 |
| 9/25/10 | 103.6 |
| 9/25/10 | 94.7 |
| 9/25/10 | 117.5 |
| 9/25/10 | 124.4 |
| 9/25/10 | 114.2 |
| 9/25/10 | 120.7 |
| 9/25/10 | 77.2 |
| 9/25/10 | 120.2 |
| 9/25/10 | 129.6 |
| 9/25/10 | 117.4 |
| 9/25/10 | 145.2 |
| 9/25/10 | 137 |
| 9/25/10 | 161.2 |
| 9/25/10 | 157.2 |
| 9/25/10 | 155 |
| 9/25/10 | 169 |
| 9/25/10 | 180.8 |
| 9/25/10 | 188.5 |
| 9/25/10 | 195.8 |
| 9/25/10 | 156.8 |
| 9/25/10 | 165.2 |
| 9/25/10 | 175.3 |
| 9/25/10 | 156.2 |
| 9/25/10 | 156.7 |
| 9/25/10 | 182.9 |
| 9/25/10 | 139.3 |
| 9/25/10 | 116.1 |
| 9/25/10 | 359.8 |
| 9/25/10 | 137.3 |
| 9/25/10 | 137.3 |
| 9/25/10 | 127.8 |
| 9/25/10 | 124.3 |
| 9/26/10 | 122.9 |
| 9/26/10 | 104.6 |
| 9/26/10 | 159.9 |
| 9/26/10 | 127 |
| 9/26/10 | 132.6 |
| 9/26/10 | 98.2 |
| 9/26/10 | 147.4 |
| 9/26/10 | 165.9 |
| 9/26/10 | 182.3 |
| 9/26/10 | 167.1 |
| 9/26/10 | 161.6 |
| 9/26/10 | 191.4 |
| 9/26/10 | 186.9 |
| 9/26/10 | 184.7 |
| 9/26/10 | 182.1 |
| 9/26/10 | 190.3 |
| 9/26/10 | 215.6 |
| 9/26/10 | 208.4 |
| 9/26/10 | 231.9 |
| 9/26/10 | 217.8 |
| 9/26/10 | 256.5 |
| 9/26/10 | 225.4 |
| 9/26/10 | 199.1 |
| 9/26/10 | 214.9 |
| 9/26/10 | 167.6 |
| 9/26/10 | 276.7 |
| 9/26/10 | 240.5 |
| 9/26/10 | 256.5 |
| 9/26/10 | 246.1 |
| 9/26/10 | 242.7 |
| 9/26/10 | 240.5 |
| 9/26/10 | 258.7 |
| 9/26/10 | 188.8 |
| 9/26/10 | 250.3 |
| 9/26/10 | 195.6 |
| 9/26/10 | 243.1 |
| 9/26/10 | 266.9 |
| 9/26/10 | 272.1 |
| 9/26/10 | 265.3 |
| 9/26/10 | 269.3 |
| 9/26/10 | 259.1 |
| 9/26/10 | 267.6 |
| 9/26/10 | 319.7 |
| 9/26/10 | 303.3 |
| 9/26/10 | 215 |
| 9/26/10 | 286.8 |
| 9/26/10 | 314.8 |
| 9/26/10 | 318.1 |
| 9/27/10 | 306 |
| 9/27/10 | 237.5 |
| 9/27/10 | 323.1 |
| 9/27/10 | 361.1 |
| 9/27/10 | 325.2 |
| 9/27/10 | 233.9 |
| 9/27/10 | 202.4 |
| 9/27/10 | 270.2 |
| 9/27/10 | 371.5 |
| 9/27/10 | 300.4 |
| 9/27/10 | 384.3 |
| 9/27/10 | 340.5 |
| 9/27/10 | 329.7 |
| 9/27/10 | 287.5 |
| 9/27/10 | 302.5 |
| 9/27/10 | 324.4 |
| 9/27/10 | 387.7 |
| 9/27/10 | 400.3 |
| 9/27/10 | 309.3 |
| 9/27/10 | 342.9 |
| 9/27/10 | 352.7 |
| 9/27/10 | 342.8 |
| 9/27/10 | 352.2 |
| 9/27/10 | 349.1 |
| 9/27/10 | 344.6 |
| 9/27/10 | 346 |
| 9/27/10 | 386.1 |
| 9/27/10 | 385.2 |
| 9/27/10 | 368.8 |
| 9/27/10 | 323.9 |
| 9/27/10 | 380.8 |
| 9/27/10 | 337.1 |
| 9/27/10 | 388.7 |
| 9/27/10 | 367.5 |
| 9/27/10 | 374.5 |
| 9/27/10 | 324.4 |
| 9/27/10 | 377 |
| 9/27/10 | 364.8 |
| 9/27/10 | 405.5 |
| 9/27/10 | 366.6 |
| 9/27/10 | 325.8 |
| 9/27/10 | 270.9 |
| 9/27/10 | 272.3 |
| 9/27/10 | 213.7 |
| 9/27/10 | 267.3 |
| 9/27/10 | 298.7 |
| 9/27/10 | 302.5 |
| 9/27/10 | 216.4 |
| 9/28/10 | 196.2 |
| 9/28/10 | 260.5 |
| 9/28/10 | 279.1 |
| 9/28/10 | 232.5 |
| 9/28/10 | 233.5 |
| 9/28/10 | 222.7 |
| 9/28/10 | 231.2 |
| 9/28/10 | 215.6 |
| 9/28/10 | 229.4 |
| 9/28/10 | 225.9 |
| 9/28/10 | 252.9 |
| 9/28/10 | 236.8 |
| 9/28/10 | 149.2 |
| 9/28/10 | 142.8 |
| 9/28/10 | 138.6 |
| 9/28/10 | 144.4 |
| 9/28/10 | 153.5 |
| 9/28/10 | 127.2 |
| 9/28/10 | 141.2 |
| 9/28/10 | 148.5 |
| 9/28/10 | 92.3 |
| 9/28/10 | 89.4 |
| 9/28/10 | 129.2 |
| 9/28/10 | 162.3 |
| 9/28/10 | 154.3 |
| 9/28/10 | 147.6 |
| 9/28/10 | 147.3 |
| 9/28/10 | 142.3 |
| 9/28/10 | 140.9 |
| 9/28/10 | 162.3 |
| 9/28/10 | 158.3 |
| 9/28/10 | 188.7 |
| 9/28/10 | 150.7 |
| 9/28/10 | 166.2 |
| 9/28/10 | 148.3 |
| 9/28/10 | 142.5 |
| 9/28/10 | 145.7 |
| 9/28/10 | 153.3 |
| 9/28/10 | 142 |
| 9/28/10 | 130.5 |
| 9/28/10 | 136.3 |
| 9/28/10 | 134.7 |
| 9/28/10 | 154.5 |
| 9/28/10 | 115.2 |
| 9/28/10 | 149.9 |
| 9/28/10 | 124.9 |
| 9/28/10 | 126.6 |
| 9/28/10 | 136 |
| 9/29/10 | 120.3 |
| 9/29/10 | 168.5 |
| 9/29/10 | 132.1 |
| 9/29/10 | 164.8 |
| 9/29/10 | 92 |
| 9/29/10 | 85.9 |
| 9/29/10 | 91 |
| 9/29/10 | 84.5 |
| 9/29/10 | 92.5 |
| 9/29/10 | 100.2 |
| 9/29/10 | 109.1 |
| 9/29/10 | 113.1 |
| 9/29/10 | 123.1 |
| 9/29/10 | 125 |
| 9/29/10 | 108.9 |
| 9/29/10 | 100.9 |
| 9/29/10 | 134.3 |
| 9/29/10 | 141.3 |
| 9/29/10 | 137.2 |
| 9/29/10 | 131.9 |
| 9/29/10 | 120.9 |
| 9/29/10 | 126.7 |
| 9/29/10 | 148.1 |
| 9/29/10 | 156.1 |
| 9/29/10 | 152 |
| 9/29/10 | 195 |
| 9/29/10 | 136.9 |
| 9/29/10 | 122.8 |
| 9/29/10 | 139.2 |
| 9/29/10 | 163.3 |
| 9/29/10 | 169.8 |
| 9/29/10 | 198 |
| 9/29/10 | 159.2 |
| 9/29/10 | 140.1 |
| 9/29/10 | 163.8 |
| 9/29/10 | 140 |
| 9/29/10 | 152 |
| 9/29/10 | 142.4 |
| 9/29/10 | 162.6 |
| 9/29/10 | 154.4 |
| 9/29/10 | 160.6 |
| 9/29/10 | 159.8 |
| 9/29/10 | 152.3 |
| 9/29/10 | 186.4 |
| 9/29/10 | 167.3 |
| 9/29/10 | 182.4 |
| 9/29/10 | 180.4 |
| 9/29/10 | 184.8 |
| 9/30/10 | 132.5 |
| 9/30/10 | 121.5 |
| 9/30/10 | 163.9 |
| 9/30/10 | 178.3 |
| 9/30/10 | 134.4 |
| 9/30/10 | 164.4 |
| 9/30/10 | 162.7 |
| 9/30/10 | 130.7 |
| 9/30/10 | 135.2 |
| 9/30/10 | 159.2 |
| 9/30/10 | 127.1 |
| 9/30/10 | 147 |
| 9/30/10 | 106.3 |
| 9/30/10 | 13.9 |
| 9/30/10 | 12.3 |
| 9/30/10 | 15.4 |
| 9/30/10 | 39 |
| 9/30/10 | 34.2 |
| 9/30/10 | 40.8 |
| 9/30/10 | 48.3 |
| 9/30/10 | 45.9 |
| 9/30/10 | 46.2 |
| 9/30/10 | 59.7 |
| 9/30/10 | 47.3 |
| 9/30/10 | 63 |
| 9/30/10 | 60.1 |
| 9/30/10 | 49.1 |
| 9/30/10 | 35.8 |
| 9/30/10 | 46.9 |
| 9/30/10 | 49.6 |
| 9/30/10 | 44 |
| 9/30/10 | 52.7 |
| 9/30/10 | 43.1 |
| 9/30/10 | 54.6 |
| 9/30/10 | 40.5 |
| 9/30/10 | 44.8 |
| 9/30/10 | 47.7 |
| 9/30/10 | 78.4 |
| 9/30/10 | 68.6 |
| 9/30/10 | 122.7 |
| 9/30/10 | 106.3 |
| 9/30/10 | 87.7 |
| 9/30/10 | 93.8 |
| 9/30/10 | 91.8 |
| 9/30/10 | 107.1 |
| 9/30/10 | 114.3 |
| 9/30/10 | 90.7 |
| 9/30/10 | 95.1 |
| 10/1/10 | 114.1 |
| 10/1/10 | 88.3 |
| 10/1/10 | 108.5 |
| 10/1/10 | 93.6 |
| 10/1/10 | 112.9 |
| 10/1/10 | 92.5 |
| 10/1/10 | 94.3 |
| 10/1/10 | 89.6 |
| 10/1/10 | 94.9 |
| 10/1/10 | 74 |
| 10/1/10 | 106.8 |
| 10/1/10 | 90.5 |
| 10/1/10 | 105.9 |
| 10/1/10 | 89.3 |
| 10/1/10 | 95.2 |
| 10/1/10 | 84.7 |
| 10/1/10 | 96.5 |
| 10/1/10 | 93.8 |
| 10/1/10 | 113.9 |
| 10/1/10 | 105.7 |
| 10/1/10 | 97.1 |
| 10/1/10 | 87 |
| 10/1/10 | 92.4 |
| 10/1/10 | 101.1 |
| 10/1/10 | 110.8 |
| 10/1/10 | 99.6 |
| 10/1/10 | 93.8 |
| 10/1/10 | 88.7 |
| 10/1/10 | 87.3 |
| 10/1/10 | 86.7 |
| 10/1/10 | 85.3 |
| 10/1/10 | 99.3 |
| 10/1/10 | 92.6 |
| 10/1/10 | 87.7 |
| 10/1/10 | 92.8 |
| 10/1/10 | 90.2 |
| 10/1/10 | 100.6 |
| 10/1/10 | 99 |
| 10/1/10 | 103.4 |
| 10/1/10 | 99 |
| 10/1/10 | 98.6 |
| 10/1/10 | 101.8 |
| 10/1/10 | 99.8 |
| 10/1/10 | 100.5 |
| 10/1/10 | 99.3 |
| 10/1/10 | 96.4 |
| 10/1/10 | 98.5 |
| 10/1/10 | 102.4 |
| 10/2/10 | 101.6 |
| 10/2/10 | 101.3 |
| 10/2/10 | 101.8 |
| 10/2/10 | 101 |
| 10/2/10 | 103.8 |
| 10/2/10 | 105.9 |
| 10/2/10 | 105.8 |
| 10/2/10 | 106.1 |
| 10/2/10 | 109.2 |
| 10/2/10 | 105.8 |
| 10/2/10 | 101.8 |
| 10/2/10 | 102.4 |
| 10/2/10 | 107.5 |
| 10/2/10 | 105.1 |
| 10/2/10 | 108.2 |
| 10/2/10 | 107 |
| 10/2/10 | 110 |
| 10/2/10 | 107.7 |
| 10/2/10 | 113 |
| 10/2/10 | 119 |
| 10/2/10 | 109.7 |
| 10/2/10 | 108.5 |
| 10/2/10 | 118.3 |
| 10/2/10 | 121.6 |
| 10/2/10 | 115.7 |
| 10/2/10 | 112.5 |
| 10/2/10 | 111.4 |
| 10/2/10 | 113.6 |
| 10/2/10 | 115.1 |
| 10/2/10 | 118.6 |
| 10/2/10 | 124.5 |
| 10/2/10 | 120.3 |
| 10/2/10 | 116.2 |
| 10/2/10 | 118.6 |
| 10/2/10 | 121.2 |
| 10/2/10 | 118.4 |
| 10/2/10 | 121.3 |
| 10/2/10 | 129 |
| 10/2/10 | 119.9 |
| 10/2/10 | 117.4 |
| 10/2/10 | 120.6 |
| 10/2/10 | 123.2 |
| 10/2/10 | 118.5 |
| 10/2/10 | 119 |
| 10/2/10 | 117.4 |
| 10/2/10 | 120 |
| 10/2/10 | 121.2 |
| 10/2/10 | 133 |
| 10/3/10 | 123.3 |
| 10/3/10 | 120.3 |
| 10/3/10 | 123.1 |
| 10/3/10 | 139.7 |
| 10/3/10 | 123.2 |
| 10/3/10 | 121.5 |
| 10/3/10 | 126 |
| 10/3/10 | 126.4 |
| 10/3/10 | 125.8 |
| 10/3/10 | 128.1 |
| 10/3/10 | 127.5 |
| 10/3/10 | 123.9 |
| 10/3/10 | 126.6 |
| 10/3/10 | 129.9 |
| 10/3/10 | 129.3 |
| 10/3/10 | 131.6 |
| 10/3/10 | 137.9 |
| 10/3/10 | 135.5 |
| 10/3/10 | 138.6 |
| 10/3/10 | 142.3 |
| 10/3/10 | 148 |
| 10/3/10 | 150.3 |
| 10/3/10 | 145.9 |
| 10/3/10 | 148 |
| 10/3/10 | 165.1 |
| 10/3/10 | 147.4 |
| 10/3/10 | 150.7 |
| 10/3/10 | 130.1 |
| 10/3/10 | 139.4 |
| 10/3/10 | 154 |
| 10/3/10 | 151.4 |
| 10/3/10 | 145.8 |
| 10/3/10 | 146.3 |
| 10/3/10 | 139.5 |
| 10/3/10 | 134.7 |
| 10/3/10 | 137.7 |
| 10/3/10 | 136.8 |
| 10/3/10 | 131.2 |
| 10/3/10 | 134 |
| 10/3/10 | 123 |
| 10/3/10 | 119.2 |
| 10/3/10 | 126.5 |
| 10/3/10 | 113.9 |
| 10/3/10 | 108.8 |
| 10/3/10 | 101.9 |
| 10/3/10 | 102.1 |
| 10/3/10 | 104.3 |
| 10/3/10 | 100.4 |
| 10/4/10 | 103.6 |
| 10/4/10 | 103.7 |
| 10/4/10 | 102.2 |
| 10/4/10 | 98 |
| 10/4/10 | 100.8 |
| 10/4/10 | 99.3 |
| 10/4/10 | 96.5 |
| 10/4/10 | 101.5 |
| 10/4/10 | 101.4 |
| 10/4/10 | 101.2 |
| 10/4/10 | 98.4 |
| 10/4/10 | 102.6 |
| 10/4/10 | 96 |
| 10/4/10 | 69.3 |
| 10/4/10 | 69.4 |
| 10/4/10 | 69.5 |
| 10/4/10 | 67.2 |
| 10/4/10 | 69.9 |
| 10/4/10 | 64.7 |
| 10/4/10 | 68.1 |
| 10/4/10 | 65.7 |
| 10/4/10 | 66.9 |
| 10/4/10 | 65.8 |
| 10/4/10 | 67.1 |
| 10/4/10 | 58.5 |
| 10/4/10 | 66.4 |
| 10/4/10 | 76.2 |
| 10/4/10 | 66.1 |
| 10/4/10 | 77 |
| 10/4/10 | 75.5 |
| 10/4/10 | 65 |
| 10/4/10 | 58.9 |
| 10/4/10 | 57.2 |
| 10/4/10 | 52.7 |
| 10/4/10 | 66.2 |
| 10/4/10 | 63.8 |
| 10/4/10 | 54.1 |
| 10/4/10 | 54.9 |
| 10/4/10 | 53.1 |
| 10/4/10 | 51.3 |
| 10/4/10 | 62.5 |
| 10/4/10 | 54.3 |
| 10/4/10 | 54.3 |
| 10/4/10 | 54.5 |
| 10/4/10 | 52.5 |
| 10/4/10 | 48 |
| 10/4/10 | 47.3 |
| 10/4/10 | 48.1 |
| 10/5/10 | 49.8 |
| 10/5/10 | 52.2 |
| 10/5/10 | 47.4 |
| 10/5/10 | 40.2 |
| 10/5/10 | 43.5 |
| 10/5/10 | 59.4 |
| 10/5/10 | 58.1 |
| 10/5/10 | 46.9 |
| 10/5/10 | 50 |
| 10/5/10 | 56.8 |
| 10/5/10 | 48.2 |
| 10/5/10 | 60.1 |
| 10/5/10 | 57.5 |
| 10/5/10 | 51.3 |
| 10/5/10 | 50.7 |
| 10/5/10 | 66.9 |
| 10/5/10 | 60 |
| 10/5/10 | 67.6 |
| 10/5/10 | 64.1 |
| 10/5/10 | 62 |
| 10/5/10 | 59.8 |
| 10/5/10 | 55.8 |
| 10/5/10 | 43 |
| 10/5/10 | 49.6 |
| 10/5/10 | 61.8 |
| 10/5/10 | 49.6 |
| 10/5/10 | 55 |
| 10/5/10 | 59.1 |
| 10/5/10 | 55.4 |
| 10/5/10 | 57.1 |
| 10/5/10 | 64.3 |
| 10/5/10 | 54.3 |
| 10/5/10 | 56.3 |
| 10/5/10 | 58.2 |
| 10/5/10 | 65.9 |
| 10/5/10 | 70.3 |
| 10/5/10 | 64.4 |
| 10/5/10 | 68 |
| 10/5/10 | 68.7 |
| 10/5/10 | 83 |
| 10/5/10 | 87.8 |
| 10/5/10 | 79 |
| 10/5/10 | 85.2 |
| 10/5/10 | 79.2 |
| 10/5/10 | 83.9 |
| 10/5/10 | 86.6 |
| 10/5/10 | 87.9 |
| 10/5/10 | 93 |
| 10/6/10 | 94.6 |
| 10/6/10 | 88.3 |
| 10/6/10 | 89.5 |
| 10/6/10 | 86.8 |
| 10/6/10 | 83.1 |
| 10/6/10 | 84.5 |
| 10/6/10 | 87.3 |
| 10/6/10 | 88.9 |
| 10/6/10 | 89.5 |
| 10/6/10 | 91.2 |
| 10/6/10 | 95.1 |
| 10/6/10 | 60.5 |
| 10/6/10 | 66.3 |
| 10/6/10 | 66.2 |
| 10/6/10 | 66.1 |
| 10/6/10 | 68.6 |
| 10/6/10 | 70.6 |
| 10/6/10 | 66.8 |
| 10/6/10 | 64.7 |
| 10/6/10 | 64.6 |
| 10/6/10 | 67.9 |
| 10/6/10 | 66.3 |
| 10/6/10 | 74.9 |
| 10/6/10 | 73.6 |
| 10/6/10 | 71.1 |
| 10/6/10 | 69.1 |
| 10/6/10 | 70.4 |
| 10/6/10 | 74.8 |
| 10/6/10 | 72 |
| 10/6/10 | 74.9 |
| 10/6/10 | 77.3 |
| 10/6/10 | 65.5 |
| 10/6/10 | 71.6 |
| 10/6/10 | 69.6 |
| 10/6/10 | 75.8 |
| 10/6/10 | 73.9 |
| 10/6/10 | 72.8 |
| 10/6/10 | 73.5 |
| 10/6/10 | 71.7 |
| 10/6/10 | 71.5 |
| 10/6/10 | 72.5 |
| 10/6/10 | 72.8 |
| 10/6/10 | 73.4 |
| 10/6/10 | 74.7 |
| 10/6/10 | 76.3 |
| 10/6/10 | 149.6 |
| 10/6/10 | 123.2 |
| 10/6/10 | 100.4 |
| 10/7/10 | 100.4 |
| 10/7/10 | 101.7 |
| 10/7/10 | 92.5 |
| 10/7/10 | 99.7 |
| 10/7/10 | 111.7 |
| 10/7/10 | 94.1 |
| 10/7/10 | 100.2 |
| 10/7/10 | 90.5 |
| 10/7/10 | 102.1 |
| 10/7/10 | 93.4 |
| 10/7/10 | 91.1 |
| 10/7/10 | 82.1 |
| 10/7/10 | 83.3 |
| 10/7/10 | 69 |
| 10/7/10 | 81.3 |
| 10/7/10 | 78 |
| 10/7/10 | 77.6 |
| 10/7/10 | 74.5 |
| 10/7/10 | 73.2 |
| 10/7/10 | 75.7 |
| 10/7/10 | 76.6 |
| 10/7/10 | 79.1 |
| 10/7/10 | 75.9 |
| 10/7/10 | 77.6 |
| 10/7/10 | 89.8 |
| 10/7/10 | 88.2 |
| 10/7/10 | 82.2 |
| 10/7/10 | 86.9 |
| 10/7/10 | 90.6 |
| 10/7/10 | 79.3 |
| 10/7/10 | 86.8 |
| 10/7/10 | 82.4 |
| 10/7/10 | 86.6 |
| 10/7/10 | 73.1 |
| 10/7/10 | 78.4 |
| 10/7/10 | 95.4 |
| 10/7/10 | 66.7 |
| 10/7/10 | 73.5 |
| 10/7/10 | 83.9 |
| 10/7/10 | 74.6 |
| 10/7/10 | 79.5 |
| 10/7/10 | 67.1 |
| 10/7/10 | 82.1 |
| 10/7/10 | 77.7 |
| 10/7/10 | 103.4 |
| 10/7/10 | 73.5 |
| 10/7/10 | 85.4 |
| 10/7/10 | 98.2 |
| 10/8/10 | 94.7 |
| 10/8/10 | 85.2 |
| 10/8/10 | 88.3 |
| 10/8/10 | 98.1 |
| 10/8/10 | 97.5 |
| 10/8/10 | 98.9 |
| 10/8/10 | 100.7 |
| 10/8/10 | 107.2 |
| 10/8/10 | 89.4 |
| 10/8/10 | 107 |
| 10/8/10 | 85.5 |
| 10/8/10 | 95.9 |
| 10/8/10 | 101.9 |
| 10/8/10 | 111.2 |
| 10/8/10 | 105 |
| 10/8/10 | 111.1 |
| 10/8/10 | 89.8 |
| 10/8/10 | 85.9 |
| 10/8/10 | 99.5 |
| 10/8/10 | 103.3 |
| 10/8/10 | 78.9 |
| 10/8/10 | 92.9 |
| 10/8/10 | 91.3 |
| 10/8/10 | 95.6 |
| 10/8/10 | 95.9 |
| 10/8/10 | 89.6 |
| 10/8/10 | 89.1 |
| 10/8/10 | 84 |
| 10/8/10 | 89.3 |
| 10/8/10 | 103.9 |
| 10/8/10 | 88.6 |
| 10/8/10 | 84.8 |
| 10/8/10 | 110.7 |
| 10/8/10 | 106.7 |
| 10/8/10 | 84.1 |
| 10/8/10 | 90.2 |
| 10/8/10 | 78 |
| 10/8/10 | 80.3 |
| 10/8/10 | 88 |
| 10/8/10 | 90.1 |
| 10/8/10 | 89.7 |
| 10/8/10 | 89.6 |
| 10/8/10 | 82.5 |
| 10/8/10 | 100.2 |
| 10/8/10 | 76.2 |
| 10/8/10 | 86 |
| 10/8/10 | 51.5 |
| 10/8/10 | 58.1 |
| 10/9/10 | 54.2 |
| 10/9/10 | 46.9 |
| 10/9/10 | 61.8 |
| 10/9/10 | 53.5 |
| 10/9/10 | 50.7 |
| 10/9/10 | 61.4 |
| 10/9/10 | 62 |
| 10/9/10 | 53.6 |
| 10/9/10 | 57.7 |
| 10/9/10 | 58.2 |
| 10/9/10 | 57.6 |
| 10/9/10 | 45.2 |
| 10/9/10 | 62.3 |
| 10/9/10 | 73.5 |
| 10/9/10 | 62 |
| 10/9/10 | 60.7 |
| 10/9/10 | 66.8 |
| 10/9/10 | 64 |
| 10/9/10 | 60.8 |
| 10/9/10 | 61 |
| 10/9/10 | 67.9 |
| 10/9/10 | 66.2 |
| 10/9/10 | 66.5 |
| 10/9/10 | 66.2 |
| 10/9/10 | 67.9 |
| 10/9/10 | 63.2 |
| 10/9/10 | 68.8 |
| 10/9/10 | 77.5 |
| 10/9/10 | 75.7 |
| 10/9/10 | 68.4 |
| 10/9/10 | 77.8 |
| 10/9/10 | 83.2 |
| 10/9/10 | 81 |
| 10/9/10 | 92 |
| 10/9/10 | 82.9 |
| 10/9/10 | 83.7 |
| 10/9/10 | 82.1 |
| 10/9/10 | 75.7 |
| 10/9/10 | 78 |
| 10/9/10 | 74.8 |
| 10/9/10 | 70.6 |
| 10/9/10 | 69.9 |
| 10/9/10 | 81.6 |
| 10/9/10 | 99.2 |
| 10/9/10 | 70.5 |
| 10/9/10 | 73.8 |
| 10/9/10 | 72.3 |
| 10/9/10 | 69.3 |
| 10/10/10 | 85.5 |
| 10/10/10 | 63.6 |
| 10/10/10 | 66.2 |
| 10/10/10 | 49.6 |
| 10/10/10 | 60.4 |
| 10/10/10 | 60.3 |
| 10/10/10 | 63.5 |
| 10/10/10 | 50.7 |
| 10/10/10 | 60.1 |
| 10/10/10 | 82.8 |
| 10/10/10 | 42.9 |
| 10/10/10 | 47.7 |
| 10/10/10 | 85.7 |
| 10/10/10 | 91.9 |
| 10/10/10 | 69.2 |
| 10/10/10 | 58.9 |
| 10/10/10 | 67.4 |
| 10/10/10 | 111.5 |
| 10/10/10 | 83.2 |
| 10/10/10 | 52.7 |
| 10/10/10 | 51.6 |
| 10/10/10 | 146.1 |
| 10/10/10 | 150.5 |
| 10/10/10 | 75.7 |
| 10/10/10 | 103.4 |
| 10/10/10 | 121.7 |
| 10/10/10 | 118.9 |
| 10/10/10 | 64.3 |
| 10/10/10 | 110.7 |
| 10/10/10 | 107.1 |
| 10/10/10 | 108 |
| 10/10/10 | 111.7 |
| 10/10/10 | 104.1 |
| 10/10/10 | 86 |
| 10/10/10 | 64.8 |
| 10/10/10 | 95.3 |
| 10/10/10 | 67.3 |
| 10/10/10 | 81.4 |
| 10/10/10 | 78.2 |
| 10/10/10 | 74.5 |
| 10/10/10 | 64.3 |
| 10/10/10 | 80.6 |
| 10/10/10 | 87.9 |
| 10/10/10 | 58.3 |
| 10/10/10 | 59.8 |
| 10/10/10 | 70.7 |
| 10/10/10 | 83.9 |
| 10/10/10 | 70.6 |
| 10/11/10 | 65.8 |
| 10/11/10 | 77.8 |
| 10/11/10 | 67.5 |
| 10/11/10 | 45.7 |
| 10/11/10 | 53.3 |
| 10/11/10 | 81.7 |
| 10/11/10 | 52.7 |
| 10/11/10 | 71.1 |
| 10/11/10 | 70.9 |
| 10/11/10 | 64.7 |
| 10/11/10 | 54.7 |
| 10/11/10 | 77.2 |
| 10/11/10 | 73.7 |
| 10/11/10 | 55.3 |
| 10/11/10 | 67.9 |
| 10/11/10 | 76.3 |
| 10/11/10 | 104.6 |
| 10/11/10 | 70 |
| 10/11/10 | 60.5 |
| 10/11/10 | 74.6 |
| 10/11/10 | 70.9 |
| 10/11/10 | 71.5 |
| 10/11/10 | 66.2 |
| 10/11/10 | 96.3 |
| 10/11/10 | 86.4 |
| 10/11/10 | 57.7 |
| 10/11/10 | 101.9 |
| 10/11/10 | 110.4 |
| 10/11/10 | 101.7 |
| 10/11/10 | 110.1 |
| 10/11/10 | 57.2 |
| 10/11/10 | 111.7 |
| 10/11/10 | 78.3 |
| 10/11/10 | 73.1 |
| 10/11/10 | 51.8 |
| 10/11/10 | 98.7 |
| 10/11/10 | 82 |
| 10/11/10 | 46.1 |
| 10/11/10 | 43.6 |
| 10/11/10 | 75.1 |
| 10/11/10 | 47.1 |
| 10/11/10 | 64 |
| 10/11/10 | 52.8 |
| 10/11/10 | 43.6 |
| 10/11/10 | 52.9 |
| 10/11/10 | 50.5 |
| 10/11/10 | 66.8 |
| 10/11/10 | 38.7 |
| 10/12/10 | 50.3 |
| 10/12/10 | 40 |
| 10/12/10 | 64.2 |
| 10/12/10 | 42.6 |
| 10/12/10 | 41.2 |
| 10/12/10 | 29.2 |
| 10/12/10 | 65.1 |
| 10/12/10 | 52.3 |
| 10/12/10 | 40.3 |
| 10/12/10 | 36.1 |
| 10/12/10 | 40.4 |
| 10/12/10 | 36.9 |
| 10/12/10 | 50.3 |
| 10/12/10 | 56.5 |
| 10/12/10 | 44.7 |
| 10/12/10 | 36.9 |
| 10/12/10 | 41.4 |
| 10/12/10 | 66.4 |
| 10/12/10 | 44.2 |
| 10/12/10 | 41.1 |
| 10/12/10 | 43.6 |
| 10/12/10 | 45 |
| 10/12/10 | 40.7 |
| 10/12/10 | 66.7 |
| 10/12/10 | 69.9 |
| 10/12/10 | 55.4 |
| 10/12/10 | 72.8 |
| 10/12/10 | 53.8 |
| 10/12/10 | 67.3 |
| 10/12/10 | 54 |
| 10/12/10 | 54.7 |
| 10/12/10 | 57.8 |
| 10/12/10 | 50.7 |
| 10/12/10 | 57.1 |
| 10/12/10 | 59.8 |
| 10/12/10 | 48.9 |
| 10/12/10 | 46.8 |
| 10/12/10 | 51.8 |
| 10/12/10 | 60.8 |
| 10/12/10 | 40.7 |
| 10/12/10 | 35.3 |
| 10/12/10 | 56.7 |
| 10/12/10 | 32.6 |
| 10/12/10 | 27.4 |
| 10/12/10 | 38.6 |
| 10/12/10 | 38.9 |
| 10/12/10 | 40.1 |
| 10/12/10 | 39.8 |
| 10/13/10 | 45.3 |
| 10/13/10 | 38 |
| 10/13/10 | 40.1 |
| 10/13/10 | 42.7 |
| 10/13/10 | 41.5 |
| 10/13/10 | 46.7 |
| 10/13/10 | 36.6 |
| 10/13/10 | 36.7 |
| 10/13/10 | 71.3 |
| 10/13/10 | 37.7 |
| 10/13/10 | 73 |
| 10/13/10 | 35 |
| 10/13/10 | 94.7 |
| 10/13/10 | 71 |
| 10/13/10 | 35.5 |
| 10/13/10 | 82.4 |
| 10/13/10 | 46.1 |
| 10/13/10 | 61.4 |
| 10/13/10 | 61.9 |
| 10/13/10 | 60.5 |
| 10/13/10 | 63.7 |
| 10/13/10 | 57.9 |
| 10/13/10 | 45.3 |
| 10/13/10 | 83.2 |
| 10/13/10 | 46.9 |
| 10/13/10 | 79.6 |
| 10/13/10 | 49.5 |
| 10/13/10 | 57.4 |
| 10/13/10 | 69.5 |
| 10/13/10 | 62.7 |
| 10/13/10 | 81.1 |
| 10/13/10 | 73.2 |
| 10/13/10 | 69.9 |
| 10/13/10 | 54 |
| 10/13/10 | 47.1 |
| 10/13/10 | 41.1 |
| 10/13/10 | 56.2 |
| 10/13/10 | 76.9 |
| 10/13/10 | 95.6 |
| 10/13/10 | 70.9 |
| 10/13/10 | 64.1 |
| 10/13/10 | 64.7 |
| 10/13/10 | 83.2 |
| 10/13/10 | 69 |
| 10/13/10 | 54.4 |
| 10/13/10 | 57.8 |
| 10/13/10 | 36.5 |
| 10/13/10 | 57.9 |
| 10/14/10 | 52.2 |
| 10/14/10 | 55.9 |
| 10/14/10 | 42.1 |
| 10/14/10 | 77.6 |
| 10/14/10 | 60.1 |
| 10/14/10 | 72 |
| 10/14/10 | 64.4 |
| 10/14/10 | 81.3 |
| 10/14/10 | 58.1 |
| 10/14/10 | 81.5 |
| 10/14/10 | 60.3 |
| 10/14/10 | 50.4 |
| 10/14/10 | 59.7 |
| 10/14/10 | 91.6 |
| 10/14/10 | 94.1 |
| 10/14/10 | 119.7 |
| 10/14/10 | 110.8 |
| 10/14/10 | 98.7 |
| 10/14/10 | 110.9 |
| 10/14/10 | 82.2 |
| 10/14/10 | 89.7 |
| 10/14/10 | 88.5 |
| 10/14/10 | 85 |
| 10/14/10 | 71.3 |
| 10/14/10 | 74.9 |
| 10/14/10 | 77.8 |
| 10/14/10 | 95.3 |
| 10/14/10 | 65.2 |
| 10/14/10 | 44.5 |
| 10/14/10 | 57 |
| 10/14/10 | 43.7 |
| 10/14/10 | 43.6 |
| 10/14/10 | 47.3 |
| 10/14/10 | 32.8 |
| 10/14/10 | 47.3 |
| 10/14/10 | 36.8 |
| 10/14/10 | 33.7 |
| 10/14/10 | 67.7 |
| 10/14/10 | 39.8 |
| 10/14/10 | 31.8 |
| 10/14/10 | 53.3 |
| 10/14/10 | 52 |
| 10/14/10 | 47.2 |
| 10/14/10 | 50.4 |
| 10/14/10 | 31.5 |
| 10/14/10 | 35.4 |
| 10/14/10 | 33.7 |
| 10/14/10 | 27 |
| 10/15/10 | 39.3 |
| 10/15/10 | 39.9 |
| 10/15/10 | 40 |
| 10/15/10 | 49.6 |
| 10/15/10 | 34 |
| 10/15/10 | 32.4 |
| 10/15/10 | 51.8 |
| 10/15/10 | 33.9 |
| 10/15/10 | 33.6 |
| 10/15/10 | 49 |
| 10/15/10 | 36.4 |
| 10/15/10 | 39.5 |
| 10/15/10 | 48.3 |
| 10/15/10 | 35.1 |
| 10/15/10 | 38.9 |
| 10/15/10 | 44.2 |
| 10/15/10 | 38.1 |
| 10/15/10 | 44.8 |
| 10/15/10 | 38 |
| 10/15/10 | 34.8 |
| 10/15/10 | 73 |
| 10/15/10 | 48.6 |
| 10/15/10 | 35.4 |
| 10/15/10 | 43.1 |
| 10/15/10 | 45.5 |
| 10/15/10 | 39.6 |
| 10/15/10 | 32.1 |
| 10/15/10 | 43 |
| 10/15/10 | 25.3 |
| 10/15/10 | 59.9 |
| 10/15/10 | 23.3 |
| 10/15/10 | 28.3 |
| 10/15/10 | 35 |
| 10/15/10 | 34.3 |
| 10/15/10 | 41.3 |
| 10/15/10 | 30.2 |
| 10/15/10 | 29.8 |
| 10/15/10 | 22.7 |
| 10/15/10 | 51.9 |
| 10/15/10 | 42.6 |
| 10/15/10 | 21.4 |
| 10/15/10 | 23.8 |
| 10/15/10 | 32 |
| 10/15/10 | 41.8 |
| 10/15/10 | 22.2 |
| 10/15/10 | 33.5 |
| 10/15/10 | 21 |
| 10/15/10 | 22.3 |
| 10/16/10 | 20 |
| 10/16/10 | 29.9 |
| 10/16/10 | 20.6 |
| 10/16/10 | 23.4 |
| 10/16/10 | 24.6 |
| 10/16/10 | 20.1 |
| 10/16/10 | 22.4 |
| 10/16/10 | 28.8 |
| 10/16/10 | 29.5 |
| 10/16/10 | 27.2 |
| 10/16/10 | 26.7 |
| 10/16/10 | 29.8 |
| 10/16/10 | 25.5 |
| 10/16/10 | 54.6 |
| 10/16/10 | 25 |
| 10/16/10 | 37.5 |
| 10/16/10 | 39.6 |
| 10/16/10 | 25.7 |
| 10/16/10 | 38.2 |
| 10/16/10 | 43.7 |
| 10/16/10 | 44.8 |
| 10/16/10 | 33.1 |
| 10/16/10 | 38.4 |
| 10/16/10 | 57.6 |
| 10/16/10 | 42 |
| 10/16/10 | 56.3 |
| 10/16/10 | 45.4 |
| 10/16/10 | 44.1 |
| 10/16/10 | 27.9 |
| 10/16/10 | 44.5 |
| 10/16/10 | 41.6 |
| 10/16/10 | 39.6 |
| 10/16/10 | 44.2 |
| 10/16/10 | 33.4 |
| 10/16/10 | 41.4 |
| 10/16/10 | 35.7 |
| 10/16/10 | 44 |
| 10/16/10 | 39.7 |
| 10/16/10 | 32.7 |
| 10/16/10 | 47.9 |
| 10/16/10 | 53.7 |
| 10/16/10 | 58.7 |
| 10/16/10 | 49.3 |
| 10/16/10 | 33 |
| 10/16/10 | 37.5 |
| 10/16/10 | 47.6 |
| 10/16/10 | 30.6 |
| 10/16/10 | 49.9 |
| 10/17/10 | 41.1 |
| 10/17/10 | 43.1 |
| 10/17/10 | 40.4 |
| 10/17/10 | 46.1 |
| 10/17/10 | 44.6 |
| 10/17/10 | 48.3 |
| 10/17/10 | 41.4 |
| 10/17/10 | 31.8 |
| 10/17/10 | 43.7 |
| 10/17/10 | 51.3 |
| 10/17/10 | 35.5 |
| 10/17/10 | 43.2 |
| 10/17/10 | 63.3 |
| 10/17/10 | 67.3 |
| 10/17/10 | 53.5 |
| 10/17/10 | 38.8 |
| 10/17/10 | 80 |
| 10/17/10 | 37.3 |
| 10/17/10 | 49.8 |
| 10/17/10 | 67.6 |
| 10/17/10 | 63.8 |
| 10/17/10 | 60.4 |
| 10/17/10 | 46 |
| 10/17/10 | 44.2 |
| 10/17/10 | 75.5 |
| 10/17/10 | 81 |
| 10/17/10 | 56.1 |
| 10/17/10 | 51.1 |
| 10/17/10 | 53.5 |
| 10/17/10 | 37.2 |
| 10/17/10 | 42.2 |
| 10/17/10 | 61.4 |
| 10/17/10 | 49.1 |
| 10/17/10 | 51.5 |
| 10/17/10 | 53.4 |
| 10/17/10 | 32.3 |
| 10/17/10 | 36.5 |
| 10/17/10 | 56.3 |
| 10/17/10 | 37.3 |
| 10/17/10 | 33.7 |
| 10/17/10 | 67.4 |
| 10/17/10 | 31 |
| 10/17/10 | 63.8 |
| 10/17/10 | 46.9 |
| 10/17/10 | 41.9 |
| 10/17/10 | 40 |
| 10/17/10 | 39.9 |
| 10/17/10 | 38.6 |
| 10/18/10 | 46 |
| 10/18/10 | 45.5 |
| 10/18/10 | 41.5 |
| 10/18/10 | 38.5 |
| 10/18/10 | 43.4 |
| 10/18/10 | 60.1 |
| 10/18/10 | 32.7 |
| 10/18/10 | 46.8 |
| 10/18/10 | 42.8 |
| 10/18/10 | 41.2 |
| 10/18/10 | 39.5 |
| 10/18/10 | 46.8 |
| 10/18/10 | 41.9 |
| 10/18/10 | 53.3 |
| 10/18/10 | 42.4 |
| 10/18/10 | 39.5 |
| 10/18/10 | 37.4 |
| 10/18/10 | 36.2 |
| 10/18/10 | 44.6 |
| 10/18/10 | 54.5 |
| 10/18/10 | 37.6 |
| 10/18/10 | 45.6 |
| 10/18/10 | 48.6 |
| 10/18/10 | 42 |
| 10/18/10 | 38.1 |
| 10/18/10 | 50 |
| 10/18/10 | 45.4 |
| 10/18/10 | 81.1 |
| 10/18/10 | 42.6 |
| 10/18/10 | 44.7 |
| 10/18/10 | 42.3 |
| 10/18/10 | 58.4 |
| 10/18/10 | 58.7 |
| 10/18/10 | 65.8 |
| 10/18/10 | 55.1 |
| 10/18/10 | 41.1 |
| 10/18/10 | 53.9 |
| 10/18/10 | 73 |
| 10/18/10 | 52.8 |
| 10/18/10 | 42.7 |
| 10/18/10 | 41.9 |
| 10/18/10 | 42.9 |
| 10/18/10 | 36.6 |
| 10/18/10 | 34.9 |
| 10/18/10 | 43.9 |
| 10/18/10 | 38.1 |
| 10/18/10 | 44.2 |
| 10/18/10 | 37.6 |
| 10/19/10 | 59.5 |
| 10/19/10 | 42.7 |
| 10/19/10 | 40.7 |
| 10/19/10 | 34.2 |
| 10/19/10 | 38 |
| 10/19/10 | 58.8 |
| 10/19/10 | 55.7 |
| 10/19/10 | 45.3 |
| 10/19/10 | 41.5 |
| 10/19/10 | 43.3 |
| 10/19/10 | 46.6 |
| 10/19/10 | 37.4 |
| 10/19/10 | 26 |
| 10/19/10 | 44.3 |
| 10/19/10 | 46.5 |
| 10/19/10 | 46.2 |
| 10/19/10 | 49.3 |
| 10/19/10 | 45.1 |
| 10/19/10 | 40.4 |
| 10/19/10 | 36.5 |
| 10/19/10 | 38.4 |
| 10/19/10 | 49 |
| 10/19/10 | 48.1 |
| 10/19/10 | 38.6 |
| 10/19/10 | 54.4 |
| 10/19/10 | 64.1 |
| 10/19/10 | 45.3 |
| 10/19/10 | 55.7 |
| 10/19/10 | 38.6 |
| 10/19/10 | 55 |
| 10/19/10 | 55.9 |
| 10/19/10 | 37.2 |
| 10/19/10 | 63.4 |
| 10/19/10 | 62.2 |
| 10/19/10 | 41.5 |
| 10/19/10 | 70.3 |
| 10/19/10 | 38.1 |
| 10/19/10 | 55.4 |
| 10/19/10 | 39.2 |
| 10/19/10 | 46 |
| 10/19/10 | 51.7 |
| 10/19/10 | 43.2 |
| 10/19/10 | 57.6 |
| 10/19/10 | 76.8 |
| 10/19/10 | 45.6 |
| 10/19/10 | 49.8 |
| 10/19/10 | 50.7 |
| 10/19/10 | 56 |
| 10/20/10 | 55.1 |
| 10/20/10 | 48 |
| 10/20/10 | 65.3 |
| 10/20/10 | 51.5 |
| 10/20/10 | 68.8 |
| 10/20/10 | 43.2 |
| 10/20/10 | 66.5 |
| 10/20/10 | 60.2 |
| 10/20/10 | 71.2 |
| 10/20/10 | 72.9 |
| 10/20/10 | 73.9 |
| 10/20/10 | 86.5 |
| 10/20/10 | 53.9 |
| 10/20/10 | 52.9 |
| 10/20/10 | 66.4 |
| 10/20/10 | 37.2 |
| 10/20/10 | 34.8 |
| 10/20/10 | 41.8 |
| 10/20/10 | 70.9 |
| 10/20/10 | 36.5 |
| 10/20/10 | 45.2 |
| 10/20/10 | 39.5 |
| 10/20/10 | 39.1 |
| 10/20/10 | 89.5 |
| 10/20/10 | 65.7 |
| 10/20/10 | 59 |
| 10/20/10 | 56.7 |
| 10/20/10 | 59.3 |
| 10/20/10 | 43.7 |
| 10/20/10 | 52.4 |
| 10/20/10 | 92.2 |
| 10/20/10 | 69.9 |
| 10/20/10 | 50.7 |
| 10/20/10 | 75.5 |
| 10/20/10 | 83.8 |
| 10/20/10 | 97.4 |
| 10/20/10 | 109 |
| 10/20/10 | 63.8 |
| 10/20/10 | 112.8 |
| 10/20/10 | 50.7 |
| 10/20/10 | 49.9 |
| 10/20/10 | 66.6 |
| 10/20/10 | 87.3 |
| 10/20/10 | 105 |
| 10/20/10 | 87.9 |
| 10/20/10 | 60.9 |
| 10/20/10 | 47.3 |
| 10/20/10 | 92.4 |
| 10/21/10 | 49.6 |
| 10/21/10 | 102.1 |
| 10/21/10 | 53.1 |
| 10/21/10 | 67.9 |
| 10/21/10 | 119.2 |
| 10/21/10 | 105.8 |
| 10/21/10 | 78.9 |
| 10/21/10 | 104.2 |
| 10/21/10 | 70.9 |
| 10/21/10 | 109.3 |
| 10/21/10 | 94.8 |
| 10/21/10 | 65.1 |
| 10/21/10 | 108.4 |
| 10/21/10 | 65.9 |
| 10/21/10 | 62.1 |
| 10/21/10 | 69.1 |
| 10/21/10 | 65.8 |
| 10/21/10 | 62.9 |
| 10/21/10 | 114.4 |
| 10/21/10 | 85.2 |
| 10/21/10 | 105.5 |
| 10/21/10 | 43 |
| 10/21/10 | 61.5 |
| 10/21/10 | 93.7 |
| 10/21/10 | 94.3 |
| 10/21/10 | 109.8 |
| 10/21/10 | 130.9 |
| 10/21/10 | 70.8 |
| 10/21/10 | 110.9 |
| 10/21/10 | 77.6 |
| 10/21/10 | 71.8 |
| 10/21/10 | 111 |
| 10/21/10 | 64.8 |
| 10/21/10 | 88.3 |
| 10/21/10 | 80.2 |
| 10/21/10 | 110.1 |
| 10/21/10 | 147.6 |
| 10/21/10 | 75 |
| 10/21/10 | 88.7 |
| 10/21/10 | 125.1 |
| 10/21/10 | 100.3 |
| 10/21/10 | 100 |
| 10/21/10 | 111.6 |
| 10/21/10 | 144.8 |
| 10/21/10 | 76.7 |
| 10/21/10 | 78.8 |
| 10/21/10 | 76.7 |
| 10/21/10 | 78.5 |
| 10/22/10 | 81.6 |
| 10/22/10 | 128.9 |
| 10/22/10 | 99.8 |
| 10/22/10 | 91.2 |
| 10/22/10 | 117.2 |
| 10/22/10 | 123.2 |
| 10/22/10 | 110 |
| 10/22/10 | 132.3 |
| 10/22/10 | 126.5 |
| 10/22/10 | 118.2 |
| 10/22/10 | 92.5 |
| 10/22/10 | 118.9 |
| 10/22/10 | 94.9 |
| 10/22/10 | 85 |
| 10/22/10 | 117.7 |
| 10/22/10 | 85.8 |
| 10/22/10 | 136.9 |
| 10/22/10 | 149.4 |
| 10/22/10 | 115.1 |
| 10/22/10 | 113.6 |
| 10/22/10 | 133.3 |
| 10/22/10 | 141.8 |
| 10/22/10 | 123.4 |
| 10/22/10 | 90.7 |
| 10/22/10 | 138.8 |
| 10/22/10 | 131.1 |
| 10/22/10 | 119.8 |
| 10/22/10 | 68.5 |
| 10/22/10 | 140.1 |
| 10/22/10 | 143.2 |
| 10/22/10 | 127.4 |
| 10/22/10 | 145.6 |
| 10/22/10 | 130.4 |
| 10/22/10 | 136.2 |
| 10/22/10 | 156.2 |
| 10/22/10 | 159.7 |
| 10/22/10 | 136.2 |
| 10/22/10 | 87.8 |
| 10/22/10 | 85.8 |
| 10/22/10 | 92.7 |
| 10/22/10 | 198.1 |
| 10/22/10 | 142.5 |
| 10/22/10 | 130.9 |
| 10/22/10 | 139.8 |
| 10/22/10 | 141 |
| 10/22/10 | 90.7 |
| 10/22/10 | 164.6 |
| 10/22/10 | 134.4 |
| 10/23/10 | 172.1 |
| 10/23/10 | 185.2 |
| 10/23/10 | 73 |
| 10/23/10 | 189.6 |
| 10/23/10 | 161.3 |
| 10/23/10 | 194.2 |
| 10/23/10 | 68 |
| 10/23/10 | 168.9 |
| 10/23/10 | 55.8 |
| 10/23/10 | 90.4 |
| 10/23/10 | 142.7 |
| 10/23/10 | 104.7 |
| 10/23/10 | 89.1 |
| 10/23/10 | 67.8 |
| 10/23/10 | 95.5 |
| 10/23/10 | 79.3 |
| 10/23/10 | 86.5 |
| 10/23/10 | 105.4 |
| 10/23/10 | 76.3 |
| 10/23/10 | 82.2 |
| 10/23/10 | 60 |
| 10/23/10 | 70.4 |
| 10/23/10 | 121.4 |
| 10/23/10 | 120.8 |
| 10/23/10 | 72.1 |
| 10/23/10 | 87.5 |
| 10/23/10 | 107.4 |
| 10/23/10 | 102.7 |
| 10/23/10 | 116.9 |
| 10/23/10 | 133.9 |
| 10/23/10 | 160.4 |
| 10/23/10 | 97.5 |
| 10/23/10 | 117 |
| 10/23/10 | 146.2 |
| 10/23/10 | 100.8 |
| 10/23/10 | 133.1 |
| 10/23/10 | 139.1 |
| 10/23/10 | 148.1 |
| 10/23/10 | 84.2 |
| 10/23/10 | 110.2 |
| 10/23/10 | 157.5 |
| 10/23/10 | 119.6 |
| 10/23/10 | 125.3 |
| 10/23/10 | 132.2 |
| 10/23/10 | 127.2 |
| 10/23/10 | 81.1 |
| 10/23/10 | 121.1 |
| 10/23/10 | 124.2 |
| 10/24/10 | 147.9 |
| 10/24/10 | 136.3 |
| 10/24/10 | 106 |
| 10/24/10 | 154.2 |
| 10/24/10 | 115.6 |
| 10/24/10 | 79.7 |
| 10/24/10 | 161.1 |
| 10/24/10 | 159.6 |
| 10/24/10 | 134 |
| 10/24/10 | 164.5 |
| 10/24/10 | 111.2 |
| 10/24/10 | 179.9 |
| 10/24/10 | 156 |
| 10/24/10 | 141 |
| 10/24/10 | 134.9 |
| 10/24/10 | 121.7 |
| 10/24/10 | 115.9 |
| 10/24/10 | 79.7 |
| 10/24/10 | 125.9 |
| 10/24/10 | 132.6 |
| 10/24/10 | 125.4 |
| 10/24/10 | 156.5 |
| 10/24/10 | 75.2 |
| 10/24/10 | 135.8 |
| 10/24/10 | 81.2 |
| 10/24/10 | 79.1 |
| 10/24/10 | 92.2 |
| 10/24/10 | 134.2 |
| 10/24/10 | 102.2 |
| 10/24/10 | 141.4 |
| 10/24/10 | 147 |
| 10/24/10 | 158.3 |
| 10/24/10 | 100.4 |
| 10/24/10 | 82.1 |
| 10/24/10 | 112.6 |
| 10/24/10 | 64.5 |
| 10/24/10 | 160.3 |
| 10/24/10 | 79.3 |
| 10/24/10 | 166.2 |
| 10/24/10 | 120.9 |
| 10/24/10 | 87 |
| 10/24/10 | 85.1 |
| 10/24/10 | 168.1 |
| 10/24/10 | 168.9 |
| 10/24/10 | 96.3 |
| 10/24/10 | 168.9 |
| 10/24/10 | 131.9 |
| 10/24/10 | 141.8 |
| 10/25/10 | 178.7 |
| 10/25/10 | 154.1 |
| 10/25/10 | 173.9 |
| 10/25/10 | 120.2 |
| 10/25/10 | 182.9 |
| 10/25/10 | 92.1 |
| 10/25/10 | 101.2 |
| 10/25/10 | 104.9 |
| 10/25/10 | 184.3 |
| 10/25/10 | 103.7 |
| 10/25/10 | 166.5 |
| 10/25/10 | 165.9 |
| 10/25/10 | 131 |
| 10/25/10 | 113.5 |
| 10/25/10 | 170 |
| 10/25/10 | 141.5 |
| 10/25/10 | 180.4 |
| 10/25/10 | 170.8 |
| 10/25/10 | 167.3 |
| 10/25/10 | 166.7 |
| 10/25/10 | 130.4 |
| 10/25/10 | 108 |
| 10/25/10 | 56.8 |
| 10/25/10 | 58.7 |
| 10/25/10 | 67.6 |
| 10/25/10 | 66.6 |
| 10/25/10 | 58.5 |
| 10/25/10 | 43.1 |
| 10/25/10 | 68.9 |
| 10/25/10 | 46 |
| 10/25/10 | 49.4 |
| 10/25/10 | 65.7 |
| 10/25/10 | 47.9 |
| 10/25/10 | 41.9 |
| 10/25/10 | 39.2 |
| 10/25/10 | 46.1 |
| 10/25/10 | 59.9 |
| 10/25/10 | 71.1 |
| 10/25/10 | 43.6 |
| 10/25/10 | 44.1 |
| 10/25/10 | 76.6 |
| 10/25/10 | 71.5 |
| 10/25/10 | 56.3 |
| 10/25/10 | 48.6 |
| 10/25/10 | 50.1 |
| 10/25/10 | 69.9 |
| 10/25/10 | 55.4 |
| 10/25/10 | 46.2 |
| 10/26/10 | 37.7 |
| 10/26/10 | 39.9 |
| 10/26/10 | 43.3 |
| 10/26/10 | 50.7 |
| 10/26/10 | 64.5 |
| 10/26/10 | 68.4 |
| 10/26/10 | 46.3 |
| 10/26/10 | 64.4 |
| 10/26/10 | 55.3 |
| 10/26/10 | 64.1 |
| 10/26/10 | 70.9 |
| 10/26/10 | 83.5 |
| 10/26/10 | 81.4 |
| 10/26/10 | 62.4 |
| 10/26/10 | 82.7 |
| 10/26/10 | 56.7 |
| 10/26/10 | 69.1 |
| 10/26/10 | 74.4 |
| 10/26/10 | 72 |
| 10/26/10 | 82.4 |
| 10/26/10 | 87.7 |
| 10/26/10 | 73.4 |
| 10/26/10 | 69.7 |
| 10/26/10 | 71.9 |
| 10/26/10 | 67.8 |
| 10/26/10 | 86.2 |
| 10/26/10 | 73.6 |
| 10/26/10 | 72.9 |
| 10/26/10 | 75.5 |
| 10/26/10 | 62.5 |
| 10/26/10 | 49.8 |
| 10/26/10 | 70.5 |
| 10/26/10 | 81 |
| 10/26/10 | 80 |
| 10/26/10 | 89.6 |
| 10/26/10 | 81.7 |
| 10/26/10 | 69.2 |
| 10/26/10 | 68.6 |
| 10/26/10 | 60.7 |
| 10/26/10 | 56.2 |
| 10/26/10 | 53.2 |
| 10/26/10 | 80 |
| 10/26/10 | 71.7 |
| 10/26/10 | 104.1 |
| 10/26/10 | 86.9 |
| 10/26/10 | 86.6 |
| 10/26/10 | 86.6 |
| 10/26/10 | 75.3 |
| 10/27/10 | 98.8 |
| 10/27/10 | 64.7 |
| 10/27/10 | 101.7 |
| 10/27/10 | 94.7 |
| 10/27/10 | 91.4 |
| 10/27/10 | 75.7 |
| 10/27/10 | 95.4 |
| 10/27/10 | 93.8 |
| 10/27/10 | 70.1 |
| 10/27/10 | 71.5 |
| 10/27/10 | 80.6 |
| 10/27/10 | 100.9 |
| 10/27/10 | 81.6 |
| 10/27/10 | 88.5 |
| 10/27/10 | 89.6 |
| 10/27/10 | 82.7 |
| 10/27/10 | 78 |
| 10/27/10 | 88.8 |
| 10/27/10 | 89.7 |
| 10/27/10 | 86.5 |
| 10/27/10 | 80.6 |
| 10/27/10 | 74.2 |
| 10/27/10 | 91.2 |
| 10/27/10 | 94.4 |
| 10/27/10 | 82.1 |
| 10/27/10 | 76 |
| 10/27/10 | 95.3 |
| 10/27/10 | 78.4 |
| 10/27/10 | 94.4 |
| 10/27/10 | 135.9 |
| 10/27/10 | 104.4 |
| 10/27/10 | 117.5 |
| 10/27/10 | 139.6 |
| 10/27/10 | 117.1 |
| 10/27/10 | 126.2 |
| 10/27/10 | 124 |
| 10/27/10 | 144.6 |
| 10/27/10 | 125.6 |
| 10/27/10 | 116.7 |
| 10/27/10 | 153.8 |
| 10/27/10 | 162.6 |
| 10/27/10 | 137.3 |
| 10/27/10 | 124 |
| 10/27/10 | 137.5 |
| 10/27/10 | 143.1 |
| 10/27/10 | 155.5 |
| 10/27/10 | 174.6 |
| 10/27/10 | 188.4 |
| 10/28/10 | 153.5 |
| 10/28/10 | 172.8 |
| 10/28/10 | 204 |
| 10/28/10 | 209.3 |
| 10/28/10 | 163.8 |
| 10/28/10 | 146.5 |
| 10/28/10 | 214.5 |
| 10/28/10 | 166.2 |
| 10/28/10 | 217.8 |
| 10/28/10 | 172.2 |
| 10/28/10 | 209.6 |
| 10/28/10 | 163.8 |
| 10/28/10 | 166 |
| 10/28/10 | 189.2 |
| 10/28/10 | 145.1 |
| 10/28/10 | 279.3 |
| 10/28/10 | 243.9 |
| 10/28/10 | 143.9 |
| 10/28/10 | 229 |
| 10/28/10 | 299.5 |
| 10/28/10 | 301.1 |
| 10/28/10 | 172.5 |
| 10/28/10 | 346.5 |
| 10/28/10 | 228.5 |
| 10/28/10 | 152.3 |
| 10/28/10 | 342.9 |
| 10/28/10 | 253.3 |
| 10/28/10 | 348.8 |
| 10/28/10 | 357.1 |
| 10/28/10 | 282.9 |
| 10/28/10 | 391 |
| 10/28/10 | 315.3 |
| 10/28/10 | 407.7 |
| 10/28/10 | 480.8 |
| 10/28/10 | 475.3 |
| 10/28/10 | 362.8 |
| 10/28/10 | 347.1 |
| 10/28/10 | 380 |
| 10/28/10 | 273.2 |
| 10/28/10 | 437.6 |
| 10/28/10 | 259.9 |
| 10/28/10 | 291.4 |
| 10/28/10 | 489.7 |
| 10/28/10 | 515.9 |
| 10/28/10 | 325.7 |
| 10/28/10 | 430.1 |
| 10/28/10 | 413.2 |
| 10/28/10 | 453.7 |
| 10/29/10 | 529.3 |
| 10/29/10 | 415.2 |
| 10/29/10 | 444.1 |
| 10/29/10 | 350.9 |
| 10/29/10 | 435.3 |
| 10/29/10 | 275.2 |
| 10/29/10 | 325.4 |
| 10/29/10 | 379.7 |
| 10/29/10 | 391.7 |
| 10/29/10 | 501.4 |
| 10/29/10 | 362.7 |
| 10/29/10 | 484.3 |
| 10/29/10 | 282.5 |
| 10/29/10 | 479.3 |
| 10/29/10 | 563.7 |
| 10/29/10 | 511.9 |
| 10/29/10 | 585.9 |
| 10/29/10 | 404.4 |
| 10/29/10 | 606.7 |
| 10/29/10 | 423.9 |
| 10/29/10 | 587 |
| 10/29/10 | 527.1 |
| 10/29/10 | 483.4 |
| 10/29/10 | 403.8 |
| 10/29/10 | 647.5 |
| 10/29/10 | 667.3 |